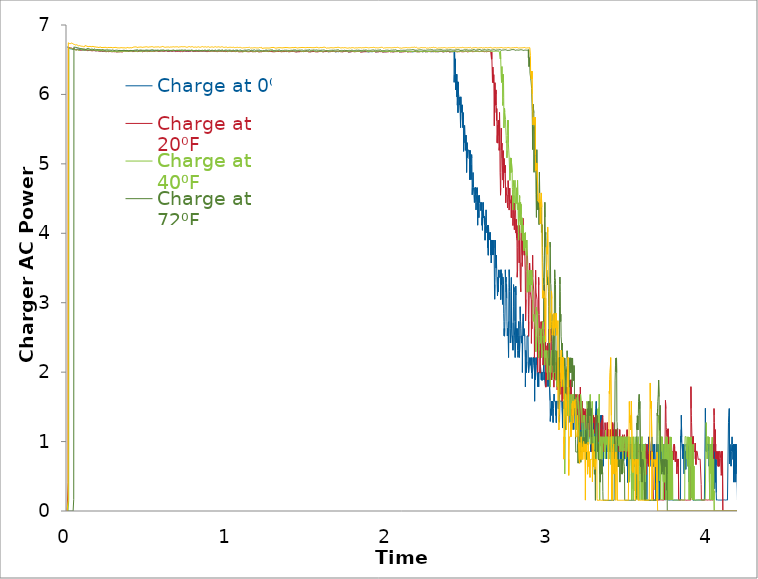
| Category | Charge at 0⁰F | Charge at 20⁰F | Charge at 40⁰F | Charge at 72⁰F | Charge at 95⁰F |
|---|---|---|---|---|---|
| 0.0138888888888889 | 6.688 | 0 | 0 | 0 | 0 |
| 0.0152777777777778 | 6.687 | 0 | 0 | 0 | 0 |
| 0.0166666666666667 | 6.683 | 0 | 0 | 0 | 0 |
| 0.0180555555555556 | 6.68 | 0 | 0 | 0 | 0 |
| 0.0194444444444444 | 6.679 | 0 | 0 | 0 | 0 |
| 0.0208333333333333 | 6.674 | 0.409 | 0 | 0 | 0.147 |
| 0.0222222222222222 | 6.677 | 6.667 | 0 | 0 | 6.744 |
| 0.0236111111111111 | 6.675 | 6.673 | 0 | 0 | 6.743 |
| 0.025 | 6.678 | 6.677 | 0.154 | 0 | 6.737 |
| 0.0263888888888889 | 6.673 | 6.669 | 6.667 | 0 | 6.741 |
| 0.0277777777777778 | 6.672 | 6.666 | 6.664 | 0 | 6.738 |
| 0.0291666666666667 | 6.673 | 6.674 | 6.671 | 0 | 6.734 |
| 0.0305555555555556 | 6.663 | 6.671 | 6.66 | 0 | 6.736 |
| 0.0319444444444444 | 6.666 | 6.673 | 6.666 | 0 | 6.742 |
| 0.0333333333333333 | 6.667 | 6.665 | 6.661 | 0 | 6.733 |
| 0.0347222222222222 | 6.656 | 6.664 | 6.658 | 0 | 6.732 |
| 0.0361111111111111 | 6.659 | 6.671 | 6.668 | 0 | 6.731 |
| 0.0375 | 6.66 | 6.67 | 6.667 | 0 | 6.731 |
| 0.0388888888888889 | 6.657 | 6.668 | 6.661 | 0 | 6.744 |
| 0.0402777777777778 | 6.661 | 6.671 | 6.663 | 0 | 6.744 |
| 0.0416666666666667 | 6.657 | 6.668 | 6.657 | 0 | 6.744 |
| 0.0430555555555556 | 6.654 | 6.669 | 6.663 | 0 | 6.739 |
| 0.0444444444444444 | 6.649 | 6.665 | 6.657 | 0 | 6.736 |
| 0.0458333333333333 | 6.65 | 6.673 | 6.655 | 0 | 6.742 |
| 0.0472222222222222 | 6.651 | 6.663 | 6.659 | 0 | 6.735 |
| 0.0486111111111111 | 6.652 | 6.665 | 6.651 | 0 | 6.736 |
| 0.05 | 6.653 | 6.658 | 6.652 | 0 | 6.735 |
| 0.0513888888888889 | 6.646 | 6.664 | 6.653 | 0 | 6.731 |
| 0.0527777777777778 | 6.648 | 6.666 | 6.656 | 0 | 6.734 |
| 0.0541666666666667 | 6.65 | 6.66 | 6.648 | 0 | 6.729 |
| 0.0555555555555556 | 6.648 | 6.658 | 6.646 | 0 | 6.73 |
| 0.0569444444444444 | 6.645 | 6.659 | 6.646 | 0 | 6.726 |
| 0.0583333333333333 | 6.645 | 6.656 | 6.65 | 0 | 6.731 |
| 0.0597222222222222 | 6.652 | 6.65 | 6.649 | 0.167 | 6.721 |
| 0.0611111111111111 | 6.65 | 6.651 | 6.652 | 6.685 | 6.724 |
| 0.0625 | 6.653 | 6.656 | 6.646 | 6.686 | 6.729 |
| 0.0638888888888889 | 6.649 | 6.657 | 6.649 | 6.68 | 6.721 |
| 0.0652777777777778 | 6.647 | 6.653 | 6.648 | 6.68 | 6.723 |
| 0.0666666666666667 | 6.645 | 6.652 | 6.647 | 6.678 | 6.721 |
| 0.0680555555555556 | 6.643 | 6.644 | 6.649 | 6.676 | 6.725 |
| 0.0694444444444445 | 6.648 | 6.648 | 6.644 | 6.685 | 6.713 |
| 0.0708333333333333 | 6.65 | 6.644 | 6.644 | 6.683 | 6.712 |
| 0.0722222222222222 | 6.645 | 6.642 | 6.647 | 6.676 | 6.714 |
| 0.0736111111111111 | 6.646 | 6.645 | 6.644 | 6.685 | 6.713 |
| 0.075 | 6.643 | 6.642 | 6.639 | 6.68 | 6.716 |
| 0.0763888888888889 | 6.649 | 6.644 | 6.641 | 6.685 | 6.716 |
| 0.0777777777777778 | 6.647 | 6.641 | 6.637 | 6.673 | 6.716 |
| 0.0791666666666667 | 6.645 | 6.642 | 6.639 | 6.678 | 6.711 |
| 0.0805555555555556 | 6.641 | 6.644 | 6.645 | 6.674 | 6.71 |
| 0.0819444444444444 | 6.644 | 6.642 | 6.639 | 6.674 | 6.713 |
| 0.0833333333333333 | 6.652 | 6.653 | 6.64 | 6.678 | 6.709 |
| 0.0847222222222222 | 6.643 | 6.648 | 6.64 | 6.676 | 6.711 |
| 0.0861111111111111 | 6.638 | 6.644 | 6.638 | 6.671 | 6.704 |
| 0.0875 | 6.647 | 6.643 | 6.643 | 6.671 | 6.705 |
| 0.0888888888888889 | 6.644 | 6.644 | 6.644 | 6.671 | 6.702 |
| 0.0902777777777778 | 6.654 | 6.64 | 6.642 | 6.675 | 6.703 |
| 0.0916666666666667 | 6.645 | 6.639 | 6.637 | 6.675 | 6.7 |
| 0.0930555555555556 | 6.654 | 6.639 | 6.636 | 6.676 | 6.696 |
| 0.0944444444444444 | 6.646 | 6.645 | 6.643 | 6.666 | 6.693 |
| 0.0958333333333333 | 6.652 | 6.641 | 6.638 | 6.666 | 6.704 |
| 0.0972222222222222 | 6.651 | 6.639 | 6.637 | 6.666 | 6.705 |
| 0.0986111111111111 | 6.649 | 6.639 | 6.631 | 6.668 | 6.703 |
| 0.1 | 6.648 | 6.638 | 6.641 | 6.657 | 6.698 |
| 0.101388888888889 | 6.649 | 6.642 | 6.64 | 6.666 | 6.696 |
| 0.102777777777778 | 6.643 | 6.641 | 6.633 | 6.662 | 6.705 |
| 0.104166666666667 | 6.648 | 6.636 | 6.638 | 6.669 | 6.703 |
| 0.105555555555556 | 6.644 | 6.635 | 6.637 | 6.662 | 6.699 |
| 0.106944444444444 | 6.642 | 6.64 | 6.636 | 6.661 | 6.699 |
| 0.108333333333333 | 6.648 | 6.638 | 6.641 | 6.659 | 6.694 |
| 0.109722222222222 | 6.641 | 6.641 | 6.65 | 6.659 | 6.701 |
| 0.111111111111111 | 6.642 | 6.641 | 6.646 | 6.662 | 6.697 |
| 0.1125 | 6.645 | 6.639 | 6.644 | 6.659 | 6.695 |
| 0.113888888888889 | 6.641 | 6.634 | 6.643 | 6.669 | 6.687 |
| 0.115277777777778 | 6.644 | 6.634 | 6.641 | 6.664 | 6.698 |
| 0.116666666666667 | 6.642 | 6.64 | 6.647 | 6.66 | 6.692 |
| 0.118055555555556 | 6.641 | 6.647 | 6.645 | 6.659 | 6.691 |
| 0.119444444444444 | 6.641 | 6.641 | 6.639 | 6.658 | 6.694 |
| 0.120833333333333 | 6.638 | 6.639 | 6.644 | 6.654 | 6.696 |
| 0.122222222222222 | 6.643 | 6.641 | 6.639 | 6.66 | 6.689 |
| 0.123611111111111 | 6.637 | 6.643 | 6.636 | 6.656 | 6.686 |
| 0.125 | 6.641 | 6.645 | 6.641 | 6.654 | 6.693 |
| 0.126388888888889 | 6.637 | 6.643 | 6.639 | 6.653 | 6.688 |
| 0.127777777777778 | 6.643 | 6.637 | 6.648 | 6.661 | 6.686 |
| 0.129166666666667 | 6.638 | 6.644 | 6.638 | 6.659 | 6.693 |
| 0.130555555555556 | 6.642 | 6.641 | 6.641 | 6.655 | 6.688 |
| 0.131944444444444 | 6.637 | 6.638 | 6.64 | 6.648 | 6.684 |
| 0.133333333333333 | 6.637 | 6.643 | 6.638 | 6.656 | 6.686 |
| 0.134722222222222 | 6.636 | 6.64 | 6.641 | 6.653 | 6.688 |
| 0.136111111111111 | 6.635 | 6.646 | 6.637 | 6.651 | 6.695 |
| 0.1375 | 6.639 | 6.637 | 6.641 | 6.653 | 6.704 |
| 0.138888888888889 | 6.637 | 6.633 | 6.634 | 6.652 | 6.695 |
| 0.140277777777778 | 6.639 | 6.64 | 6.641 | 6.649 | 6.702 |
| 0.141666666666667 | 6.627 | 6.635 | 6.639 | 6.647 | 6.697 |
| 0.143055555555556 | 6.634 | 6.642 | 6.638 | 6.656 | 6.697 |
| 0.144444444444444 | 6.635 | 6.634 | 6.637 | 6.647 | 6.699 |
| 0.145833333333333 | 6.641 | 6.638 | 6.634 | 6.645 | 6.694 |
| 0.147222222222222 | 6.628 | 6.637 | 6.644 | 6.652 | 6.7 |
| 0.148611111111111 | 6.636 | 6.635 | 6.638 | 6.65 | 6.696 |
| 0.15 | 6.638 | 6.638 | 6.64 | 6.655 | 6.689 |
| 0.151388888888889 | 6.637 | 6.632 | 6.643 | 6.659 | 6.695 |
| 0.152777777777778 | 6.641 | 6.638 | 6.647 | 6.657 | 6.693 |
| 0.154166666666667 | 6.635 | 6.631 | 6.637 | 6.662 | 6.697 |
| 0.155555555555556 | 6.639 | 6.637 | 6.638 | 6.658 | 6.694 |
| 0.156944444444444 | 6.636 | 6.632 | 6.637 | 6.656 | 6.703 |
| 0.158333333333333 | 6.636 | 6.638 | 6.642 | 6.661 | 6.689 |
| 0.159722222222222 | 6.633 | 6.634 | 6.641 | 6.653 | 6.697 |
| 0.161111111111111 | 6.636 | 6.636 | 6.647 | 6.662 | 6.694 |
| 0.1625 | 6.636 | 6.631 | 6.633 | 6.657 | 6.693 |
| 0.163888888888889 | 6.638 | 6.635 | 6.642 | 6.652 | 6.692 |
| 0.165277777777778 | 6.631 | 6.632 | 6.64 | 6.657 | 6.688 |
| 0.166666666666667 | 6.633 | 6.637 | 6.639 | 6.65 | 6.694 |
| 0.168055555555556 | 6.641 | 6.635 | 6.639 | 6.659 | 6.688 |
| 0.169444444444444 | 6.632 | 6.633 | 6.64 | 6.654 | 6.692 |
| 0.170833333333333 | 6.634 | 6.629 | 6.643 | 6.663 | 6.691 |
| 0.172222222222222 | 6.633 | 6.632 | 6.637 | 6.652 | 6.694 |
| 0.173611111111111 | 6.64 | 6.632 | 6.64 | 6.657 | 6.691 |
| 0.175 | 6.63 | 6.632 | 6.637 | 6.656 | 6.694 |
| 0.176388888888889 | 6.635 | 6.626 | 6.641 | 6.653 | 6.69 |
| 0.177777777777778 | 6.638 | 6.633 | 6.636 | 6.653 | 6.691 |
| 0.179166666666667 | 6.631 | 6.628 | 6.64 | 6.647 | 6.689 |
| 0.180555555555556 | 6.633 | 6.631 | 6.631 | 6.652 | 6.692 |
| 0.181944444444444 | 6.632 | 6.63 | 6.636 | 6.649 | 6.688 |
| 0.183333333333333 | 6.637 | 6.634 | 6.64 | 6.649 | 6.692 |
| 0.184722222222222 | 6.636 | 6.626 | 6.635 | 6.65 | 6.69 |
| 0.186111111111111 | 6.631 | 6.632 | 6.641 | 6.656 | 6.686 |
| 0.1875 | 6.635 | 6.624 | 6.634 | 6.65 | 6.687 |
| 0.188888888888889 | 6.628 | 6.628 | 6.639 | 6.653 | 6.69 |
| 0.190277777777778 | 6.633 | 6.631 | 6.636 | 6.648 | 6.694 |
| 0.191666666666667 | 6.634 | 6.629 | 6.637 | 6.654 | 6.691 |
| 0.193055555555556 | 6.632 | 6.636 | 6.638 | 6.648 | 6.695 |
| 0.194444444444444 | 6.633 | 6.626 | 6.635 | 6.65 | 6.685 |
| 0.195833333333333 | 6.627 | 6.631 | 6.64 | 6.648 | 6.687 |
| 0.197222222222222 | 6.63 | 6.621 | 6.633 | 6.653 | 6.687 |
| 0.198611111111111 | 6.633 | 6.627 | 6.634 | 6.645 | 6.689 |
| 0.2 | 6.632 | 6.626 | 6.638 | 6.648 | 6.684 |
| 0.201388888888889 | 6.634 | 6.627 | 6.634 | 6.644 | 6.686 |
| 0.202777777777778 | 6.636 | 6.631 | 6.636 | 6.652 | 6.688 |
| 0.204166666666667 | 6.628 | 6.625 | 6.637 | 6.655 | 6.684 |
| 0.205555555555556 | 6.63 | 6.63 | 6.636 | 6.652 | 6.689 |
| 0.206944444444444 | 6.624 | 6.627 | 6.64 | 6.657 | 6.687 |
| 0.208333333333333 | 6.629 | 6.625 | 6.631 | 6.643 | 6.689 |
| 0.209722222222222 | 6.634 | 6.629 | 6.634 | 6.647 | 6.685 |
| 0.211111111111111 | 6.63 | 6.625 | 6.638 | 6.647 | 6.685 |
| 0.2125 | 6.631 | 6.632 | 6.629 | 6.652 | 6.688 |
| 0.213888888888889 | 6.634 | 6.623 | 6.636 | 6.642 | 6.682 |
| 0.215277777777778 | 6.63 | 6.626 | 6.632 | 6.648 | 6.686 |
| 0.216666666666667 | 6.633 | 6.627 | 6.634 | 6.65 | 6.683 |
| 0.218055555555556 | 6.637 | 6.621 | 6.638 | 6.645 | 6.687 |
| 0.219444444444444 | 6.636 | 6.627 | 6.628 | 6.65 | 6.689 |
| 0.220833333333333 | 6.633 | 6.629 | 6.632 | 6.646 | 6.68 |
| 0.222222222222222 | 6.632 | 6.628 | 6.636 | 6.651 | 6.685 |
| 0.223611111111111 | 6.628 | 6.629 | 6.632 | 6.644 | 6.685 |
| 0.225 | 6.627 | 6.621 | 6.633 | 6.645 | 6.682 |
| 0.226388888888889 | 6.633 | 6.625 | 6.636 | 6.65 | 6.685 |
| 0.227777777777778 | 6.626 | 6.632 | 6.629 | 6.645 | 6.68 |
| 0.229166666666667 | 6.631 | 6.626 | 6.633 | 6.648 | 6.682 |
| 0.230555555555556 | 6.631 | 6.625 | 6.632 | 6.646 | 6.686 |
| 0.231944444444444 | 6.624 | 6.628 | 6.627 | 6.646 | 6.681 |
| 0.233333333333333 | 6.626 | 6.624 | 6.631 | 6.654 | 6.685 |
| 0.234722222222222 | 6.629 | 6.623 | 6.633 | 6.643 | 6.674 |
| 0.236111111111111 | 6.628 | 6.625 | 6.628 | 6.649 | 6.678 |
| 0.2375 | 6.628 | 6.623 | 6.632 | 6.639 | 6.682 |
| 0.238888888888889 | 6.633 | 6.626 | 6.632 | 6.643 | 6.679 |
| 0.240277777777778 | 6.627 | 6.618 | 6.629 | 6.648 | 6.682 |
| 0.241666666666667 | 6.624 | 6.623 | 6.633 | 6.645 | 6.685 |
| 0.243055555555556 | 6.627 | 6.628 | 6.638 | 6.648 | 6.679 |
| 0.244444444444444 | 6.629 | 6.621 | 6.628 | 6.645 | 6.681 |
| 0.245833333333333 | 6.624 | 6.626 | 6.633 | 6.644 | 6.684 |
| 0.247222222222222 | 6.628 | 6.628 | 6.636 | 6.646 | 6.675 |
| 0.248611111111111 | 6.63 | 6.629 | 6.626 | 6.64 | 6.678 |
| 0.25 | 6.628 | 6.625 | 6.628 | 6.644 | 6.677 |
| 0.251388888888889 | 6.628 | 6.626 | 6.633 | 6.648 | 6.676 |
| 0.252777777777778 | 6.631 | 6.622 | 6.627 | 6.642 | 6.679 |
| 0.254166666666667 | 6.617 | 6.621 | 6.63 | 6.642 | 6.674 |
| 0.255555555555556 | 6.622 | 6.626 | 6.634 | 6.644 | 6.674 |
| 0.256944444444444 | 6.623 | 6.621 | 6.624 | 6.64 | 6.677 |
| 0.258333333333333 | 6.624 | 6.62 | 6.627 | 6.645 | 6.675 |
| 0.259722222222222 | 6.621 | 6.624 | 6.632 | 6.641 | 6.676 |
| 0.261111111111111 | 6.623 | 6.624 | 6.631 | 6.638 | 6.679 |
| 0.2625 | 6.627 | 6.618 | 6.626 | 6.645 | 6.677 |
| 0.263888888888889 | 6.62 | 6.621 | 6.631 | 6.636 | 6.674 |
| 0.265277777777778 | 6.624 | 6.624 | 6.633 | 6.642 | 6.679 |
| 0.266666666666667 | 6.627 | 6.622 | 6.624 | 6.642 | 6.675 |
| 0.268055555555556 | 6.629 | 6.623 | 6.628 | 6.636 | 6.672 |
| 0.269444444444444 | 6.62 | 6.624 | 6.629 | 6.639 | 6.677 |
| 0.270833333333333 | 6.623 | 6.617 | 6.628 | 6.644 | 6.678 |
| 0.272222222222222 | 6.628 | 6.622 | 6.626 | 6.639 | 6.679 |
| 0.273611111111111 | 6.623 | 6.622 | 6.629 | 6.641 | 6.678 |
| 0.275 | 6.625 | 6.619 | 6.628 | 6.646 | 6.681 |
| 0.276388888888889 | 6.626 | 6.62 | 6.626 | 6.639 | 6.678 |
| 0.277777777777778 | 6.628 | 6.624 | 6.628 | 6.639 | 6.681 |
| 0.279166666666667 | 6.621 | 6.617 | 6.631 | 6.642 | 6.681 |
| 0.280555555555556 | 6.619 | 6.622 | 6.618 | 6.635 | 6.683 |
| 0.281944444444444 | 6.622 | 6.625 | 6.618 | 6.638 | 6.675 |
| 0.283333333333333 | 6.622 | 6.628 | 6.625 | 6.641 | 6.678 |
| 0.284722222222222 | 6.62 | 6.614 | 6.626 | 6.64 | 6.68 |
| 0.286111111111111 | 6.622 | 6.616 | 6.622 | 6.638 | 6.673 |
| 0.2875 | 6.62 | 6.619 | 6.623 | 6.644 | 6.676 |
| 0.288888888888889 | 6.62 | 6.613 | 6.625 | 6.64 | 6.677 |
| 0.290277777777778 | 6.622 | 6.616 | 6.621 | 6.641 | 6.668 |
| 0.291666666666667 | 6.623 | 6.618 | 6.625 | 6.645 | 6.674 |
| 0.293055555555556 | 6.626 | 6.619 | 6.626 | 6.647 | 6.678 |
| 0.294444444444444 | 6.621 | 6.618 | 6.629 | 6.636 | 6.673 |
| 0.295833333333333 | 6.618 | 6.621 | 6.616 | 6.64 | 6.675 |
| 0.297222222222222 | 6.622 | 6.624 | 6.626 | 6.642 | 6.677 |
| 0.298611111111111 | 6.623 | 6.614 | 6.625 | 6.636 | 6.677 |
| 0.3 | 6.619 | 6.616 | 6.626 | 6.635 | 6.671 |
| 0.301388888888889 | 6.62 | 6.618 | 6.622 | 6.64 | 6.676 |
| 0.302777777777778 | 6.621 | 6.621 | 6.624 | 6.641 | 6.679 |
| 0.304166666666667 | 6.623 | 6.616 | 6.625 | 6.637 | 6.676 |
| 0.305555555555556 | 6.619 | 6.616 | 6.624 | 6.643 | 6.67 |
| 0.306944444444444 | 6.615 | 6.618 | 6.618 | 6.642 | 6.674 |
| 0.308333333333333 | 6.62 | 6.617 | 6.621 | 6.636 | 6.677 |
| 0.309722222222222 | 6.622 | 6.612 | 6.623 | 6.637 | 6.672 |
| 0.311111111111111 | 6.618 | 6.614 | 6.625 | 6.642 | 6.674 |
| 0.3125 | 6.617 | 6.618 | 6.621 | 6.639 | 6.677 |
| 0.313888888888889 | 6.62 | 6.62 | 6.624 | 6.64 | 6.679 |
| 0.315277777777778 | 6.623 | 6.615 | 6.625 | 6.642 | 6.674 |
| 0.316666666666667 | 6.62 | 6.616 | 6.622 | 6.64 | 6.677 |
| 0.318055555555556 | 6.621 | 6.621 | 6.62 | 6.634 | 6.68 |
| 0.319444444444444 | 6.624 | 6.615 | 6.624 | 6.635 | 6.68 |
| 0.320833333333333 | 6.623 | 6.615 | 6.626 | 6.64 | 6.668 |
| 0.322222222222222 | 6.619 | 6.618 | 6.624 | 6.638 | 6.67 |
| 0.323611111111111 | 6.617 | 6.619 | 6.617 | 6.637 | 6.673 |
| 0.325 | 6.618 | 6.619 | 6.618 | 6.64 | 6.671 |
| 0.326388888888889 | 6.62 | 6.612 | 6.623 | 6.642 | 6.67 |
| 0.327777777777778 | 6.623 | 6.615 | 6.624 | 6.638 | 6.675 |
| 0.329166666666667 | 6.617 | 6.619 | 6.617 | 6.64 | 6.675 |
| 0.330555555555556 | 6.617 | 6.613 | 6.624 | 6.642 | 6.672 |
| 0.331944444444444 | 6.621 | 6.614 | 6.622 | 6.64 | 6.673 |
| 0.333333333333333 | 6.62 | 6.619 | 6.626 | 6.631 | 6.676 |
| 0.334722222222222 | 6.617 | 6.616 | 6.616 | 6.633 | 6.68 |
| 0.336111111111111 | 6.616 | 6.615 | 6.619 | 6.635 | 6.669 |
| 0.3375 | 6.615 | 6.612 | 6.619 | 6.635 | 6.674 |
| 0.338888888888889 | 6.617 | 6.615 | 6.621 | 6.632 | 6.675 |
| 0.340277777777778 | 6.623 | 6.618 | 6.616 | 6.633 | 6.675 |
| 0.341666666666667 | 6.613 | 6.615 | 6.614 | 6.637 | 6.675 |
| 0.343055555555556 | 6.616 | 6.613 | 6.62 | 6.643 | 6.673 |
| 0.344444444444444 | 6.62 | 6.616 | 6.619 | 6.634 | 6.674 |
| 0.345833333333333 | 6.617 | 6.618 | 6.622 | 6.635 | 6.677 |
| 0.347222222222222 | 6.62 | 6.62 | 6.618 | 6.64 | 6.678 |
| 0.348611111111111 | 6.615 | 6.615 | 6.619 | 6.633 | 6.67 |
| 0.35 | 6.617 | 6.612 | 6.624 | 6.634 | 6.673 |
| 0.351388888888889 | 6.62 | 6.618 | 6.624 | 6.634 | 6.675 |
| 0.352777777777778 | 6.621 | 6.621 | 6.616 | 6.637 | 6.677 |
| 0.354166666666667 | 6.62 | 6.61 | 6.613 | 6.638 | 6.67 |
| 0.355555555555556 | 6.615 | 6.611 | 6.617 | 6.632 | 6.671 |
| 0.356944444444444 | 6.614 | 6.613 | 6.622 | 6.635 | 6.676 |
| 0.358333333333333 | 6.618 | 6.616 | 6.624 | 6.638 | 6.676 |
| 0.359722222222222 | 6.62 | 6.618 | 6.616 | 6.638 | 6.671 |
| 0.361111111111111 | 6.614 | 6.613 | 6.617 | 6.631 | 6.673 |
| 0.3625 | 6.615 | 6.613 | 6.621 | 6.632 | 6.677 |
| 0.363888888888889 | 6.618 | 6.616 | 6.621 | 6.635 | 6.678 |
| 0.365277777777778 | 6.62 | 6.62 | 6.623 | 6.638 | 6.679 |
| 0.366666666666667 | 6.622 | 6.61 | 6.616 | 6.633 | 6.671 |
| 0.368055555555556 | 6.624 | 6.609 | 6.617 | 6.633 | 6.672 |
| 0.369444444444444 | 6.623 | 6.613 | 6.616 | 6.634 | 6.673 |
| 0.370833333333333 | 6.628 | 6.613 | 6.617 | 6.64 | 6.676 |
| 0.372222222222222 | 6.629 | 6.618 | 6.621 | 6.633 | 6.67 |
| 0.373611111111111 | 6.628 | 6.612 | 6.612 | 6.634 | 6.67 |
| 0.375 | 6.632 | 6.613 | 6.616 | 6.636 | 6.675 |
| 0.376388888888889 | 6.632 | 6.615 | 6.619 | 6.638 | 6.674 |
| 0.377777777777778 | 6.621 | 6.615 | 6.619 | 6.639 | 6.679 |
| 0.379166666666667 | 6.625 | 6.618 | 6.62 | 6.632 | 6.668 |
| 0.380555555555556 | 6.624 | 6.611 | 6.614 | 6.634 | 6.671 |
| 0.381944444444444 | 6.628 | 6.613 | 6.614 | 6.637 | 6.671 |
| 0.383333333333333 | 6.625 | 6.615 | 6.619 | 6.636 | 6.675 |
| 0.384722222222222 | 6.63 | 6.617 | 6.618 | 6.633 | 6.674 |
| 0.386111111111111 | 6.628 | 6.617 | 6.623 | 6.634 | 6.671 |
| 0.3875 | 6.622 | 6.608 | 6.616 | 6.633 | 6.673 |
| 0.388888888888889 | 6.626 | 6.611 | 6.614 | 6.638 | 6.674 |
| 0.390277777777778 | 6.624 | 6.612 | 6.615 | 6.639 | 6.678 |
| 0.391666666666667 | 6.629 | 6.614 | 6.618 | 6.628 | 6.676 |
| 0.393055555555556 | 6.627 | 6.613 | 6.617 | 6.631 | 6.669 |
| 0.394444444444444 | 6.631 | 6.611 | 6.619 | 6.633 | 6.672 |
| 0.395833333333333 | 6.63 | 6.611 | 6.613 | 6.637 | 6.677 |
| 0.397222222222222 | 6.627 | 6.612 | 6.612 | 6.633 | 6.677 |
| 0.398611111111111 | 6.626 | 6.613 | 6.617 | 6.632 | 6.672 |
| 0.4 | 6.627 | 6.616 | 6.618 | 6.633 | 6.668 |
| 0.401388888888889 | 6.63 | 6.614 | 6.619 | 6.634 | 6.67 |
| 0.402777777777778 | 6.629 | 6.619 | 6.619 | 6.637 | 6.675 |
| 0.404166666666667 | 6.632 | 6.621 | 6.622 | 6.634 | 6.676 |
| 0.405555555555556 | 6.63 | 6.621 | 6.624 | 6.63 | 6.677 |
| 0.406944444444444 | 6.629 | 6.622 | 6.626 | 6.633 | 6.669 |
| 0.408333333333333 | 6.631 | 6.624 | 6.626 | 6.637 | 6.672 |
| 0.409722222222222 | 6.631 | 6.627 | 6.628 | 6.636 | 6.674 |
| 0.411111111111111 | 6.633 | 6.623 | 6.628 | 6.627 | 6.675 |
| 0.4125 | 6.634 | 6.617 | 6.629 | 6.631 | 6.677 |
| 0.413888888888889 | 6.634 | 6.615 | 6.626 | 6.631 | 6.666 |
| 0.415277777777778 | 6.625 | 6.618 | 6.618 | 6.631 | 6.67 |
| 0.416666666666667 | 6.627 | 6.62 | 6.62 | 6.636 | 6.67 |
| 0.418055555555556 | 6.623 | 6.623 | 6.622 | 6.635 | 6.674 |
| 0.419444444444444 | 6.626 | 6.623 | 6.621 | 6.632 | 6.673 |
| 0.420833333333333 | 6.627 | 6.622 | 6.624 | 6.632 | 6.672 |
| 0.422222222222222 | 6.628 | 6.626 | 6.624 | 6.635 | 6.668 |
| 0.423611111111111 | 6.627 | 6.62 | 6.625 | 6.636 | 6.669 |
| 0.425 | 6.624 | 6.619 | 6.624 | 6.633 | 6.67 |
| 0.426388888888889 | 6.627 | 6.62 | 6.626 | 6.628 | 6.672 |
| 0.427777777777778 | 6.629 | 6.621 | 6.624 | 6.631 | 6.675 |
| 0.429166666666667 | 6.628 | 6.619 | 6.619 | 6.633 | 6.675 |
| 0.430555555555556 | 6.629 | 6.624 | 6.62 | 6.632 | 6.672 |
| 0.431944444444444 | 6.63 | 6.62 | 6.622 | 6.634 | 6.67 |
| 0.433333333333333 | 6.632 | 6.62 | 6.623 | 6.633 | 6.673 |
| 0.434722222222222 | 6.628 | 6.627 | 6.623 | 6.628 | 6.674 |
| 0.436111111111111 | 6.626 | 6.624 | 6.624 | 6.63 | 6.674 |
| 0.4375 | 6.623 | 6.624 | 6.628 | 6.632 | 6.675 |
| 0.438888888888889 | 6.625 | 6.62 | 6.625 | 6.635 | 6.676 |
| 0.440277777777778 | 6.627 | 6.619 | 6.625 | 6.633 | 6.679 |
| 0.441666666666667 | 6.625 | 6.619 | 6.625 | 6.629 | 6.67 |
| 0.443055555555556 | 6.627 | 6.621 | 6.625 | 6.629 | 6.669 |
| 0.444444444444444 | 6.626 | 6.62 | 6.626 | 6.631 | 6.667 |
| 0.445833333333333 | 6.626 | 6.622 | 6.628 | 6.632 | 6.669 |
| 0.447222222222222 | 6.626 | 6.623 | 6.626 | 6.633 | 6.671 |
| 0.448611111111111 | 6.627 | 6.622 | 6.625 | 6.636 | 6.677 |
| 0.45 | 6.627 | 6.627 | 6.624 | 6.634 | 6.674 |
| 0.451388888888889 | 6.629 | 6.624 | 6.624 | 6.633 | 6.673 |
| 0.452777777777778 | 6.627 | 6.624 | 6.623 | 6.627 | 6.673 |
| 0.454166666666667 | 6.629 | 6.625 | 6.62 | 6.63 | 6.668 |
| 0.455555555555556 | 6.63 | 6.623 | 6.622 | 6.63 | 6.67 |
| 0.456944444444444 | 6.629 | 6.625 | 6.623 | 6.633 | 6.67 |
| 0.458333333333333 | 6.631 | 6.628 | 6.625 | 6.634 | 6.672 |
| 0.459722222222222 | 6.632 | 6.625 | 6.622 | 6.632 | 6.669 |
| 0.461111111111111 | 6.632 | 6.624 | 6.625 | 6.633 | 6.672 |
| 0.4625 | 6.633 | 6.629 | 6.626 | 6.63 | 6.676 |
| 0.463888888888889 | 6.631 | 6.62 | 6.623 | 6.628 | 6.673 |
| 0.465277777777778 | 6.63 | 6.617 | 6.624 | 6.629 | 6.676 |
| 0.466666666666667 | 6.633 | 6.617 | 6.626 | 6.628 | 6.677 |
| 0.468055555555556 | 6.626 | 6.615 | 6.626 | 6.628 | 6.682 |
| 0.469444444444444 | 6.629 | 6.616 | 6.626 | 6.63 | 6.678 |
| 0.470833333333333 | 6.626 | 6.618 | 6.628 | 6.632 | 6.68 |
| 0.472222222222222 | 6.621 | 6.616 | 6.628 | 6.631 | 6.681 |
| 0.473611111111111 | 6.624 | 6.618 | 6.627 | 6.634 | 6.68 |
| 0.475 | 6.622 | 6.618 | 6.628 | 6.634 | 6.681 |
| 0.476388888888889 | 6.623 | 6.622 | 6.624 | 6.636 | 6.682 |
| 0.477777777777778 | 6.626 | 6.62 | 6.626 | 6.636 | 6.683 |
| 0.479166666666667 | 6.624 | 6.62 | 6.627 | 6.635 | 6.681 |
| 0.480555555555556 | 6.625 | 6.618 | 6.626 | 6.635 | 6.684 |
| 0.481944444444444 | 6.623 | 6.621 | 6.619 | 6.638 | 6.684 |
| 0.483333333333333 | 6.625 | 6.622 | 6.618 | 6.636 | 6.684 |
| 0.484722222222222 | 6.627 | 6.619 | 6.62 | 6.638 | 6.684 |
| 0.486111111111111 | 6.623 | 6.622 | 6.619 | 6.64 | 6.684 |
| 0.4875 | 6.625 | 6.622 | 6.62 | 6.641 | 6.686 |
| 0.488888888888889 | 6.628 | 6.624 | 6.619 | 6.641 | 6.686 |
| 0.490277777777778 | 6.625 | 6.625 | 6.621 | 6.64 | 6.686 |
| 0.491666666666667 | 6.628 | 6.623 | 6.619 | 6.639 | 6.686 |
| 0.493055555555556 | 6.625 | 6.623 | 6.621 | 6.641 | 6.684 |
| 0.494444444444444 | 6.627 | 6.624 | 6.62 | 6.644 | 6.681 |
| 0.495833333333333 | 6.626 | 6.62 | 6.621 | 6.643 | 6.681 |
| 0.497222222222222 | 6.627 | 6.618 | 6.622 | 6.644 | 6.679 |
| 0.498611111111111 | 6.627 | 6.623 | 6.62 | 6.645 | 6.676 |
| 0.5 | 6.626 | 6.619 | 6.625 | 6.641 | 6.679 |
| 0.501388888888889 | 6.626 | 6.617 | 6.623 | 6.636 | 6.676 |
| 0.502777777777778 | 6.627 | 6.621 | 6.626 | 6.634 | 6.678 |
| 0.504166666666667 | 6.628 | 6.617 | 6.624 | 6.634 | 6.678 |
| 0.505555555555556 | 6.623 | 6.621 | 6.626 | 6.634 | 6.68 |
| 0.506944444444444 | 6.622 | 6.62 | 6.626 | 6.632 | 6.679 |
| 0.508333333333333 | 6.624 | 6.619 | 6.623 | 6.634 | 6.68 |
| 0.509722222222222 | 6.625 | 6.62 | 6.624 | 6.633 | 6.68 |
| 0.511111111111111 | 6.627 | 6.621 | 6.627 | 6.637 | 6.68 |
| 0.5125 | 6.623 | 6.621 | 6.628 | 6.636 | 6.68 |
| 0.513888888888889 | 6.623 | 6.622 | 6.626 | 6.636 | 6.68 |
| 0.515277777777778 | 6.624 | 6.625 | 6.625 | 6.637 | 6.681 |
| 0.516666666666667 | 6.627 | 6.62 | 6.626 | 6.636 | 6.682 |
| 0.518055555555556 | 6.625 | 6.622 | 6.621 | 6.641 | 6.684 |
| 0.519444444444445 | 6.626 | 6.623 | 6.62 | 6.639 | 6.683 |
| 0.520833333333333 | 6.626 | 6.626 | 6.62 | 6.641 | 6.684 |
| 0.522222222222222 | 6.629 | 6.625 | 6.622 | 6.639 | 6.683 |
| 0.523611111111111 | 6.626 | 6.623 | 6.62 | 6.64 | 6.685 |
| 0.525 | 6.63 | 6.626 | 6.622 | 6.642 | 6.684 |
| 0.526388888888889 | 6.627 | 6.624 | 6.62 | 6.639 | 6.683 |
| 0.527777777777778 | 6.626 | 6.626 | 6.622 | 6.638 | 6.684 |
| 0.529166666666667 | 6.626 | 6.627 | 6.622 | 6.64 | 6.684 |
| 0.530555555555556 | 6.627 | 6.628 | 6.621 | 6.641 | 6.681 |
| 0.531944444444444 | 6.631 | 6.626 | 6.62 | 6.638 | 6.679 |
| 0.533333333333333 | 6.63 | 6.624 | 6.623 | 6.636 | 6.678 |
| 0.534722222222222 | 6.625 | 6.618 | 6.624 | 6.634 | 6.678 |
| 0.536111111111111 | 6.628 | 6.614 | 6.625 | 6.638 | 6.68 |
| 0.5375 | 6.631 | 6.615 | 6.624 | 6.636 | 6.681 |
| 0.538888888888889 | 6.629 | 6.616 | 6.623 | 6.636 | 6.681 |
| 0.540277777777778 | 6.629 | 6.619 | 6.624 | 6.637 | 6.68 |
| 0.541666666666667 | 6.624 | 6.62 | 6.624 | 6.633 | 6.681 |
| 0.543055555555556 | 6.626 | 6.619 | 6.623 | 6.634 | 6.682 |
| 0.544444444444444 | 6.625 | 6.619 | 6.628 | 6.636 | 6.682 |
| 0.545833333333333 | 6.624 | 6.619 | 6.628 | 6.637 | 6.681 |
| 0.547222222222222 | 6.623 | 6.618 | 6.626 | 6.634 | 6.682 |
| 0.548611111111111 | 6.623 | 6.621 | 6.627 | 6.637 | 6.683 |
| 0.55 | 6.625 | 6.619 | 6.627 | 6.639 | 6.68 |
| 0.551388888888889 | 6.624 | 6.619 | 6.63 | 6.64 | 6.681 |
| 0.552777777777778 | 6.624 | 6.618 | 6.627 | 6.638 | 6.682 |
| 0.554166666666667 | 6.625 | 6.622 | 6.625 | 6.637 | 6.684 |
| 0.555555555555556 | 6.626 | 6.62 | 6.624 | 6.639 | 6.684 |
| 0.556944444444445 | 6.627 | 6.623 | 6.621 | 6.639 | 6.684 |
| 0.558333333333333 | 6.624 | 6.622 | 6.616 | 6.641 | 6.685 |
| 0.559722222222222 | 6.625 | 6.622 | 6.62 | 6.64 | 6.686 |
| 0.561111111111111 | 6.627 | 6.623 | 6.618 | 6.64 | 6.687 |
| 0.5625 | 6.627 | 6.623 | 6.619 | 6.639 | 6.684 |
| 0.563888888888889 | 6.626 | 6.623 | 6.62 | 6.641 | 6.688 |
| 0.565277777777778 | 6.626 | 6.624 | 6.621 | 6.64 | 6.687 |
| 0.566666666666667 | 6.628 | 6.621 | 6.617 | 6.64 | 6.683 |
| 0.568055555555556 | 6.623 | 6.623 | 6.625 | 6.639 | 6.684 |
| 0.569444444444444 | 6.63 | 6.621 | 6.62 | 6.64 | 6.682 |
| 0.570833333333333 | 6.628 | 6.617 | 6.622 | 6.637 | 6.682 |
| 0.572222222222222 | 6.631 | 6.614 | 6.621 | 6.639 | 6.683 |
| 0.573611111111111 | 6.63 | 6.618 | 6.624 | 6.638 | 6.682 |
| 0.575 | 6.624 | 6.619 | 6.624 | 6.637 | 6.68 |
| 0.576388888888889 | 6.622 | 6.619 | 6.625 | 6.636 | 6.681 |
| 0.577777777777778 | 6.623 | 6.622 | 6.623 | 6.638 | 6.68 |
| 0.579166666666667 | 6.622 | 6.62 | 6.625 | 6.639 | 6.683 |
| 0.580555555555556 | 6.624 | 6.62 | 6.625 | 6.636 | 6.685 |
| 0.581944444444445 | 6.625 | 6.618 | 6.626 | 6.636 | 6.683 |
| 0.583333333333333 | 6.622 | 6.62 | 6.622 | 6.638 | 6.684 |
| 0.584722222222222 | 6.624 | 6.618 | 6.623 | 6.639 | 6.681 |
| 0.586111111111111 | 6.622 | 6.62 | 6.622 | 6.636 | 6.685 |
| 0.5875 | 6.624 | 6.622 | 6.625 | 6.635 | 6.685 |
| 0.588888888888889 | 6.624 | 6.621 | 6.628 | 6.637 | 6.684 |
| 0.590277777777778 | 6.63 | 6.622 | 6.625 | 6.641 | 6.687 |
| 0.591666666666667 | 6.63 | 6.619 | 6.618 | 6.64 | 6.684 |
| 0.593055555555556 | 6.627 | 6.621 | 6.623 | 6.642 | 6.686 |
| 0.594444444444444 | 6.629 | 6.624 | 6.623 | 6.642 | 6.686 |
| 0.595833333333333 | 6.629 | 6.623 | 6.618 | 6.641 | 6.686 |
| 0.597222222222222 | 6.627 | 6.622 | 6.621 | 6.642 | 6.688 |
| 0.598611111111111 | 6.631 | 6.62 | 6.622 | 6.643 | 6.683 |
| 0.6 | 6.629 | 6.623 | 6.623 | 6.645 | 6.689 |
| 0.601388888888889 | 6.631 | 6.622 | 6.622 | 6.643 | 6.69 |
| 0.602777777777778 | 6.629 | 6.622 | 6.623 | 6.644 | 6.689 |
| 0.604166666666667 | 6.627 | 6.622 | 6.624 | 6.641 | 6.69 |
| 0.605555555555556 | 6.628 | 6.619 | 6.624 | 6.644 | 6.691 |
| 0.606944444444444 | 6.629 | 6.622 | 6.623 | 6.647 | 6.688 |
| 0.608333333333333 | 6.628 | 6.62 | 6.622 | 6.642 | 6.686 |
| 0.609722222222222 | 6.629 | 6.617 | 6.624 | 6.64 | 6.682 |
| 0.611111111111111 | 6.633 | 6.619 | 6.624 | 6.636 | 6.679 |
| 0.6125 | 6.625 | 6.618 | 6.623 | 6.634 | 6.68 |
| 0.613888888888889 | 6.622 | 6.62 | 6.625 | 6.633 | 6.679 |
| 0.615277777777778 | 6.624 | 6.62 | 6.626 | 6.632 | 6.679 |
| 0.616666666666667 | 6.627 | 6.621 | 6.627 | 6.635 | 6.68 |
| 0.618055555555556 | 6.626 | 6.62 | 6.626 | 6.636 | 6.68 |
| 0.619444444444445 | 6.628 | 6.62 | 6.627 | 6.634 | 6.68 |
| 0.620833333333333 | 6.63 | 6.622 | 6.628 | 6.637 | 6.683 |
| 0.622222222222222 | 6.627 | 6.62 | 6.624 | 6.636 | 6.681 |
| 0.623611111111111 | 6.628 | 6.618 | 6.627 | 6.638 | 6.684 |
| 0.625 | 6.628 | 6.624 | 6.627 | 6.634 | 6.682 |
| 0.626388888888889 | 6.629 | 6.626 | 6.63 | 6.635 | 6.684 |
| 0.627777777777778 | 6.63 | 6.625 | 6.631 | 6.635 | 6.683 |
| 0.629166666666667 | 6.63 | 6.623 | 6.629 | 6.635 | 6.683 |
| 0.630555555555556 | 6.629 | 6.624 | 6.627 | 6.635 | 6.684 |
| 0.631944444444444 | 6.633 | 6.626 | 6.626 | 6.636 | 6.684 |
| 0.633333333333333 | 6.632 | 6.626 | 6.624 | 6.636 | 6.689 |
| 0.634722222222222 | 6.632 | 6.626 | 6.626 | 6.638 | 6.683 |
| 0.636111111111111 | 6.632 | 6.626 | 6.623 | 6.642 | 6.685 |
| 0.6375 | 6.631 | 6.622 | 6.623 | 6.638 | 6.683 |
| 0.638888888888889 | 6.633 | 6.62 | 6.627 | 6.64 | 6.685 |
| 0.640277777777778 | 6.631 | 6.621 | 6.626 | 6.639 | 6.688 |
| 0.641666666666667 | 6.625 | 6.62 | 6.629 | 6.638 | 6.686 |
| 0.643055555555556 | 6.625 | 6.621 | 6.627 | 6.639 | 6.687 |
| 0.644444444444445 | 6.627 | 6.617 | 6.629 | 6.639 | 6.687 |
| 0.645833333333333 | 6.624 | 6.62 | 6.631 | 6.635 | 6.684 |
| 0.647222222222222 | 6.623 | 6.62 | 6.631 | 6.638 | 6.68 |
| 0.648611111111111 | 6.623 | 6.621 | 6.631 | 6.635 | 6.678 |
| 0.65 | 6.622 | 6.62 | 6.629 | 6.633 | 6.677 |
| 0.651388888888889 | 6.624 | 6.621 | 6.631 | 6.633 | 6.68 |
| 0.652777777777778 | 6.624 | 6.62 | 6.632 | 6.632 | 6.681 |
| 0.654166666666667 | 6.628 | 6.621 | 6.629 | 6.636 | 6.678 |
| 0.655555555555556 | 6.627 | 6.624 | 6.629 | 6.635 | 6.682 |
| 0.656944444444444 | 6.628 | 6.622 | 6.63 | 6.636 | 6.682 |
| 0.658333333333333 | 6.624 | 6.623 | 6.628 | 6.638 | 6.682 |
| 0.659722222222222 | 6.628 | 6.621 | 6.632 | 6.637 | 6.684 |
| 0.661111111111111 | 6.628 | 6.623 | 6.632 | 6.635 | 6.683 |
| 0.6625 | 6.627 | 6.624 | 6.633 | 6.639 | 6.685 |
| 0.663888888888889 | 6.627 | 6.623 | 6.624 | 6.637 | 6.685 |
| 0.665277777777778 | 6.628 | 6.625 | 6.629 | 6.639 | 6.683 |
| 0.666666666666667 | 6.628 | 6.627 | 6.63 | 6.638 | 6.685 |
| 0.668055555555556 | 6.631 | 6.626 | 6.627 | 6.639 | 6.685 |
| 0.669444444444444 | 6.632 | 6.627 | 6.63 | 6.64 | 6.686 |
| 0.670833333333333 | 6.631 | 6.625 | 6.631 | 6.638 | 6.683 |
| 0.672222222222222 | 6.633 | 6.624 | 6.629 | 6.639 | 6.691 |
| 0.673611111111111 | 6.63 | 6.623 | 6.628 | 6.641 | 6.687 |
| 0.675 | 6.629 | 6.621 | 6.632 | 6.64 | 6.685 |
| 0.676388888888889 | 6.627 | 6.622 | 6.63 | 6.642 | 6.686 |
| 0.677777777777778 | 6.622 | 6.623 | 6.63 | 6.644 | 6.686 |
| 0.679166666666667 | 6.623 | 6.619 | 6.627 | 6.642 | 6.689 |
| 0.680555555555556 | 6.625 | 6.62 | 6.63 | 6.639 | 6.689 |
| 0.681944444444445 | 6.626 | 6.622 | 6.629 | 6.64 | 6.689 |
| 0.683333333333333 | 6.625 | 6.624 | 6.632 | 6.637 | 6.685 |
| 0.684722222222222 | 6.623 | 6.621 | 6.629 | 6.632 | 6.681 |
| 0.686111111111111 | 6.625 | 6.623 | 6.633 | 6.636 | 6.682 |
| 0.6875 | 6.628 | 6.625 | 6.632 | 6.629 | 6.678 |
| 0.688888888888889 | 6.625 | 6.621 | 6.633 | 6.633 | 6.68 |
| 0.690277777777778 | 6.626 | 6.625 | 6.634 | 6.633 | 6.68 |
| 0.691666666666667 | 6.627 | 6.622 | 6.634 | 6.631 | 6.681 |
| 0.693055555555556 | 6.628 | 6.623 | 6.636 | 6.631 | 6.679 |
| 0.694444444444444 | 6.631 | 6.625 | 6.633 | 6.635 | 6.681 |
| 0.695833333333333 | 6.629 | 6.626 | 6.633 | 6.637 | 6.681 |
| 0.697222222222222 | 6.63 | 6.628 | 6.633 | 6.635 | 6.681 |
| 0.698611111111111 | 6.63 | 6.625 | 6.63 | 6.632 | 6.681 |
| 0.7 | 6.632 | 6.624 | 6.628 | 6.636 | 6.682 |
| 0.701388888888889 | 6.631 | 6.625 | 6.626 | 6.635 | 6.684 |
| 0.702777777777778 | 6.63 | 6.627 | 6.629 | 6.634 | 6.681 |
| 0.704166666666667 | 6.623 | 6.623 | 6.635 | 6.637 | 6.682 |
| 0.705555555555556 | 6.623 | 6.617 | 6.633 | 6.634 | 6.68 |
| 0.706944444444445 | 6.621 | 6.618 | 6.628 | 6.637 | 6.682 |
| 0.708333333333333 | 6.623 | 6.617 | 6.63 | 6.638 | 6.684 |
| 0.709722222222222 | 6.622 | 6.619 | 6.634 | 6.635 | 6.685 |
| 0.711111111111111 | 6.623 | 6.619 | 6.632 | 6.637 | 6.684 |
| 0.7125 | 6.623 | 6.619 | 6.632 | 6.638 | 6.687 |
| 0.713888888888889 | 6.623 | 6.619 | 6.634 | 6.639 | 6.685 |
| 0.715277777777778 | 6.623 | 6.62 | 6.635 | 6.639 | 6.684 |
| 0.716666666666667 | 6.626 | 6.621 | 6.634 | 6.638 | 6.684 |
| 0.718055555555556 | 6.622 | 6.62 | 6.636 | 6.634 | 6.684 |
| 0.719444444444444 | 6.627 | 6.621 | 6.637 | 6.631 | 6.679 |
| 0.720833333333333 | 6.626 | 6.625 | 6.635 | 6.631 | 6.679 |
| 0.722222222222222 | 6.624 | 6.624 | 6.638 | 6.633 | 6.677 |
| 0.723611111111111 | 6.627 | 6.623 | 6.64 | 6.632 | 6.681 |
| 0.725 | 6.625 | 6.623 | 6.639 | 6.632 | 6.679 |
| 0.726388888888889 | 6.622 | 6.625 | 6.637 | 6.632 | 6.681 |
| 0.727777777777778 | 6.624 | 6.625 | 6.635 | 6.63 | 6.683 |
| 0.729166666666667 | 6.628 | 6.628 | 6.629 | 6.633 | 6.681 |
| 0.730555555555556 | 6.628 | 6.626 | 6.629 | 6.633 | 6.684 |
| 0.731944444444444 | 6.627 | 6.622 | 6.628 | 6.631 | 6.683 |
| 0.733333333333333 | 6.625 | 6.626 | 6.628 | 6.634 | 6.684 |
| 0.734722222222222 | 6.621 | 6.623 | 6.63 | 6.634 | 6.682 |
| 0.736111111111111 | 6.624 | 6.624 | 6.63 | 6.636 | 6.682 |
| 0.7375 | 6.622 | 6.621 | 6.629 | 6.635 | 6.683 |
| 0.738888888888889 | 6.624 | 6.618 | 6.631 | 6.635 | 6.682 |
| 0.740277777777778 | 6.623 | 6.619 | 6.631 | 6.636 | 6.685 |
| 0.741666666666667 | 6.623 | 6.622 | 6.631 | 6.636 | 6.683 |
| 0.743055555555556 | 6.624 | 6.618 | 6.633 | 6.639 | 6.684 |
| 0.744444444444445 | 6.627 | 6.62 | 6.633 | 6.638 | 6.686 |
| 0.745833333333333 | 6.625 | 6.623 | 6.63 | 6.638 | 6.686 |
| 0.747222222222222 | 6.63 | 6.623 | 6.636 | 6.639 | 6.686 |
| 0.748611111111111 | 6.629 | 6.622 | 6.633 | 6.64 | 6.687 |
| 0.75 | 6.629 | 6.623 | 6.633 | 6.639 | 6.686 |
| 0.751388888888889 | 6.63 | 6.625 | 6.632 | 6.639 | 6.686 |
| 0.752777777777778 | 6.629 | 6.621 | 6.635 | 6.634 | 6.688 |
| 0.754166666666667 | 6.629 | 6.623 | 6.634 | 6.633 | 6.685 |
| 0.755555555555556 | 6.63 | 6.625 | 6.636 | 6.633 | 6.683 |
| 0.756944444444444 | 6.627 | 6.628 | 6.637 | 6.634 | 6.681 |
| 0.758333333333333 | 6.621 | 6.626 | 6.628 | 6.633 | 6.683 |
| 0.759722222222222 | 6.625 | 6.626 | 6.63 | 6.633 | 6.682 |
| 0.761111111111111 | 6.622 | 6.626 | 6.63 | 6.636 | 6.681 |
| 0.7625 | 6.624 | 6.624 | 6.63 | 6.632 | 6.685 |
| 0.763888888888889 | 6.625 | 6.624 | 6.632 | 6.636 | 6.682 |
| 0.765277777777778 | 6.625 | 6.616 | 6.633 | 6.635 | 6.683 |
| 0.766666666666667 | 6.628 | 6.622 | 6.632 | 6.636 | 6.685 |
| 0.768055555555556 | 6.624 | 6.615 | 6.632 | 6.635 | 6.687 |
| 0.769444444444445 | 6.626 | 6.616 | 6.632 | 6.636 | 6.685 |
| 0.770833333333333 | 6.629 | 6.619 | 6.632 | 6.638 | 6.687 |
| 0.772222222222222 | 6.629 | 6.62 | 6.634 | 6.638 | 6.688 |
| 0.773611111111111 | 6.628 | 6.621 | 6.634 | 6.638 | 6.686 |
| 0.775 | 6.63 | 6.619 | 6.635 | 6.636 | 6.688 |
| 0.776388888888889 | 6.629 | 6.62 | 6.635 | 6.635 | 6.687 |
| 0.777777777777778 | 6.628 | 6.62 | 6.638 | 6.635 | 6.686 |
| 0.779166666666667 | 6.63 | 6.619 | 6.638 | 6.64 | 6.689 |
| 0.780555555555556 | 6.628 | 6.621 | 6.636 | 6.639 | 6.687 |
| 0.781944444444444 | 6.629 | 6.62 | 6.633 | 6.637 | 6.682 |
| 0.783333333333333 | 6.626 | 6.623 | 6.633 | 6.635 | 6.68 |
| 0.784722222222222 | 6.625 | 6.624 | 6.628 | 6.633 | 6.681 |
| 0.786111111111111 | 6.623 | 6.623 | 6.626 | 6.631 | 6.678 |
| 0.7875 | 6.623 | 6.621 | 6.63 | 6.635 | 6.684 |
| 0.788888888888889 | 6.625 | 6.623 | 6.629 | 6.634 | 6.681 |
| 0.790277777777778 | 6.623 | 6.615 | 6.63 | 6.638 | 6.684 |
| 0.791666666666667 | 6.628 | 6.617 | 6.629 | 6.635 | 6.686 |
| 0.793055555555556 | 6.629 | 6.617 | 6.627 | 6.634 | 6.684 |
| 0.794444444444444 | 6.625 | 6.618 | 6.631 | 6.635 | 6.685 |
| 0.795833333333333 | 6.628 | 6.617 | 6.628 | 6.637 | 6.685 |
| 0.797222222222222 | 6.626 | 6.619 | 6.632 | 6.636 | 6.685 |
| 0.798611111111111 | 6.631 | 6.62 | 6.632 | 6.637 | 6.686 |
| 0.8 | 6.627 | 6.617 | 6.63 | 6.635 | 6.684 |
| 0.801388888888889 | 6.628 | 6.623 | 6.63 | 6.639 | 6.686 |
| 0.802777777777778 | 6.631 | 6.621 | 6.631 | 6.637 | 6.69 |
| 0.804166666666667 | 6.63 | 6.618 | 6.635 | 6.639 | 6.688 |
| 0.805555555555556 | 6.628 | 6.624 | 6.632 | 6.639 | 6.688 |
| 0.806944444444445 | 6.625 | 6.623 | 6.634 | 6.642 | 6.689 |
| 0.808333333333333 | 6.627 | 6.626 | 6.634 | 6.64 | 6.688 |
| 0.809722222222222 | 6.623 | 6.623 | 6.627 | 6.641 | 6.689 |
| 0.811111111111111 | 6.627 | 6.627 | 6.627 | 6.64 | 6.687 |
| 0.8125 | 6.625 | 6.621 | 6.628 | 6.633 | 6.683 |
| 0.813888888888889 | 6.628 | 6.616 | 6.626 | 6.635 | 6.684 |
| 0.815277777777778 | 6.627 | 6.62 | 6.629 | 6.636 | 6.683 |
| 0.816666666666667 | 6.629 | 6.618 | 6.629 | 6.634 | 6.683 |
| 0.818055555555556 | 6.627 | 6.62 | 6.629 | 6.636 | 6.686 |
| 0.819444444444444 | 6.628 | 6.622 | 6.632 | 6.635 | 6.686 |
| 0.820833333333333 | 6.629 | 6.62 | 6.63 | 6.636 | 6.684 |
| 0.822222222222222 | 6.63 | 6.62 | 6.63 | 6.637 | 6.685 |
| 0.823611111111111 | 6.633 | 6.618 | 6.632 | 6.637 | 6.688 |
| 0.825 | 6.63 | 6.62 | 6.632 | 6.638 | 6.688 |
| 0.826388888888889 | 6.631 | 6.619 | 6.633 | 6.639 | 6.685 |
| 0.827777777777778 | 6.633 | 6.623 | 6.633 | 6.638 | 6.688 |
| 0.829166666666667 | 6.631 | 6.622 | 6.638 | 6.639 | 6.69 |
| 0.830555555555556 | 6.621 | 6.624 | 6.636 | 6.637 | 6.691 |
| 0.831944444444445 | 6.622 | 6.624 | 6.635 | 6.639 | 6.687 |
| 0.833333333333333 | 6.623 | 6.626 | 6.629 | 6.641 | 6.69 |
| 0.834722222222222 | 6.624 | 6.626 | 6.63 | 6.642 | 6.682 |
| 0.836111111111111 | 6.623 | 6.624 | 6.627 | 6.64 | 6.681 |
| 0.8375 | 6.624 | 6.623 | 6.629 | 6.635 | 6.678 |
| 0.838888888888889 | 6.622 | 6.619 | 6.629 | 6.634 | 6.68 |
| 0.840277777777778 | 6.623 | 6.62 | 6.63 | 6.632 | 6.681 |
| 0.841666666666667 | 6.624 | 6.619 | 6.632 | 6.631 | 6.684 |
| 0.843055555555556 | 6.624 | 6.622 | 6.633 | 6.634 | 6.683 |
| 0.844444444444444 | 6.624 | 6.619 | 6.632 | 6.632 | 6.681 |
| 0.845833333333333 | 6.624 | 6.623 | 6.633 | 6.635 | 6.68 |
| 0.847222222222222 | 6.626 | 6.62 | 6.632 | 6.636 | 6.685 |
| 0.848611111111111 | 6.629 | 6.623 | 6.635 | 6.637 | 6.682 |
| 0.85 | 6.625 | 6.623 | 6.631 | 6.634 | 6.684 |
| 0.851388888888889 | 6.627 | 6.624 | 6.633 | 6.635 | 6.685 |
| 0.852777777777778 | 6.625 | 6.624 | 6.635 | 6.635 | 6.686 |
| 0.854166666666667 | 6.62 | 6.628 | 6.634 | 6.637 | 6.685 |
| 0.855555555555556 | 6.62 | 6.623 | 6.635 | 6.639 | 6.684 |
| 0.856944444444444 | 6.622 | 6.628 | 6.628 | 6.638 | 6.688 |
| 0.858333333333333 | 6.621 | 6.628 | 6.63 | 6.638 | 6.686 |
| 0.859722222222222 | 6.623 | 6.629 | 6.63 | 6.636 | 6.689 |
| 0.861111111111111 | 6.624 | 6.625 | 6.63 | 6.638 | 6.68 |
| 0.8625 | 6.623 | 6.622 | 6.633 | 6.637 | 6.68 |
| 0.863888888888889 | 6.623 | 6.621 | 6.632 | 6.635 | 6.68 |
| 0.865277777777778 | 6.625 | 6.62 | 6.631 | 6.629 | 6.681 |
| 0.866666666666667 | 6.623 | 6.621 | 6.634 | 6.633 | 6.682 |
| 0.868055555555556 | 6.626 | 6.623 | 6.632 | 6.632 | 6.684 |
| 0.869444444444445 | 6.627 | 6.624 | 6.632 | 6.634 | 6.683 |
| 0.870833333333333 | 6.626 | 6.623 | 6.632 | 6.634 | 6.684 |
| 0.872222222222222 | 6.627 | 6.625 | 6.634 | 6.634 | 6.685 |
| 0.873611111111111 | 6.628 | 6.626 | 6.632 | 6.64 | 6.686 |
| 0.875 | 6.632 | 6.625 | 6.633 | 6.64 | 6.685 |
| 0.876388888888889 | 6.628 | 6.627 | 6.631 | 6.637 | 6.684 |
| 0.877777777777778 | 6.62 | 6.627 | 6.634 | 6.635 | 6.687 |
| 0.879166666666667 | 6.625 | 6.628 | 6.627 | 6.637 | 6.686 |
| 0.880555555555556 | 6.622 | 6.627 | 6.629 | 6.638 | 6.689 |
| 0.881944444444444 | 6.624 | 6.627 | 6.627 | 6.641 | 6.686 |
| 0.883333333333333 | 6.623 | 6.623 | 6.631 | 6.638 | 6.678 |
| 0.884722222222222 | 6.621 | 6.621 | 6.629 | 6.635 | 6.677 |
| 0.886111111111111 | 6.623 | 6.622 | 6.629 | 6.628 | 6.679 |
| 0.8875 | 6.622 | 6.614 | 6.63 | 6.628 | 6.68 |
| 0.888888888888889 | 6.627 | 6.616 | 6.631 | 6.63 | 6.678 |
| 0.890277777777778 | 6.63 | 6.618 | 6.63 | 6.632 | 6.679 |
| 0.891666666666667 | 6.629 | 6.619 | 6.631 | 6.631 | 6.682 |
| 0.893055555555556 | 6.63 | 6.617 | 6.631 | 6.631 | 6.681 |
| 0.894444444444445 | 6.631 | 6.62 | 6.631 | 6.63 | 6.68 |
| 0.895833333333333 | 6.629 | 6.623 | 6.634 | 6.632 | 6.682 |
| 0.897222222222222 | 6.63 | 6.62 | 6.632 | 6.636 | 6.683 |
| 0.898611111111111 | 6.622 | 6.62 | 6.633 | 6.634 | 6.683 |
| 0.9 | 6.624 | 6.623 | 6.635 | 6.633 | 6.684 |
| 0.901388888888889 | 6.62 | 6.625 | 6.633 | 6.634 | 6.684 |
| 0.902777777777778 | 6.623 | 6.621 | 6.63 | 6.635 | 6.685 |
| 0.904166666666667 | 6.625 | 6.623 | 6.629 | 6.636 | 6.685 |
| 0.905555555555556 | 6.623 | 6.623 | 6.625 | 6.636 | 6.685 |
| 0.906944444444444 | 6.625 | 6.617 | 6.627 | 6.636 | 6.679 |
| 0.908333333333333 | 6.625 | 6.62 | 6.626 | 6.637 | 6.679 |
| 0.909722222222222 | 6.628 | 6.618 | 6.628 | 6.636 | 6.68 |
| 0.911111111111111 | 6.628 | 6.62 | 6.625 | 6.63 | 6.68 |
| 0.9125 | 6.628 | 6.622 | 6.627 | 6.632 | 6.682 |
| 0.913888888888889 | 6.628 | 6.622 | 6.629 | 6.63 | 6.682 |
| 0.915277777777778 | 6.629 | 6.62 | 6.629 | 6.63 | 6.682 |
| 0.916666666666667 | 6.63 | 6.618 | 6.629 | 6.633 | 6.681 |
| 0.918055555555556 | 6.629 | 6.62 | 6.628 | 6.631 | 6.681 |
| 0.919444444444444 | 6.632 | 6.626 | 6.63 | 6.631 | 6.682 |
| 0.920833333333333 | 6.635 | 6.621 | 6.631 | 6.634 | 6.683 |
| 0.922222222222222 | 6.629 | 6.623 | 6.631 | 6.636 | 6.686 |
| 0.923611111111111 | 6.621 | 6.624 | 6.632 | 6.635 | 6.685 |
| 0.925 | 6.621 | 6.624 | 6.628 | 6.635 | 6.685 |
| 0.926388888888889 | 6.622 | 6.626 | 6.63 | 6.638 | 6.687 |
| 0.927777777777778 | 6.618 | 6.624 | 6.627 | 6.637 | 6.682 |
| 0.929166666666667 | 6.621 | 6.624 | 6.627 | 6.636 | 6.681 |
| 0.930555555555556 | 6.622 | 6.621 | 6.627 | 6.633 | 6.679 |
| 0.931944444444445 | 6.622 | 6.621 | 6.627 | 6.631 | 6.679 |
| 0.933333333333333 | 6.624 | 6.619 | 6.628 | 6.63 | 6.681 |
| 0.934722222222222 | 6.624 | 6.619 | 6.631 | 6.63 | 6.684 |
| 0.936111111111111 | 6.624 | 6.619 | 6.628 | 6.632 | 6.679 |
| 0.9375 | 6.627 | 6.621 | 6.628 | 6.632 | 6.684 |
| 0.938888888888889 | 6.626 | 6.624 | 6.632 | 6.63 | 6.682 |
| 0.940277777777778 | 6.628 | 6.619 | 6.631 | 6.634 | 6.684 |
| 0.941666666666667 | 6.627 | 6.623 | 6.631 | 6.633 | 6.683 |
| 0.943055555555556 | 6.629 | 6.623 | 6.629 | 6.633 | 6.685 |
| 0.944444444444444 | 6.624 | 6.624 | 6.631 | 6.635 | 6.685 |
| 0.945833333333333 | 6.621 | 6.624 | 6.634 | 6.636 | 6.686 |
| 0.947222222222222 | 6.622 | 6.624 | 6.633 | 6.636 | 6.686 |
| 0.948611111111111 | 6.62 | 6.626 | 6.633 | 6.639 | 6.687 |
| 0.95 | 6.621 | 6.628 | 6.627 | 6.637 | 6.69 |
| 0.951388888888889 | 6.623 | 6.623 | 6.626 | 6.641 | 6.685 |
| 0.952777777777778 | 6.625 | 6.62 | 6.628 | 6.639 | 6.683 |
| 0.954166666666667 | 6.624 | 6.617 | 6.627 | 6.635 | 6.684 |
| 0.955555555555556 | 6.622 | 6.621 | 6.627 | 6.632 | 6.68 |
| 0.956944444444445 | 6.625 | 6.622 | 6.629 | 6.631 | 6.683 |
| 0.958333333333333 | 6.626 | 6.621 | 6.629 | 6.631 | 6.682 |
| 0.959722222222222 | 6.628 | 6.624 | 6.629 | 6.635 | 6.683 |
| 0.961111111111111 | 6.624 | 6.62 | 6.629 | 6.631 | 6.68 |
| 0.9625 | 6.628 | 6.622 | 6.629 | 6.635 | 6.684 |
| 0.963888888888889 | 6.63 | 6.621 | 6.63 | 6.637 | 6.684 |
| 0.965277777777778 | 6.626 | 6.623 | 6.629 | 6.636 | 6.687 |
| 0.966666666666667 | 6.63 | 6.623 | 6.631 | 6.634 | 6.69 |
| 0.968055555555556 | 6.627 | 6.623 | 6.632 | 6.638 | 6.688 |
| 0.969444444444444 | 6.621 | 6.626 | 6.632 | 6.637 | 6.687 |
| 0.970833333333333 | 6.623 | 6.623 | 6.631 | 6.638 | 6.687 |
| 0.972222222222222 | 6.621 | 6.625 | 6.625 | 6.639 | 6.686 |
| 0.973611111111111 | 6.622 | 6.624 | 6.626 | 6.639 | 6.683 |
| 0.975 | 6.622 | 6.623 | 6.626 | 6.637 | 6.678 |
| 0.976388888888889 | 6.624 | 6.624 | 6.628 | 6.637 | 6.681 |
| 0.977777777777778 | 6.625 | 6.613 | 6.626 | 6.629 | 6.681 |
| 0.979166666666667 | 6.626 | 6.616 | 6.628 | 6.632 | 6.679 |
| 0.980555555555556 | 6.626 | 6.616 | 6.63 | 6.632 | 6.682 |
| 0.981944444444444 | 6.627 | 6.616 | 6.629 | 6.631 | 6.682 |
| 0.983333333333333 | 6.627 | 6.616 | 6.626 | 6.635 | 6.685 |
| 0.984722222222222 | 6.626 | 6.619 | 6.629 | 6.636 | 6.684 |
| 0.986111111111111 | 6.626 | 6.616 | 6.63 | 6.636 | 6.685 |
| 0.9875 | 6.625 | 6.618 | 6.632 | 6.636 | 6.686 |
| 0.988888888888889 | 6.631 | 6.618 | 6.631 | 6.637 | 6.684 |
| 0.990277777777778 | 6.629 | 6.619 | 6.63 | 6.637 | 6.689 |
| 0.991666666666667 | 6.623 | 6.62 | 6.632 | 6.637 | 6.687 |
| 0.993055555555556 | 6.626 | 6.622 | 6.632 | 6.641 | 6.69 |
| 0.994444444444445 | 6.623 | 6.622 | 6.631 | 6.638 | 6.689 |
| 0.995833333333333 | 6.622 | 6.623 | 6.628 | 6.642 | 6.689 |
| 0.997222222222222 | 6.622 | 6.625 | 6.623 | 6.641 | 6.689 |
| 0.998611111111111 | 6.625 | 6.624 | 6.623 | 6.641 | 6.68 |
| 1.0 | 6.623 | 6.616 | 6.622 | 6.639 | 6.678 |
| 1.00138888888889 | 6.622 | 6.618 | 6.624 | 6.627 | 6.679 |
| 1.00277777777778 | 6.623 | 6.616 | 6.623 | 6.627 | 6.682 |
| 1.00416666666667 | 6.625 | 6.62 | 6.625 | 6.629 | 6.681 |
| 1.00555555555556 | 6.623 | 6.62 | 6.624 | 6.632 | 6.68 |
| 1.00694444444444 | 6.626 | 6.618 | 6.625 | 6.63 | 6.681 |
| 1.00833333333333 | 6.628 | 6.621 | 6.626 | 6.632 | 6.682 |
| 1.00972222222222 | 6.628 | 6.622 | 6.629 | 6.632 | 6.681 |
| 1.01111111111111 | 6.628 | 6.621 | 6.628 | 6.636 | 6.683 |
| 1.0125 | 6.628 | 6.62 | 6.626 | 6.635 | 6.684 |
| 1.01388888888889 | 6.631 | 6.623 | 6.626 | 6.638 | 6.683 |
| 1.01527777777778 | 6.63 | 6.622 | 6.627 | 6.638 | 6.683 |
| 1.01666666666667 | 6.626 | 6.621 | 6.627 | 6.637 | 6.689 |
| 1.01805555555556 | 6.62 | 6.621 | 6.625 | 6.637 | 6.683 |
| 1.01944444444444 | 6.623 | 6.625 | 6.625 | 6.638 | 6.684 |
| 1.02083333333333 | 6.624 | 6.625 | 6.619 | 6.64 | 6.68 |
| 1.02222222222222 | 6.628 | 6.625 | 6.624 | 6.632 | 6.681 |
| 1.02361111111111 | 6.624 | 6.62 | 6.624 | 6.633 | 6.676 |
| 1.025 | 6.625 | 6.616 | 6.623 | 6.632 | 6.68 |
| 1.02638888888889 | 6.627 | 6.618 | 6.624 | 6.632 | 6.678 |
| 1.02777777777778 | 6.626 | 6.618 | 6.625 | 6.632 | 6.677 |
| 1.02916666666667 | 6.627 | 6.62 | 6.627 | 6.634 | 6.68 |
| 1.03055555555556 | 6.626 | 6.618 | 6.626 | 6.633 | 6.679 |
| 1.03194444444444 | 6.627 | 6.62 | 6.623 | 6.634 | 6.682 |
| 1.03333333333333 | 6.628 | 6.621 | 6.628 | 6.634 | 6.683 |
| 1.03472222222222 | 6.629 | 6.62 | 6.628 | 6.636 | 6.684 |
| 1.03611111111111 | 6.628 | 6.619 | 6.626 | 6.637 | 6.684 |
| 1.0375 | 6.625 | 6.622 | 6.628 | 6.636 | 6.684 |
| 1.03888888888889 | 6.631 | 6.625 | 6.628 | 6.636 | 6.684 |
| 1.04027777777778 | 6.629 | 6.622 | 6.626 | 6.639 | 6.688 |
| 1.04166666666667 | 6.621 | 6.62 | 6.624 | 6.64 | 6.688 |
| 1.04305555555556 | 6.62 | 6.624 | 6.627 | 6.64 | 6.684 |
| 1.04444444444444 | 6.622 | 6.622 | 6.625 | 6.64 | 6.68 |
| 1.04583333333333 | 6.621 | 6.622 | 6.622 | 6.639 | 6.68 |
| 1.04722222222222 | 6.621 | 6.619 | 6.622 | 6.632 | 6.681 |
| 1.04861111111111 | 6.618 | 6.616 | 6.623 | 6.631 | 6.683 |
| 1.05 | 6.619 | 6.618 | 6.622 | 6.635 | 6.682 |
| 1.05138888888889 | 6.621 | 6.62 | 6.621 | 6.637 | 6.683 |
| 1.05277777777778 | 6.623 | 6.617 | 6.625 | 6.633 | 6.684 |
| 1.05416666666667 | 6.624 | 6.617 | 6.622 | 6.635 | 6.683 |
| 1.05555555555556 | 6.625 | 6.617 | 6.626 | 6.637 | 6.685 |
| 1.05694444444444 | 6.626 | 6.617 | 6.625 | 6.639 | 6.683 |
| 1.05833333333333 | 6.626 | 6.62 | 6.626 | 6.636 | 6.683 |
| 1.05972222222222 | 6.624 | 6.62 | 6.627 | 6.637 | 6.685 |
| 1.06111111111111 | 6.623 | 6.621 | 6.627 | 6.639 | 6.686 |
| 1.0625 | 6.627 | 6.62 | 6.626 | 6.638 | 6.685 |
| 1.06388888888889 | 6.626 | 6.623 | 6.628 | 6.641 | 6.686 |
| 1.06527777777778 | 6.628 | 6.622 | 6.627 | 6.64 | 6.685 |
| 1.06666666666667 | 6.627 | 6.623 | 6.627 | 6.643 | 6.682 |
| 1.06805555555556 | 6.624 | 6.623 | 6.624 | 6.64 | 6.683 |
| 1.06944444444444 | 6.623 | 6.626 | 6.623 | 6.637 | 6.68 |
| 1.07083333333333 | 6.622 | 6.623 | 6.624 | 6.634 | 6.68 |
| 1.07222222222222 | 6.621 | 6.62 | 6.624 | 6.634 | 6.68 |
| 1.07361111111111 | 6.627 | 6.618 | 6.622 | 6.633 | 6.681 |
| 1.075 | 6.624 | 6.618 | 6.622 | 6.634 | 6.68 |
| 1.07638888888889 | 6.627 | 6.62 | 6.622 | 6.636 | 6.681 |
| 1.07777777777778 | 6.628 | 6.619 | 6.62 | 6.635 | 6.683 |
| 1.07916666666667 | 6.628 | 6.619 | 6.623 | 6.636 | 6.685 |
| 1.08055555555556 | 6.627 | 6.62 | 6.624 | 6.635 | 6.683 |
| 1.08194444444444 | 6.628 | 6.623 | 6.626 | 6.637 | 6.686 |
| 1.08333333333333 | 6.625 | 6.62 | 6.626 | 6.638 | 6.683 |
| 1.08472222222222 | 6.628 | 6.622 | 6.625 | 6.636 | 6.683 |
| 1.08611111111111 | 6.628 | 6.622 | 6.627 | 6.639 | 6.685 |
| 1.0875 | 6.632 | 6.624 | 6.629 | 6.64 | 6.684 |
| 1.08888888888889 | 6.628 | 6.624 | 6.628 | 6.642 | 6.686 |
| 1.09027777777778 | 6.627 | 6.625 | 6.629 | 6.642 | 6.688 |
| 1.09166666666667 | 6.619 | 6.623 | 6.631 | 6.643 | 6.675 |
| 1.09305555555556 | 6.62 | 6.625 | 6.626 | 6.635 | 6.679 |
| 1.09444444444444 | 6.617 | 6.623 | 6.628 | 6.63 | 6.675 |
| 1.09583333333333 | 6.62 | 6.625 | 6.624 | 6.63 | 6.678 |
| 1.09722222222222 | 6.62 | 6.62 | 6.623 | 6.631 | 6.676 |
| 1.09861111111111 | 6.624 | 6.618 | 6.623 | 6.633 | 6.676 |
| 1.1 | 6.619 | 6.616 | 6.623 | 6.634 | 6.676 |
| 1.10138888888889 | 6.624 | 6.614 | 6.628 | 6.633 | 6.676 |
| 1.10277777777778 | 6.623 | 6.615 | 6.625 | 6.634 | 6.678 |
| 1.10416666666667 | 6.626 | 6.616 | 6.625 | 6.636 | 6.677 |
| 1.10555555555556 | 6.622 | 6.619 | 6.62 | 6.636 | 6.681 |
| 1.10694444444444 | 6.624 | 6.618 | 6.622 | 6.636 | 6.678 |
| 1.10833333333333 | 6.624 | 6.617 | 6.622 | 6.635 | 6.681 |
| 1.10972222222222 | 6.626 | 6.614 | 6.627 | 6.639 | 6.681 |
| 1.11111111111111 | 6.627 | 6.616 | 6.627 | 6.639 | 6.679 |
| 1.1125 | 6.627 | 6.616 | 6.628 | 6.636 | 6.682 |
| 1.11388888888889 | 6.624 | 6.621 | 6.628 | 6.636 | 6.68 |
| 1.11527777777778 | 6.627 | 6.62 | 6.627 | 6.637 | 6.681 |
| 1.11666666666667 | 6.629 | 6.619 | 6.627 | 6.639 | 6.682 |
| 1.11805555555556 | 6.621 | 6.619 | 6.626 | 6.636 | 6.676 |
| 1.11944444444444 | 6.622 | 6.62 | 6.624 | 6.634 | 6.676 |
| 1.12083333333333 | 6.622 | 6.624 | 6.619 | 6.632 | 6.675 |
| 1.12222222222222 | 6.62 | 6.622 | 6.617 | 6.632 | 6.675 |
| 1.12361111111111 | 6.621 | 6.623 | 6.616 | 6.635 | 6.675 |
| 1.125 | 6.625 | 6.62 | 6.62 | 6.634 | 6.674 |
| 1.12638888888889 | 6.622 | 6.618 | 6.615 | 6.632 | 6.674 |
| 1.12777777777778 | 6.624 | 6.621 | 6.616 | 6.637 | 6.675 |
| 1.12916666666667 | 6.623 | 6.619 | 6.619 | 6.636 | 6.676 |
| 1.13055555555556 | 6.622 | 6.62 | 6.618 | 6.637 | 6.677 |
| 1.13194444444444 | 6.623 | 6.622 | 6.621 | 6.636 | 6.677 |
| 1.13333333333333 | 6.621 | 6.621 | 6.62 | 6.635 | 6.676 |
| 1.13472222222222 | 6.623 | 6.622 | 6.621 | 6.635 | 6.678 |
| 1.13611111111111 | 6.626 | 6.621 | 6.622 | 6.636 | 6.679 |
| 1.1375 | 6.627 | 6.623 | 6.626 | 6.639 | 6.679 |
| 1.13888888888889 | 6.626 | 6.624 | 6.624 | 6.639 | 6.679 |
| 1.14027777777778 | 6.624 | 6.625 | 6.625 | 6.636 | 6.678 |
| 1.14166666666667 | 6.626 | 6.625 | 6.625 | 6.642 | 6.681 |
| 1.14305555555556 | 6.626 | 6.625 | 6.626 | 6.64 | 6.678 |
| 1.14444444444444 | 6.616 | 6.626 | 6.621 | 6.637 | 6.679 |
| 1.14583333333333 | 6.619 | 6.626 | 6.623 | 6.637 | 6.673 |
| 1.14722222222222 | 6.617 | 6.624 | 6.622 | 6.637 | 6.679 |
| 1.14861111111111 | 6.62 | 6.627 | 6.623 | 6.635 | 6.677 |
| 1.15 | 6.621 | 6.618 | 6.621 | 6.634 | 6.676 |
| 1.15138888888889 | 6.619 | 6.618 | 6.623 | 6.633 | 6.678 |
| 1.15277777777778 | 6.618 | 6.617 | 6.624 | 6.637 | 6.675 |
| 1.15416666666667 | 6.619 | 6.617 | 6.621 | 6.635 | 6.677 |
| 1.15555555555556 | 6.622 | 6.619 | 6.624 | 6.636 | 6.676 |
| 1.15694444444444 | 6.62 | 6.614 | 6.626 | 6.636 | 6.678 |
| 1.15833333333333 | 6.621 | 6.618 | 6.624 | 6.635 | 6.677 |
| 1.15972222222222 | 6.624 | 6.618 | 6.625 | 6.638 | 6.679 |
| 1.16111111111111 | 6.623 | 6.62 | 6.624 | 6.638 | 6.679 |
| 1.1625 | 6.625 | 6.621 | 6.627 | 6.638 | 6.681 |
| 1.16388888888889 | 6.621 | 6.62 | 6.625 | 6.639 | 6.678 |
| 1.16527777777778 | 6.621 | 6.621 | 6.627 | 6.638 | 6.68 |
| 1.16666666666667 | 6.626 | 6.618 | 6.63 | 6.638 | 6.681 |
| 1.16805555555556 | 6.626 | 6.623 | 6.627 | 6.64 | 6.677 |
| 1.16944444444444 | 6.623 | 6.62 | 6.628 | 6.638 | 6.675 |
| 1.17083333333333 | 6.624 | 6.622 | 6.622 | 6.637 | 6.672 |
| 1.17222222222222 | 6.62 | 6.621 | 6.621 | 6.632 | 6.674 |
| 1.17361111111111 | 6.623 | 6.623 | 6.62 | 6.633 | 6.672 |
| 1.175 | 6.624 | 6.617 | 6.616 | 6.631 | 6.676 |
| 1.17638888888889 | 6.623 | 6.619 | 6.62 | 6.634 | 6.676 |
| 1.17777777777778 | 6.62 | 6.616 | 6.619 | 6.637 | 6.672 |
| 1.17916666666667 | 6.625 | 6.617 | 6.619 | 6.637 | 6.675 |
| 1.18055555555556 | 6.625 | 6.62 | 6.62 | 6.636 | 6.679 |
| 1.18194444444444 | 6.623 | 6.617 | 6.621 | 6.637 | 6.678 |
| 1.18333333333333 | 6.624 | 6.615 | 6.621 | 6.636 | 6.678 |
| 1.18472222222222 | 6.626 | 6.621 | 6.621 | 6.638 | 6.677 |
| 1.18611111111111 | 6.624 | 6.618 | 6.623 | 6.639 | 6.677 |
| 1.1875 | 6.627 | 6.619 | 6.621 | 6.639 | 6.678 |
| 1.18888888888889 | 6.628 | 6.621 | 6.626 | 6.641 | 6.679 |
| 1.19027777777778 | 6.626 | 6.621 | 6.62 | 6.639 | 6.678 |
| 1.19166666666667 | 6.629 | 6.624 | 6.627 | 6.64 | 6.68 |
| 1.19305555555556 | 6.63 | 6.625 | 6.624 | 6.638 | 6.679 |
| 1.19444444444444 | 6.634 | 6.622 | 6.625 | 6.639 | 6.678 |
| 1.19583333333333 | 6.627 | 6.624 | 6.624 | 6.639 | 6.675 |
| 1.19722222222222 | 6.621 | 6.623 | 6.625 | 6.635 | 6.674 |
| 1.19861111111111 | 6.618 | 6.621 | 6.623 | 6.635 | 6.676 |
| 1.2 | 6.618 | 6.62 | 6.62 | 6.633 | 6.675 |
| 1.20138888888889 | 6.619 | 6.615 | 6.616 | 6.634 | 6.675 |
| 1.20277777777778 | 6.62 | 6.611 | 6.619 | 6.637 | 6.673 |
| 1.20416666666667 | 6.62 | 6.614 | 6.619 | 6.635 | 6.675 |
| 1.20555555555556 | 6.619 | 6.614 | 6.615 | 6.637 | 6.678 |
| 1.20694444444444 | 6.62 | 6.617 | 6.618 | 6.636 | 6.677 |
| 1.20833333333333 | 6.622 | 6.614 | 6.619 | 6.638 | 6.677 |
| 1.20972222222222 | 6.62 | 6.614 | 6.619 | 6.639 | 6.676 |
| 1.21111111111111 | 6.62 | 6.614 | 6.625 | 6.638 | 6.678 |
| 1.2125 | 6.624 | 6.616 | 6.622 | 6.64 | 6.678 |
| 1.21388888888889 | 6.622 | 6.613 | 6.623 | 6.639 | 6.678 |
| 1.21527777777778 | 6.625 | 6.617 | 6.621 | 6.64 | 6.679 |
| 1.21666666666667 | 6.622 | 6.615 | 6.623 | 6.639 | 6.681 |
| 1.21805555555556 | 6.623 | 6.617 | 6.624 | 6.639 | 6.677 |
| 1.21944444444444 | 6.621 | 6.618 | 6.626 | 6.639 | 6.674 |
| 1.22083333333333 | 6.622 | 6.618 | 6.624 | 6.633 | 6.671 |
| 1.22222222222222 | 6.622 | 6.618 | 6.625 | 6.633 | 6.668 |
| 1.22361111111111 | 6.626 | 6.615 | 6.623 | 6.632 | 6.668 |
| 1.225 | 6.624 | 6.619 | 6.623 | 6.632 | 6.669 |
| 1.22638888888889 | 6.623 | 6.617 | 6.614 | 6.632 | 6.668 |
| 1.22777777777778 | 6.621 | 6.616 | 6.614 | 6.63 | 6.669 |
| 1.22916666666667 | 6.618 | 6.614 | 6.613 | 6.634 | 6.671 |
| 1.23055555555556 | 6.619 | 6.616 | 6.614 | 6.634 | 6.668 |
| 1.23194444444444 | 6.621 | 6.619 | 6.615 | 6.634 | 6.671 |
| 1.23333333333333 | 6.62 | 6.616 | 6.617 | 6.636 | 6.67 |
| 1.23472222222222 | 6.618 | 6.618 | 6.615 | 6.634 | 6.672 |
| 1.23611111111111 | 6.618 | 6.618 | 6.615 | 6.635 | 6.67 |
| 1.2375 | 6.619 | 6.619 | 6.615 | 6.634 | 6.674 |
| 1.23888888888889 | 6.62 | 6.62 | 6.617 | 6.635 | 6.672 |
| 1.24027777777778 | 6.62 | 6.619 | 6.614 | 6.636 | 6.675 |
| 1.24166666666667 | 6.618 | 6.621 | 6.618 | 6.638 | 6.673 |
| 1.24305555555556 | 6.62 | 6.62 | 6.617 | 6.64 | 6.675 |
| 1.24444444444444 | 6.622 | 6.622 | 6.619 | 6.639 | 6.675 |
| 1.24583333333333 | 6.622 | 6.62 | 6.618 | 6.638 | 6.676 |
| 1.24722222222222 | 6.624 | 6.62 | 6.621 | 6.638 | 6.678 |
| 1.24861111111111 | 6.623 | 6.623 | 6.618 | 6.638 | 6.673 |
| 1.25 | 6.621 | 6.622 | 6.618 | 6.636 | 6.674 |
| 1.25138888888889 | 6.621 | 6.624 | 6.621 | 6.638 | 6.672 |
| 1.25277777777778 | 6.623 | 6.624 | 6.622 | 6.64 | 6.673 |
| 1.25416666666667 | 6.623 | 6.625 | 6.623 | 6.637 | 6.673 |
| 1.25555555555556 | 6.625 | 6.624 | 6.623 | 6.637 | 6.676 |
| 1.25694444444444 | 6.623 | 6.625 | 6.618 | 6.642 | 6.672 |
| 1.25833333333333 | 6.624 | 6.615 | 6.619 | 6.639 | 6.673 |
| 1.25972222222222 | 6.624 | 6.618 | 6.617 | 6.64 | 6.674 |
| 1.26111111111111 | 6.623 | 6.614 | 6.621 | 6.639 | 6.675 |
| 1.2625 | 6.62 | 6.614 | 6.619 | 6.64 | 6.676 |
| 1.26388888888889 | 6.621 | 6.613 | 6.621 | 6.638 | 6.674 |
| 1.26527777777778 | 6.619 | 6.616 | 6.619 | 6.641 | 6.675 |
| 1.26666666666667 | 6.618 | 6.617 | 6.617 | 6.64 | 6.677 |
| 1.26805555555556 | 6.621 | 6.618 | 6.621 | 6.641 | 6.678 |
| 1.26944444444444 | 6.618 | 6.618 | 6.62 | 6.643 | 6.677 |
| 1.27083333333333 | 6.62 | 6.617 | 6.623 | 6.642 | 6.676 |
| 1.27222222222222 | 6.617 | 6.614 | 6.621 | 6.642 | 6.679 |
| 1.27361111111111 | 6.62 | 6.617 | 6.619 | 6.642 | 6.675 |
| 1.275 | 6.62 | 6.615 | 6.623 | 6.643 | 6.676 |
| 1.27638888888889 | 6.618 | 6.616 | 6.622 | 6.641 | 6.678 |
| 1.27777777777778 | 6.619 | 6.617 | 6.624 | 6.637 | 6.68 |
| 1.27916666666667 | 6.619 | 6.617 | 6.626 | 6.635 | 6.667 |
| 1.28055555555556 | 6.617 | 6.62 | 6.625 | 6.633 | 6.674 |
| 1.28194444444444 | 6.621 | 6.621 | 6.623 | 6.633 | 6.667 |
| 1.28333333333333 | 6.621 | 6.619 | 6.627 | 6.633 | 6.669 |
| 1.28472222222222 | 6.621 | 6.618 | 6.624 | 6.634 | 6.669 |
| 1.28611111111111 | 6.622 | 6.622 | 6.625 | 6.635 | 6.667 |
| 1.2875 | 6.622 | 6.617 | 6.623 | 6.636 | 6.669 |
| 1.28888888888889 | 6.623 | 6.617 | 6.627 | 6.638 | 6.668 |
| 1.29027777777778 | 6.624 | 6.62 | 6.624 | 6.638 | 6.671 |
| 1.29166666666667 | 6.622 | 6.619 | 6.619 | 6.634 | 6.668 |
| 1.29305555555556 | 6.625 | 6.62 | 6.618 | 6.636 | 6.669 |
| 1.29444444444444 | 6.624 | 6.617 | 6.615 | 6.638 | 6.67 |
| 1.29583333333333 | 6.625 | 6.616 | 6.614 | 6.638 | 6.667 |
| 1.29722222222222 | 6.626 | 6.614 | 6.615 | 6.635 | 6.67 |
| 1.29861111111111 | 6.626 | 6.614 | 6.615 | 6.638 | 6.67 |
| 1.3 | 6.622 | 6.614 | 6.619 | 6.638 | 6.671 |
| 1.30138888888889 | 6.626 | 6.611 | 6.619 | 6.638 | 6.672 |
| 1.30277777777778 | 6.624 | 6.613 | 6.618 | 6.639 | 6.672 |
| 1.30416666666667 | 6.627 | 6.611 | 6.619 | 6.639 | 6.672 |
| 1.30555555555556 | 6.626 | 6.611 | 6.62 | 6.636 | 6.672 |
| 1.30694444444444 | 6.625 | 6.615 | 6.618 | 6.641 | 6.675 |
| 1.30833333333333 | 6.625 | 6.616 | 6.619 | 6.64 | 6.673 |
| 1.30972222222222 | 6.621 | 6.613 | 6.619 | 6.641 | 6.674 |
| 1.31111111111111 | 6.619 | 6.614 | 6.618 | 6.641 | 6.673 |
| 1.3125 | 6.617 | 6.614 | 6.62 | 6.639 | 6.674 |
| 1.31388888888889 | 6.618 | 6.616 | 6.619 | 6.631 | 6.676 |
| 1.31527777777778 | 6.617 | 6.616 | 6.618 | 6.631 | 6.676 |
| 1.31666666666667 | 6.616 | 6.619 | 6.619 | 6.636 | 6.676 |
| 1.31805555555556 | 6.617 | 6.618 | 6.619 | 6.634 | 6.673 |
| 1.31944444444444 | 6.617 | 6.614 | 6.621 | 6.635 | 6.67 |
| 1.32083333333333 | 6.618 | 6.617 | 6.621 | 6.637 | 6.668 |
| 1.32222222222222 | 6.621 | 6.616 | 6.621 | 6.635 | 6.668 |
| 1.32361111111111 | 6.621 | 6.618 | 6.622 | 6.638 | 6.668 |
| 1.325 | 6.62 | 6.617 | 6.62 | 6.637 | 6.67 |
| 1.32638888888889 | 6.622 | 6.619 | 6.621 | 6.636 | 6.671 |
| 1.32777777777778 | 6.621 | 6.621 | 6.62 | 6.635 | 6.67 |
| 1.32916666666667 | 6.619 | 6.623 | 6.621 | 6.635 | 6.67 |
| 1.33055555555556 | 6.62 | 6.619 | 6.622 | 6.639 | 6.669 |
| 1.33194444444444 | 6.621 | 6.62 | 6.624 | 6.637 | 6.67 |
| 1.33333333333333 | 6.625 | 6.622 | 6.623 | 6.638 | 6.668 |
| 1.33472222222222 | 6.625 | 6.621 | 6.623 | 6.638 | 6.668 |
| 1.33611111111111 | 6.622 | 6.618 | 6.619 | 6.639 | 6.67 |
| 1.3375 | 6.623 | 6.616 | 6.617 | 6.64 | 6.671 |
| 1.33888888888889 | 6.625 | 6.615 | 6.615 | 6.638 | 6.669 |
| 1.34027777777778 | 6.624 | 6.614 | 6.62 | 6.638 | 6.672 |
| 1.34166666666667 | 6.625 | 6.61 | 6.618 | 6.64 | 6.668 |
| 1.34305555555556 | 6.626 | 6.615 | 6.617 | 6.638 | 6.672 |
| 1.34444444444444 | 6.624 | 6.614 | 6.617 | 6.642 | 6.673 |
| 1.34583333333333 | 6.624 | 6.617 | 6.617 | 6.64 | 6.676 |
| 1.34722222222222 | 6.624 | 6.616 | 6.617 | 6.641 | 6.674 |
| 1.34861111111111 | 6.624 | 6.614 | 6.616 | 6.641 | 6.672 |
| 1.35 | 6.622 | 6.614 | 6.619 | 6.637 | 6.672 |
| 1.35138888888889 | 6.625 | 6.616 | 6.621 | 6.639 | 6.672 |
| 1.35277777777778 | 6.621 | 6.615 | 6.62 | 6.632 | 6.675 |
| 1.35416666666667 | 6.616 | 6.616 | 6.62 | 6.63 | 6.674 |
| 1.35555555555556 | 6.617 | 6.615 | 6.62 | 6.631 | 6.674 |
| 1.35694444444444 | 6.617 | 6.617 | 6.621 | 6.631 | 6.675 |
| 1.35833333333333 | 6.618 | 6.617 | 6.619 | 6.633 | 6.672 |
| 1.35972222222222 | 6.619 | 6.617 | 6.622 | 6.632 | 6.678 |
| 1.36111111111111 | 6.617 | 6.617 | 6.621 | 6.631 | 6.669 |
| 1.3625 | 6.619 | 6.615 | 6.621 | 6.632 | 6.663 |
| 1.36388888888889 | 6.62 | 6.615 | 6.621 | 6.631 | 6.668 |
| 1.36527777777778 | 6.619 | 6.619 | 6.621 | 6.631 | 6.661 |
| 1.36666666666667 | 6.622 | 6.619 | 6.62 | 6.629 | 6.663 |
| 1.36805555555556 | 6.621 | 6.617 | 6.621 | 6.632 | 6.661 |
| 1.36944444444444 | 6.62 | 6.621 | 6.619 | 6.634 | 6.665 |
| 1.37083333333333 | 6.62 | 6.618 | 6.624 | 6.633 | 6.663 |
| 1.37222222222222 | 6.621 | 6.621 | 6.625 | 6.631 | 6.666 |
| 1.37361111111111 | 6.621 | 6.62 | 6.624 | 6.633 | 6.667 |
| 1.375 | 6.621 | 6.621 | 6.621 | 6.633 | 6.667 |
| 1.37638888888889 | 6.62 | 6.619 | 6.623 | 6.634 | 6.667 |
| 1.37777777777778 | 6.622 | 6.617 | 6.625 | 6.635 | 6.665 |
| 1.37916666666667 | 6.621 | 6.62 | 6.624 | 6.638 | 6.665 |
| 1.38055555555556 | 6.622 | 6.616 | 6.62 | 6.631 | 6.665 |
| 1.38194444444444 | 6.622 | 6.62 | 6.623 | 6.636 | 6.668 |
| 1.38333333333333 | 6.624 | 6.623 | 6.62 | 6.635 | 6.669 |
| 1.38472222222222 | 6.625 | 6.62 | 6.618 | 6.635 | 6.668 |
| 1.38611111111111 | 6.623 | 6.623 | 6.62 | 6.635 | 6.668 |
| 1.3875 | 6.625 | 6.622 | 6.619 | 6.637 | 6.67 |
| 1.38888888888889 | 6.623 | 6.622 | 6.618 | 6.638 | 6.669 |
| 1.39027777777778 | 6.625 | 6.622 | 6.62 | 6.638 | 6.669 |
| 1.39166666666667 | 6.625 | 6.619 | 6.618 | 6.639 | 6.67 |
| 1.39305555555556 | 6.624 | 6.616 | 6.622 | 6.638 | 6.67 |
| 1.39444444444444 | 6.625 | 6.618 | 6.619 | 6.639 | 6.669 |
| 1.39583333333333 | 6.626 | 6.618 | 6.62 | 6.636 | 6.671 |
| 1.39722222222222 | 6.625 | 6.623 | 6.62 | 6.635 | 6.669 |
| 1.39861111111111 | 6.625 | 6.618 | 6.618 | 6.635 | 6.67 |
| 1.4 | 6.624 | 6.618 | 6.619 | 6.636 | 6.671 |
| 1.40138888888889 | 6.626 | 6.616 | 6.621 | 6.635 | 6.671 |
| 1.40277777777778 | 6.623 | 6.616 | 6.622 | 6.634 | 6.67 |
| 1.40416666666667 | 6.624 | 6.615 | 6.623 | 6.634 | 6.668 |
| 1.40555555555556 | 6.618 | 6.615 | 6.624 | 6.636 | 6.673 |
| 1.40694444444444 | 6.617 | 6.617 | 6.622 | 6.636 | 6.67 |
| 1.40833333333333 | 6.619 | 6.616 | 6.621 | 6.636 | 6.672 |
| 1.40972222222222 | 6.621 | 6.617 | 6.622 | 6.634 | 6.67 |
| 1.41111111111111 | 6.621 | 6.62 | 6.623 | 6.638 | 6.668 |
| 1.4125 | 6.619 | 6.618 | 6.625 | 6.636 | 6.667 |
| 1.41388888888889 | 6.62 | 6.618 | 6.626 | 6.638 | 6.671 |
| 1.41527777777778 | 6.621 | 6.621 | 6.624 | 6.637 | 6.67 |
| 1.41666666666667 | 6.622 | 6.618 | 6.624 | 6.639 | 6.668 |
| 1.41805555555556 | 6.624 | 6.62 | 6.624 | 6.636 | 6.669 |
| 1.41944444444444 | 6.622 | 6.621 | 6.624 | 6.639 | 6.67 |
| 1.42083333333333 | 6.619 | 6.62 | 6.624 | 6.639 | 6.672 |
| 1.42222222222222 | 6.622 | 6.618 | 6.625 | 6.641 | 6.672 |
| 1.42361111111111 | 6.623 | 6.618 | 6.627 | 6.639 | 6.669 |
| 1.425 | 6.621 | 6.619 | 6.626 | 6.64 | 6.672 |
| 1.42638888888889 | 6.621 | 6.618 | 6.626 | 6.642 | 6.67 |
| 1.42777777777778 | 6.623 | 6.618 | 6.628 | 6.639 | 6.674 |
| 1.42916666666667 | 6.623 | 6.619 | 6.629 | 6.641 | 6.673 |
| 1.43055555555556 | 6.622 | 6.619 | 6.63 | 6.64 | 6.672 |
| 1.43194444444444 | 6.623 | 6.616 | 6.63 | 6.645 | 6.677 |
| 1.43333333333333 | 6.623 | 6.62 | 6.627 | 6.64 | 6.672 |
| 1.43472222222222 | 6.622 | 6.62 | 6.628 | 6.644 | 6.676 |
| 1.43611111111111 | 6.623 | 6.616 | 6.629 | 6.643 | 6.674 |
| 1.4375 | 6.625 | 6.614 | 6.628 | 6.64 | 6.675 |
| 1.43888888888889 | 6.623 | 6.615 | 6.629 | 6.638 | 6.675 |
| 1.44027777777778 | 6.625 | 6.616 | 6.625 | 6.635 | 6.675 |
| 1.44166666666667 | 6.623 | 6.614 | 6.626 | 6.628 | 6.678 |
| 1.44305555555556 | 6.623 | 6.612 | 6.619 | 6.632 | 6.678 |
| 1.44444444444444 | 6.627 | 6.612 | 6.625 | 6.63 | 6.678 |
| 1.44583333333333 | 6.625 | 6.614 | 6.621 | 6.632 | 6.677 |
| 1.44722222222222 | 6.623 | 6.613 | 6.62 | 6.632 | 6.672 |
| 1.44861111111111 | 6.623 | 6.614 | 6.62 | 6.631 | 6.673 |
| 1.45 | 6.623 | 6.613 | 6.62 | 6.633 | 6.67 |
| 1.45138888888889 | 6.622 | 6.614 | 6.621 | 6.634 | 6.667 |
| 1.45277777777778 | 6.618 | 6.615 | 6.621 | 6.632 | 6.667 |
| 1.45416666666667 | 6.619 | 6.614 | 6.619 | 6.636 | 6.667 |
| 1.45555555555556 | 6.62 | 6.618 | 6.62 | 6.634 | 6.665 |
| 1.45694444444444 | 6.619 | 6.619 | 6.624 | 6.635 | 6.67 |
| 1.45833333333333 | 6.615 | 6.617 | 6.624 | 6.635 | 6.667 |
| 1.45972222222222 | 6.62 | 6.619 | 6.621 | 6.633 | 6.668 |
| 1.46111111111111 | 6.62 | 6.618 | 6.621 | 6.636 | 6.667 |
| 1.4625 | 6.622 | 6.615 | 6.626 | 6.637 | 6.669 |
| 1.46388888888889 | 6.619 | 6.617 | 6.621 | 6.636 | 6.668 |
| 1.46527777777778 | 6.62 | 6.617 | 6.623 | 6.635 | 6.67 |
| 1.46666666666667 | 6.62 | 6.618 | 6.623 | 6.635 | 6.67 |
| 1.46805555555556 | 6.62 | 6.618 | 6.625 | 6.637 | 6.67 |
| 1.46944444444444 | 6.62 | 6.621 | 6.625 | 6.635 | 6.672 |
| 1.47083333333333 | 6.621 | 6.619 | 6.623 | 6.635 | 6.67 |
| 1.47222222222222 | 6.622 | 6.621 | 6.626 | 6.637 | 6.669 |
| 1.47361111111111 | 6.618 | 6.619 | 6.624 | 6.635 | 6.672 |
| 1.475 | 6.62 | 6.618 | 6.627 | 6.637 | 6.672 |
| 1.47638888888889 | 6.621 | 6.62 | 6.627 | 6.638 | 6.671 |
| 1.47777777777778 | 6.622 | 6.619 | 6.628 | 6.636 | 6.672 |
| 1.47916666666667 | 6.623 | 6.619 | 6.627 | 6.638 | 6.671 |
| 1.48055555555556 | 6.623 | 6.62 | 6.626 | 6.636 | 6.673 |
| 1.48194444444444 | 6.625 | 6.619 | 6.626 | 6.639 | 6.676 |
| 1.48333333333333 | 6.622 | 6.622 | 6.621 | 6.642 | 6.673 |
| 1.48472222222222 | 6.623 | 6.623 | 6.622 | 6.64 | 6.673 |
| 1.48611111111111 | 6.622 | 6.618 | 6.622 | 6.639 | 6.673 |
| 1.4875 | 6.623 | 6.62 | 6.621 | 6.634 | 6.673 |
| 1.48888888888889 | 6.625 | 6.617 | 6.619 | 6.631 | 6.673 |
| 1.49027777777778 | 6.625 | 6.619 | 6.618 | 6.63 | 6.674 |
| 1.49166666666667 | 6.626 | 6.617 | 6.622 | 6.638 | 6.674 |
| 1.49305555555556 | 6.625 | 6.615 | 6.62 | 6.634 | 6.673 |
| 1.49444444444444 | 6.625 | 6.615 | 6.621 | 6.632 | 6.672 |
| 1.49583333333333 | 6.622 | 6.616 | 6.622 | 6.633 | 6.676 |
| 1.49722222222222 | 6.625 | 6.614 | 6.622 | 6.632 | 6.673 |
| 1.49861111111111 | 6.626 | 6.618 | 6.622 | 6.634 | 6.667 |
| 1.5 | 6.624 | 6.616 | 6.622 | 6.633 | 6.667 |
| 1.50138888888889 | 6.625 | 6.614 | 6.622 | 6.635 | 6.67 |
| 1.50277777777778 | 6.622 | 6.614 | 6.623 | 6.635 | 6.667 |
| 1.50416666666667 | 6.619 | 6.617 | 6.625 | 6.634 | 6.666 |
| 1.50555555555556 | 6.617 | 6.617 | 6.622 | 6.634 | 6.671 |
| 1.50694444444444 | 6.617 | 6.617 | 6.623 | 6.634 | 6.669 |
| 1.50833333333333 | 6.615 | 6.619 | 6.622 | 6.635 | 6.672 |
| 1.50972222222222 | 6.616 | 6.617 | 6.625 | 6.636 | 6.672 |
| 1.51111111111111 | 6.617 | 6.615 | 6.622 | 6.634 | 6.673 |
| 1.5125 | 6.616 | 6.617 | 6.625 | 6.636 | 6.674 |
| 1.51388888888889 | 6.616 | 6.615 | 6.625 | 6.638 | 6.674 |
| 1.51527777777778 | 6.617 | 6.619 | 6.622 | 6.635 | 6.673 |
| 1.51666666666667 | 6.615 | 6.62 | 6.629 | 6.635 | 6.673 |
| 1.51805555555556 | 6.617 | 6.62 | 6.627 | 6.637 | 6.672 |
| 1.51944444444444 | 6.616 | 6.617 | 6.626 | 6.636 | 6.672 |
| 1.52083333333333 | 6.618 | 6.619 | 6.628 | 6.636 | 6.673 |
| 1.52222222222222 | 6.619 | 6.619 | 6.626 | 6.639 | 6.675 |
| 1.52361111111111 | 6.62 | 6.62 | 6.622 | 6.638 | 6.674 |
| 1.525 | 6.619 | 6.619 | 6.626 | 6.637 | 6.675 |
| 1.52638888888889 | 6.616 | 6.621 | 6.624 | 6.637 | 6.677 |
| 1.52777777777778 | 6.618 | 6.62 | 6.627 | 6.638 | 6.673 |
| 1.52916666666667 | 6.617 | 6.621 | 6.625 | 6.64 | 6.676 |
| 1.53055555555556 | 6.619 | 6.62 | 6.628 | 6.64 | 6.675 |
| 1.53194444444444 | 6.617 | 6.62 | 6.624 | 6.637 | 6.676 |
| 1.53333333333333 | 6.621 | 6.621 | 6.625 | 6.639 | 6.675 |
| 1.53472222222222 | 6.623 | 6.622 | 6.622 | 6.64 | 6.675 |
| 1.53611111111111 | 6.622 | 6.62 | 6.623 | 6.638 | 6.674 |
| 1.5375 | 6.619 | 6.614 | 6.623 | 6.638 | 6.676 |
| 1.53888888888889 | 6.619 | 6.619 | 6.619 | 6.635 | 6.675 |
| 1.54027777777778 | 6.621 | 6.618 | 6.619 | 6.633 | 6.671 |
| 1.54166666666667 | 6.621 | 6.616 | 6.622 | 6.634 | 6.674 |
| 1.54305555555556 | 6.622 | 6.616 | 6.623 | 6.635 | 6.674 |
| 1.54444444444444 | 6.622 | 6.615 | 6.623 | 6.634 | 6.673 |
| 1.54583333333333 | 6.623 | 6.617 | 6.622 | 6.634 | 6.668 |
| 1.54722222222222 | 6.62 | 6.614 | 6.622 | 6.634 | 6.667 |
| 1.54861111111111 | 6.622 | 6.613 | 6.623 | 6.634 | 6.668 |
| 1.55 | 6.621 | 6.614 | 6.622 | 6.634 | 6.67 |
| 1.55138888888889 | 6.62 | 6.618 | 6.625 | 6.638 | 6.668 |
| 1.55277777777778 | 6.619 | 6.618 | 6.622 | 6.633 | 6.67 |
| 1.55416666666667 | 6.618 | 6.615 | 6.623 | 6.635 | 6.67 |
| 1.55555555555556 | 6.618 | 6.616 | 6.621 | 6.635 | 6.673 |
| 1.55694444444444 | 6.621 | 6.615 | 6.626 | 6.637 | 6.672 |
| 1.55833333333333 | 6.621 | 6.617 | 6.623 | 6.636 | 6.673 |
| 1.55972222222222 | 6.62 | 6.618 | 6.625 | 6.635 | 6.673 |
| 1.56111111111111 | 6.621 | 6.617 | 6.623 | 6.636 | 6.671 |
| 1.5625 | 6.619 | 6.619 | 6.624 | 6.638 | 6.673 |
| 1.56388888888889 | 6.621 | 6.619 | 6.624 | 6.639 | 6.671 |
| 1.56527777777778 | 6.622 | 6.62 | 6.629 | 6.635 | 6.672 |
| 1.56666666666667 | 6.621 | 6.618 | 6.626 | 6.636 | 6.673 |
| 1.56805555555556 | 6.621 | 6.62 | 6.624 | 6.638 | 6.671 |
| 1.56944444444444 | 6.621 | 6.622 | 6.628 | 6.637 | 6.671 |
| 1.57083333333333 | 6.624 | 6.62 | 6.627 | 6.638 | 6.676 |
| 1.57222222222222 | 6.623 | 6.62 | 6.628 | 6.637 | 6.672 |
| 1.57361111111111 | 6.622 | 6.62 | 6.63 | 6.636 | 6.675 |
| 1.575 | 6.624 | 6.62 | 6.628 | 6.635 | 6.675 |
| 1.57638888888889 | 6.622 | 6.623 | 6.627 | 6.639 | 6.674 |
| 1.57777777777778 | 6.625 | 6.622 | 6.629 | 6.639 | 6.673 |
| 1.57916666666667 | 6.623 | 6.625 | 6.629 | 6.64 | 6.672 |
| 1.58055555555556 | 6.624 | 6.622 | 6.625 | 6.64 | 6.676 |
| 1.58194444444444 | 6.623 | 6.623 | 6.623 | 6.638 | 6.673 |
| 1.58333333333333 | 6.623 | 6.62 | 6.623 | 6.639 | 6.675 |
| 1.58472222222222 | 6.626 | 6.619 | 6.624 | 6.641 | 6.673 |
| 1.58611111111111 | 6.626 | 6.623 | 6.621 | 6.641 | 6.674 |
| 1.5875 | 6.625 | 6.614 | 6.621 | 6.641 | 6.676 |
| 1.58888888888889 | 6.624 | 6.61 | 6.624 | 6.64 | 6.674 |
| 1.59027777777778 | 6.626 | 6.612 | 6.623 | 6.642 | 6.679 |
| 1.59166666666667 | 6.626 | 6.612 | 6.62 | 6.64 | 6.677 |
| 1.59305555555556 | 6.626 | 6.612 | 6.623 | 6.636 | 6.675 |
| 1.59444444444444 | 6.625 | 6.612 | 6.624 | 6.641 | 6.678 |
| 1.59583333333333 | 6.626 | 6.61 | 6.623 | 6.64 | 6.678 |
| 1.59722222222222 | 6.622 | 6.611 | 6.627 | 6.638 | 6.678 |
| 1.59861111111111 | 6.619 | 6.612 | 6.626 | 6.635 | 6.676 |
| 1.6 | 6.615 | 6.613 | 6.625 | 6.636 | 6.677 |
| 1.60138888888889 | 6.615 | 6.615 | 6.625 | 6.635 | 6.673 |
| 1.60277777777778 | 6.615 | 6.612 | 6.625 | 6.636 | 6.675 |
| 1.60416666666667 | 6.616 | 6.614 | 6.625 | 6.636 | 6.671 |
| 1.60555555555556 | 6.615 | 6.613 | 6.626 | 6.636 | 6.668 |
| 1.60694444444444 | 6.617 | 6.613 | 6.624 | 6.635 | 6.669 |
| 1.60833333333333 | 6.617 | 6.615 | 6.626 | 6.635 | 6.671 |
| 1.60972222222222 | 6.62 | 6.613 | 6.625 | 6.637 | 6.672 |
| 1.61111111111111 | 6.618 | 6.614 | 6.624 | 6.636 | 6.672 |
| 1.6125 | 6.62 | 6.616 | 6.627 | 6.638 | 6.67 |
| 1.61388888888889 | 6.62 | 6.614 | 6.624 | 6.637 | 6.672 |
| 1.61527777777778 | 6.619 | 6.617 | 6.628 | 6.636 | 6.669 |
| 1.61666666666667 | 6.62 | 6.613 | 6.629 | 6.638 | 6.67 |
| 1.61805555555556 | 6.618 | 6.617 | 6.626 | 6.637 | 6.672 |
| 1.61944444444444 | 6.617 | 6.613 | 6.627 | 6.639 | 6.673 |
| 1.62083333333333 | 6.615 | 6.617 | 6.629 | 6.639 | 6.673 |
| 1.62222222222222 | 6.618 | 6.618 | 6.631 | 6.639 | 6.674 |
| 1.62361111111111 | 6.622 | 6.617 | 6.63 | 6.639 | 6.675 |
| 1.625 | 6.617 | 6.618 | 6.628 | 6.64 | 6.671 |
| 1.62638888888889 | 6.619 | 6.619 | 6.629 | 6.635 | 6.674 |
| 1.62777777777778 | 6.619 | 6.621 | 6.63 | 6.639 | 6.671 |
| 1.62916666666667 | 6.62 | 6.621 | 6.629 | 6.637 | 6.677 |
| 1.63055555555556 | 6.622 | 6.619 | 6.622 | 6.637 | 6.674 |
| 1.63194444444444 | 6.621 | 6.621 | 6.621 | 6.639 | 6.677 |
| 1.63333333333333 | 6.621 | 6.616 | 6.62 | 6.64 | 6.675 |
| 1.63472222222222 | 6.621 | 6.618 | 6.62 | 6.642 | 6.675 |
| 1.63611111111111 | 6.62 | 6.614 | 6.62 | 6.639 | 6.676 |
| 1.6375 | 6.622 | 6.617 | 6.619 | 6.64 | 6.676 |
| 1.63888888888889 | 6.623 | 6.618 | 6.617 | 6.641 | 6.677 |
| 1.64027777777778 | 6.621 | 6.618 | 6.619 | 6.637 | 6.677 |
| 1.64166666666667 | 6.624 | 6.619 | 6.622 | 6.64 | 6.675 |
| 1.64305555555556 | 6.62 | 6.618 | 6.621 | 6.638 | 6.675 |
| 1.64444444444444 | 6.622 | 6.62 | 6.62 | 6.638 | 6.676 |
| 1.64583333333333 | 6.614 | 6.62 | 6.62 | 6.634 | 6.675 |
| 1.64722222222222 | 6.617 | 6.619 | 6.621 | 6.634 | 6.675 |
| 1.64861111111111 | 6.616 | 6.619 | 6.62 | 6.634 | 6.673 |
| 1.65 | 6.616 | 6.62 | 6.62 | 6.633 | 6.669 |
| 1.65138888888889 | 6.616 | 6.618 | 6.618 | 6.633 | 6.672 |
| 1.65277777777778 | 6.616 | 6.618 | 6.621 | 6.635 | 6.672 |
| 1.65416666666667 | 6.619 | 6.617 | 6.622 | 6.634 | 6.675 |
| 1.65555555555556 | 6.62 | 6.619 | 6.624 | 6.634 | 6.674 |
| 1.65694444444444 | 6.619 | 6.623 | 6.622 | 6.636 | 6.672 |
| 1.65833333333333 | 6.621 | 6.618 | 6.622 | 6.635 | 6.674 |
| 1.65972222222222 | 6.621 | 6.619 | 6.623 | 6.639 | 6.674 |
| 1.66111111111111 | 6.618 | 6.619 | 6.625 | 6.636 | 6.673 |
| 1.6625 | 6.619 | 6.617 | 6.622 | 6.637 | 6.672 |
| 1.66388888888889 | 6.621 | 6.62 | 6.623 | 6.638 | 6.672 |
| 1.66527777777778 | 6.619 | 6.62 | 6.623 | 6.638 | 6.674 |
| 1.66666666666667 | 6.62 | 6.621 | 6.624 | 6.636 | 6.673 |
| 1.66805555555556 | 6.622 | 6.623 | 6.623 | 6.638 | 6.673 |
| 1.66944444444444 | 6.62 | 6.624 | 6.624 | 6.638 | 6.672 |
| 1.67083333333333 | 6.624 | 6.621 | 6.625 | 6.638 | 6.676 |
| 1.67222222222222 | 6.624 | 6.624 | 6.623 | 6.637 | 6.673 |
| 1.67361111111111 | 6.62 | 6.624 | 6.626 | 6.64 | 6.677 |
| 1.675 | 6.622 | 6.628 | 6.624 | 6.639 | 6.677 |
| 1.67638888888889 | 6.622 | 6.623 | 6.625 | 6.637 | 6.677 |
| 1.67777777777778 | 6.622 | 6.624 | 6.623 | 6.639 | 6.674 |
| 1.67916666666667 | 6.623 | 6.622 | 6.622 | 6.636 | 6.673 |
| 1.68055555555556 | 6.621 | 6.623 | 6.623 | 6.638 | 6.674 |
| 1.68194444444444 | 6.622 | 6.613 | 6.622 | 6.641 | 6.675 |
| 1.68333333333333 | 6.623 | 6.616 | 6.626 | 6.639 | 6.677 |
| 1.68472222222222 | 6.625 | 6.612 | 6.623 | 6.64 | 6.678 |
| 1.68611111111111 | 6.625 | 6.612 | 6.622 | 6.64 | 6.677 |
| 1.6875 | 6.626 | 6.616 | 6.622 | 6.643 | 6.675 |
| 1.68888888888889 | 6.623 | 6.612 | 6.626 | 6.639 | 6.675 |
| 1.69027777777778 | 6.62 | 6.612 | 6.624 | 6.642 | 6.675 |
| 1.69166666666667 | 6.622 | 6.611 | 6.623 | 6.646 | 6.678 |
| 1.69305555555556 | 6.621 | 6.614 | 6.623 | 6.637 | 6.677 |
| 1.69444444444444 | 6.616 | 6.613 | 6.626 | 6.642 | 6.676 |
| 1.69583333333333 | 6.617 | 6.612 | 6.623 | 6.634 | 6.677 |
| 1.69722222222222 | 6.615 | 6.616 | 6.625 | 6.635 | 6.677 |
| 1.69861111111111 | 6.616 | 6.616 | 6.625 | 6.636 | 6.669 |
| 1.7 | 6.618 | 6.614 | 6.625 | 6.635 | 6.674 |
| 1.70138888888889 | 6.619 | 6.617 | 6.623 | 6.636 | 6.671 |
| 1.70277777777778 | 6.619 | 6.616 | 6.625 | 6.637 | 6.674 |
| 1.70416666666667 | 6.62 | 6.614 | 6.626 | 6.635 | 6.673 |
| 1.70555555555556 | 6.62 | 6.619 | 6.626 | 6.637 | 6.672 |
| 1.70694444444444 | 6.621 | 6.618 | 6.625 | 6.637 | 6.67 |
| 1.70833333333333 | 6.621 | 6.616 | 6.627 | 6.64 | 6.674 |
| 1.70972222222222 | 6.62 | 6.615 | 6.628 | 6.636 | 6.674 |
| 1.71111111111111 | 6.621 | 6.615 | 6.626 | 6.638 | 6.676 |
| 1.7125 | 6.622 | 6.621 | 6.628 | 6.638 | 6.674 |
| 1.71388888888889 | 6.624 | 6.615 | 6.629 | 6.639 | 6.673 |
| 1.71527777777778 | 6.621 | 6.619 | 6.629 | 6.638 | 6.669 |
| 1.71666666666667 | 6.622 | 6.621 | 6.627 | 6.638 | 6.673 |
| 1.71805555555556 | 6.619 | 6.618 | 6.629 | 6.638 | 6.674 |
| 1.71944444444444 | 6.619 | 6.619 | 6.63 | 6.641 | 6.674 |
| 1.72083333333333 | 6.62 | 6.619 | 6.632 | 6.638 | 6.674 |
| 1.72222222222222 | 6.621 | 6.621 | 6.633 | 6.638 | 6.675 |
| 1.72361111111111 | 6.621 | 6.619 | 6.626 | 6.637 | 6.674 |
| 1.725 | 6.619 | 6.619 | 6.622 | 6.637 | 6.676 |
| 1.72638888888889 | 6.621 | 6.618 | 6.618 | 6.639 | 6.677 |
| 1.72777777777778 | 6.622 | 6.615 | 6.619 | 6.64 | 6.675 |
| 1.72916666666667 | 6.622 | 6.619 | 6.619 | 6.639 | 6.677 |
| 1.73055555555556 | 6.621 | 6.614 | 6.618 | 6.637 | 6.675 |
| 1.73194444444444 | 6.624 | 6.611 | 6.62 | 6.641 | 6.673 |
| 1.73333333333333 | 6.622 | 6.612 | 6.622 | 6.638 | 6.675 |
| 1.73472222222222 | 6.621 | 6.614 | 6.62 | 6.64 | 6.676 |
| 1.73611111111111 | 6.618 | 6.612 | 6.619 | 6.641 | 6.677 |
| 1.7375 | 6.618 | 6.613 | 6.621 | 6.638 | 6.678 |
| 1.73888888888889 | 6.616 | 6.615 | 6.62 | 6.64 | 6.677 |
| 1.74027777777778 | 6.62 | 6.613 | 6.62 | 6.641 | 6.68 |
| 1.74166666666667 | 6.618 | 6.613 | 6.62 | 6.64 | 6.676 |
| 1.74305555555556 | 6.617 | 6.613 | 6.621 | 6.64 | 6.678 |
| 1.74444444444444 | 6.62 | 6.613 | 6.623 | 6.637 | 6.679 |
| 1.74583333333333 | 6.617 | 6.615 | 6.621 | 6.641 | 6.679 |
| 1.74722222222222 | 6.617 | 6.617 | 6.62 | 6.637 | 6.677 |
| 1.74861111111111 | 6.618 | 6.616 | 6.624 | 6.635 | 6.676 |
| 1.75 | 6.618 | 6.615 | 6.621 | 6.634 | 6.669 |
| 1.75138888888889 | 6.62 | 6.614 | 6.621 | 6.636 | 6.672 |
| 1.75277777777778 | 6.621 | 6.617 | 6.624 | 6.635 | 6.672 |
| 1.75416666666667 | 6.619 | 6.619 | 6.62 | 6.636 | 6.671 |
| 1.75555555555556 | 6.619 | 6.616 | 6.622 | 6.634 | 6.672 |
| 1.75694444444444 | 6.62 | 6.616 | 6.622 | 6.636 | 6.672 |
| 1.75833333333333 | 6.621 | 6.617 | 6.623 | 6.635 | 6.67 |
| 1.75972222222222 | 6.62 | 6.616 | 6.625 | 6.636 | 6.672 |
| 1.76111111111111 | 6.623 | 6.617 | 6.625 | 6.636 | 6.672 |
| 1.7625 | 6.62 | 6.618 | 6.624 | 6.635 | 6.672 |
| 1.76388888888889 | 6.622 | 6.62 | 6.624 | 6.634 | 6.674 |
| 1.76527777777778 | 6.624 | 6.619 | 6.624 | 6.639 | 6.676 |
| 1.76666666666667 | 6.624 | 6.619 | 6.624 | 6.637 | 6.675 |
| 1.76805555555556 | 6.625 | 6.622 | 6.624 | 6.636 | 6.673 |
| 1.76944444444444 | 6.623 | 6.619 | 6.62 | 6.638 | 6.675 |
| 1.77083333333333 | 6.621 | 6.619 | 6.621 | 6.636 | 6.674 |
| 1.77222222222222 | 6.625 | 6.619 | 6.619 | 6.638 | 6.674 |
| 1.77361111111111 | 6.623 | 6.615 | 6.619 | 6.638 | 6.679 |
| 1.775 | 6.625 | 6.613 | 6.619 | 6.638 | 6.675 |
| 1.77638888888889 | 6.621 | 6.613 | 6.62 | 6.637 | 6.674 |
| 1.77777777777778 | 6.621 | 6.613 | 6.616 | 6.64 | 6.675 |
| 1.77916666666667 | 6.621 | 6.617 | 6.619 | 6.641 | 6.675 |
| 1.78055555555556 | 6.62 | 6.614 | 6.618 | 6.638 | 6.677 |
| 1.78194444444444 | 6.616 | 6.618 | 6.621 | 6.638 | 6.677 |
| 1.78333333333333 | 6.614 | 6.619 | 6.62 | 6.639 | 6.676 |
| 1.78472222222222 | 6.616 | 6.614 | 6.621 | 6.639 | 6.676 |
| 1.78611111111111 | 6.614 | 6.611 | 6.621 | 6.637 | 6.679 |
| 1.7875 | 6.616 | 6.616 | 6.618 | 6.64 | 6.677 |
| 1.78888888888889 | 6.617 | 6.616 | 6.621 | 6.64 | 6.679 |
| 1.79027777777778 | 6.617 | 6.618 | 6.623 | 6.642 | 6.68 |
| 1.79166666666667 | 6.616 | 6.615 | 6.622 | 6.64 | 6.679 |
| 1.79305555555556 | 6.619 | 6.618 | 6.622 | 6.64 | 6.68 |
| 1.79444444444444 | 6.617 | 6.617 | 6.624 | 6.643 | 6.679 |
| 1.79583333333333 | 6.617 | 6.615 | 6.623 | 6.638 | 6.68 |
| 1.79722222222222 | 6.618 | 6.618 | 6.625 | 6.634 | 6.68 |
| 1.79861111111111 | 6.621 | 6.617 | 6.624 | 6.634 | 6.677 |
| 1.8 | 6.619 | 6.617 | 6.624 | 6.629 | 6.679 |
| 1.80138888888889 | 6.617 | 6.62 | 6.624 | 6.63 | 6.666 |
| 1.80277777777778 | 6.62 | 6.619 | 6.626 | 6.63 | 6.675 |
| 1.80416666666667 | 6.623 | 6.616 | 6.628 | 6.633 | 6.67 |
| 1.80555555555556 | 6.62 | 6.618 | 6.627 | 6.632 | 6.667 |
| 1.80694444444444 | 6.622 | 6.618 | 6.626 | 6.633 | 6.666 |
| 1.80833333333333 | 6.62 | 6.619 | 6.628 | 6.631 | 6.667 |
| 1.80972222222222 | 6.621 | 6.621 | 6.625 | 6.632 | 6.67 |
| 1.81111111111111 | 6.622 | 6.62 | 6.627 | 6.634 | 6.668 |
| 1.8125 | 6.622 | 6.618 | 6.629 | 6.632 | 6.668 |
| 1.81388888888889 | 6.623 | 6.618 | 6.624 | 6.633 | 6.669 |
| 1.81527777777778 | 6.625 | 6.619 | 6.624 | 6.635 | 6.667 |
| 1.81666666666667 | 6.623 | 6.618 | 6.619 | 6.631 | 6.669 |
| 1.81805555555556 | 6.62 | 6.614 | 6.619 | 6.633 | 6.669 |
| 1.81944444444444 | 6.622 | 6.615 | 6.618 | 6.634 | 6.668 |
| 1.82083333333333 | 6.622 | 6.615 | 6.62 | 6.636 | 6.669 |
| 1.82222222222222 | 6.621 | 6.614 | 6.617 | 6.632 | 6.67 |
| 1.82361111111111 | 6.615 | 6.614 | 6.621 | 6.633 | 6.669 |
| 1.825 | 6.618 | 6.615 | 6.62 | 6.634 | 6.671 |
| 1.82638888888889 | 6.618 | 6.617 | 6.621 | 6.635 | 6.671 |
| 1.82777777777778 | 6.616 | 6.618 | 6.621 | 6.634 | 6.669 |
| 1.82916666666667 | 6.615 | 6.615 | 6.62 | 6.635 | 6.671 |
| 1.83055555555556 | 6.616 | 6.616 | 6.621 | 6.635 | 6.673 |
| 1.83194444444444 | 6.617 | 6.616 | 6.621 | 6.635 | 6.67 |
| 1.83333333333333 | 6.618 | 6.616 | 6.623 | 6.638 | 6.672 |
| 1.83472222222222 | 6.619 | 6.615 | 6.622 | 6.635 | 6.672 |
| 1.83611111111111 | 6.621 | 6.615 | 6.623 | 6.636 | 6.675 |
| 1.8375 | 6.619 | 6.617 | 6.621 | 6.635 | 6.671 |
| 1.83888888888889 | 6.618 | 6.62 | 6.622 | 6.638 | 6.674 |
| 1.84027777777778 | 6.62 | 6.619 | 6.625 | 6.635 | 6.675 |
| 1.84166666666667 | 6.621 | 6.618 | 6.623 | 6.636 | 6.673 |
| 1.84305555555556 | 6.622 | 6.62 | 6.622 | 6.637 | 6.674 |
| 1.84444444444444 | 6.62 | 6.62 | 6.624 | 6.636 | 6.677 |
| 1.84583333333333 | 6.619 | 6.619 | 6.623 | 6.637 | 6.674 |
| 1.84722222222222 | 6.62 | 6.618 | 6.623 | 6.634 | 6.673 |
| 1.84861111111111 | 6.618 | 6.62 | 6.624 | 6.635 | 6.672 |
| 1.85 | 6.619 | 6.623 | 6.623 | 6.635 | 6.674 |
| 1.85138888888889 | 6.622 | 6.618 | 6.626 | 6.637 | 6.671 |
| 1.85277777777778 | 6.62 | 6.619 | 6.627 | 6.634 | 6.67 |
| 1.85416666666667 | 6.623 | 6.619 | 6.625 | 6.634 | 6.672 |
| 1.85555555555556 | 6.621 | 6.622 | 6.623 | 6.637 | 6.67 |
| 1.85694444444444 | 6.621 | 6.624 | 6.625 | 6.636 | 6.67 |
| 1.85833333333333 | 6.623 | 6.621 | 6.625 | 6.636 | 6.674 |
| 1.85972222222222 | 6.622 | 6.623 | 6.621 | 6.637 | 6.673 |
| 1.86111111111111 | 6.624 | 6.62 | 6.619 | 6.636 | 6.673 |
| 1.8625 | 6.627 | 6.619 | 6.619 | 6.637 | 6.672 |
| 1.86388888888889 | 6.622 | 6.617 | 6.618 | 6.639 | 6.672 |
| 1.86527777777778 | 6.622 | 6.614 | 6.62 | 6.638 | 6.673 |
| 1.86666666666667 | 6.622 | 6.613 | 6.622 | 6.639 | 6.674 |
| 1.86805555555556 | 6.624 | 6.616 | 6.621 | 6.635 | 6.675 |
| 1.86944444444444 | 6.62 | 6.615 | 6.621 | 6.638 | 6.676 |
| 1.87083333333333 | 6.617 | 6.616 | 6.623 | 6.638 | 6.674 |
| 1.87222222222222 | 6.614 | 6.618 | 6.622 | 6.637 | 6.672 |
| 1.87361111111111 | 6.612 | 6.618 | 6.622 | 6.635 | 6.675 |
| 1.875 | 6.613 | 6.619 | 6.623 | 6.64 | 6.673 |
| 1.87638888888889 | 6.617 | 6.617 | 6.625 | 6.639 | 6.674 |
| 1.87777777777778 | 6.618 | 6.617 | 6.624 | 6.641 | 6.673 |
| 1.87916666666667 | 6.615 | 6.618 | 6.625 | 6.64 | 6.675 |
| 1.88055555555556 | 6.615 | 6.619 | 6.625 | 6.64 | 6.677 |
| 1.88194444444444 | 6.617 | 6.617 | 6.625 | 6.64 | 6.677 |
| 1.88333333333333 | 6.616 | 6.621 | 6.624 | 6.64 | 6.678 |
| 1.88472222222222 | 6.617 | 6.62 | 6.624 | 6.645 | 6.679 |
| 1.88611111111111 | 6.617 | 6.616 | 6.622 | 6.643 | 6.678 |
| 1.8875 | 6.617 | 6.619 | 6.623 | 6.641 | 6.677 |
| 1.88888888888889 | 6.615 | 6.621 | 6.624 | 6.643 | 6.678 |
| 1.89027777777778 | 6.615 | 6.621 | 6.623 | 6.642 | 6.678 |
| 1.89166666666667 | 6.617 | 6.618 | 6.626 | 6.641 | 6.679 |
| 1.89305555555556 | 6.615 | 6.62 | 6.624 | 6.642 | 6.677 |
| 1.89444444444444 | 6.62 | 6.62 | 6.622 | 6.638 | 6.675 |
| 1.89583333333333 | 6.618 | 6.62 | 6.624 | 6.63 | 6.677 |
| 1.89722222222222 | 6.619 | 6.623 | 6.627 | 6.635 | 6.676 |
| 1.89861111111111 | 6.62 | 6.621 | 6.623 | 6.635 | 6.68 |
| 1.9 | 6.619 | 6.622 | 6.624 | 6.631 | 6.666 |
| 1.90138888888889 | 6.619 | 6.621 | 6.624 | 6.632 | 6.665 |
| 1.90277777777778 | 6.622 | 6.619 | 6.622 | 6.633 | 6.665 |
| 1.90416666666667 | 6.62 | 6.616 | 6.621 | 6.632 | 6.67 |
| 1.90555555555556 | 6.618 | 6.622 | 6.623 | 6.631 | 6.667 |
| 1.90694444444444 | 6.621 | 6.616 | 6.619 | 6.633 | 6.667 |
| 1.90833333333333 | 6.621 | 6.614 | 6.62 | 6.633 | 6.668 |
| 1.90972222222222 | 6.619 | 6.614 | 6.621 | 6.632 | 6.669 |
| 1.91111111111111 | 6.62 | 6.615 | 6.62 | 6.633 | 6.67 |
| 1.9125 | 6.618 | 6.613 | 6.621 | 6.633 | 6.669 |
| 1.91388888888889 | 6.618 | 6.614 | 6.621 | 6.634 | 6.668 |
| 1.91527777777778 | 6.617 | 6.616 | 6.621 | 6.634 | 6.67 |
| 1.91666666666667 | 6.616 | 6.613 | 6.623 | 6.638 | 6.67 |
| 1.91805555555556 | 6.618 | 6.613 | 6.623 | 6.636 | 6.674 |
| 1.91944444444444 | 6.618 | 6.615 | 6.622 | 6.634 | 6.668 |
| 1.92083333333333 | 6.616 | 6.612 | 6.622 | 6.634 | 6.673 |
| 1.92222222222222 | 6.62 | 6.615 | 6.623 | 6.634 | 6.668 |
| 1.92361111111111 | 6.619 | 6.617 | 6.622 | 6.636 | 6.669 |
| 1.925 | 6.616 | 6.616 | 6.627 | 6.635 | 6.67 |
| 1.92638888888889 | 6.617 | 6.615 | 6.625 | 6.636 | 6.671 |
| 1.92777777777778 | 6.62 | 6.614 | 6.622 | 6.633 | 6.673 |
| 1.92916666666667 | 6.618 | 6.62 | 6.627 | 6.636 | 6.673 |
| 1.93055555555556 | 6.618 | 6.617 | 6.624 | 6.634 | 6.67 |
| 1.93194444444444 | 6.618 | 6.618 | 6.625 | 6.639 | 6.674 |
| 1.93333333333333 | 6.617 | 6.617 | 6.624 | 6.637 | 6.673 |
| 1.93472222222222 | 6.62 | 6.62 | 6.626 | 6.636 | 6.673 |
| 1.93611111111111 | 6.618 | 6.621 | 6.623 | 6.638 | 6.673 |
| 1.9375 | 6.622 | 6.621 | 6.628 | 6.638 | 6.673 |
| 1.93888888888889 | 6.621 | 6.621 | 6.628 | 6.64 | 6.674 |
| 1.94027777777778 | 6.62 | 6.619 | 6.624 | 6.638 | 6.672 |
| 1.94166666666667 | 6.621 | 6.619 | 6.624 | 6.633 | 6.676 |
| 1.94305555555556 | 6.622 | 6.62 | 6.627 | 6.635 | 6.675 |
| 1.94444444444444 | 6.623 | 6.621 | 6.626 | 6.634 | 6.673 |
| 1.94583333333333 | 6.623 | 6.622 | 6.625 | 6.63 | 6.67 |
| 1.94722222222222 | 6.626 | 6.62 | 6.62 | 6.631 | 6.668 |
| 1.94861111111111 | 6.624 | 6.619 | 6.623 | 6.633 | 6.665 |
| 1.95 | 6.622 | 6.623 | 6.622 | 6.632 | 6.666 |
| 1.95138888888889 | 6.623 | 6.62 | 6.622 | 6.632 | 6.668 |
| 1.95277777777778 | 6.626 | 6.619 | 6.623 | 6.631 | 6.667 |
| 1.95416666666667 | 6.625 | 6.612 | 6.62 | 6.633 | 6.668 |
| 1.95555555555556 | 6.623 | 6.614 | 6.622 | 6.631 | 6.668 |
| 1.95694444444444 | 6.617 | 6.61 | 6.62 | 6.634 | 6.668 |
| 1.95833333333333 | 6.623 | 6.611 | 6.62 | 6.634 | 6.671 |
| 1.95972222222222 | 6.613 | 6.61 | 6.621 | 6.635 | 6.667 |
| 1.96111111111111 | 6.611 | 6.609 | 6.621 | 6.633 | 6.67 |
| 1.9625 | 6.613 | 6.609 | 6.619 | 6.634 | 6.672 |
| 1.96388888888889 | 6.613 | 6.61 | 6.621 | 6.635 | 6.672 |
| 1.96527777777778 | 6.613 | 6.613 | 6.622 | 6.634 | 6.674 |
| 1.96666666666667 | 6.614 | 6.613 | 6.621 | 6.634 | 6.673 |
| 1.96805555555556 | 6.615 | 6.614 | 6.621 | 6.638 | 6.67 |
| 1.96944444444444 | 6.612 | 6.611 | 6.62 | 6.635 | 6.671 |
| 1.97083333333333 | 6.615 | 6.611 | 6.621 | 6.638 | 6.671 |
| 1.97222222222222 | 6.613 | 6.615 | 6.622 | 6.638 | 6.671 |
| 1.97361111111111 | 6.615 | 6.613 | 6.622 | 6.635 | 6.668 |
| 1.975 | 6.617 | 6.613 | 6.624 | 6.635 | 6.671 |
| 1.97638888888889 | 6.616 | 6.614 | 6.625 | 6.633 | 6.671 |
| 1.97777777777778 | 6.619 | 6.613 | 6.626 | 6.635 | 6.671 |
| 1.97916666666667 | 6.62 | 6.614 | 6.624 | 6.636 | 6.671 |
| 1.98055555555556 | 6.618 | 6.615 | 6.626 | 6.635 | 6.672 |
| 1.98194444444444 | 6.615 | 6.616 | 6.626 | 6.635 | 6.672 |
| 1.98333333333333 | 6.621 | 6.617 | 6.625 | 6.637 | 6.675 |
| 1.98472222222222 | 6.621 | 6.614 | 6.626 | 6.639 | 6.674 |
| 1.98611111111111 | 6.62 | 6.615 | 6.627 | 6.639 | 6.674 |
| 1.9875 | 6.617 | 6.618 | 6.629 | 6.636 | 6.674 |
| 1.98888888888889 | 6.618 | 6.617 | 6.629 | 6.64 | 6.673 |
| 1.99027777777778 | 6.62 | 6.617 | 6.628 | 6.636 | 6.673 |
| 1.99166666666667 | 6.62 | 6.614 | 6.623 | 6.636 | 6.677 |
| 1.99305555555556 | 6.619 | 6.618 | 6.623 | 6.634 | 6.673 |
| 1.99444444444444 | 6.619 | 6.618 | 6.618 | 6.633 | 6.673 |
| 1.99583333333333 | 6.618 | 6.617 | 6.614 | 6.631 | 6.673 |
| 1.99722222222222 | 6.619 | 6.615 | 6.613 | 6.632 | 6.671 |
| 1.99861111111111 | 6.621 | 6.613 | 6.616 | 6.633 | 6.667 |
| 2.0 | 6.622 | 6.614 | 6.617 | 6.636 | 6.668 |
| 2.00138888888889 | 6.617 | 6.614 | 6.615 | 6.633 | 6.668 |
| 2.00277777777778 | 6.618 | 6.615 | 6.616 | 6.634 | 6.669 |
| 2.00416666666667 | 6.621 | 6.616 | 6.62 | 6.634 | 6.668 |
| 2.00555555555556 | 6.619 | 6.615 | 6.619 | 6.635 | 6.669 |
| 2.00694444444444 | 6.616 | 6.617 | 6.62 | 6.635 | 6.67 |
| 2.00833333333333 | 6.62 | 6.615 | 6.619 | 6.636 | 6.67 |
| 2.00972222222222 | 6.618 | 6.615 | 6.617 | 6.635 | 6.668 |
| 2.01111111111111 | 6.622 | 6.614 | 6.62 | 6.635 | 6.671 |
| 2.0125 | 6.62 | 6.615 | 6.62 | 6.636 | 6.671 |
| 2.01388888888889 | 6.62 | 6.617 | 6.62 | 6.634 | 6.672 |
| 2.01527777777778 | 6.618 | 6.617 | 6.621 | 6.636 | 6.671 |
| 2.01666666666667 | 6.618 | 6.62 | 6.617 | 6.637 | 6.671 |
| 2.01805555555556 | 6.622 | 6.616 | 6.619 | 6.638 | 6.673 |
| 2.01944444444444 | 6.621 | 6.616 | 6.621 | 6.633 | 6.669 |
| 2.02083333333333 | 6.622 | 6.617 | 6.622 | 6.633 | 6.673 |
| 2.02222222222222 | 6.616 | 6.619 | 6.622 | 6.636 | 6.669 |
| 2.02361111111111 | 6.619 | 6.618 | 6.62 | 6.637 | 6.674 |
| 2.025 | 6.62 | 6.621 | 6.625 | 6.635 | 6.674 |
| 2.02638888888889 | 6.62 | 6.62 | 6.621 | 6.637 | 6.673 |
| 2.02777777777778 | 6.619 | 6.621 | 6.623 | 6.637 | 6.673 |
| 2.02916666666667 | 6.623 | 6.62 | 6.623 | 6.638 | 6.673 |
| 2.03055555555556 | 6.62 | 6.62 | 6.62 | 6.639 | 6.672 |
| 2.03194444444444 | 6.621 | 6.621 | 6.624 | 6.638 | 6.674 |
| 2.03333333333333 | 6.625 | 6.621 | 6.623 | 6.637 | 6.675 |
| 2.03472222222222 | 6.621 | 6.622 | 6.623 | 6.641 | 6.676 |
| 2.03611111111111 | 6.623 | 6.623 | 6.624 | 6.64 | 6.673 |
| 2.0375 | 6.623 | 6.624 | 6.625 | 6.637 | 6.676 |
| 2.03888888888889 | 6.622 | 6.623 | 6.627 | 6.635 | 6.677 |
| 2.04027777777778 | 6.625 | 6.625 | 6.62 | 6.634 | 6.676 |
| 2.04166666666667 | 6.624 | 6.623 | 6.622 | 6.634 | 6.672 |
| 2.04305555555556 | 6.626 | 6.61 | 6.622 | 6.633 | 6.675 |
| 2.04444444444444 | 6.624 | 6.612 | 6.624 | 6.633 | 6.674 |
| 2.04583333333333 | 6.625 | 6.615 | 6.622 | 6.633 | 6.667 |
| 2.04722222222222 | 6.627 | 6.613 | 6.622 | 6.635 | 6.669 |
| 2.04861111111111 | 6.626 | 6.608 | 6.621 | 6.633 | 6.675 |
| 2.05 | 6.622 | 6.609 | 6.619 | 6.634 | 6.67 |
| 2.05138888888889 | 6.614 | 6.612 | 6.622 | 6.634 | 6.67 |
| 2.05277777777778 | 6.615 | 6.608 | 6.625 | 6.634 | 6.672 |
| 2.05416666666667 | 6.614 | 6.611 | 6.624 | 6.633 | 6.671 |
| 2.05555555555556 | 6.616 | 6.613 | 6.625 | 6.636 | 6.67 |
| 2.05694444444444 | 6.614 | 6.612 | 6.624 | 6.635 | 6.673 |
| 2.05833333333333 | 6.614 | 6.611 | 6.624 | 6.632 | 6.675 |
| 2.05972222222222 | 6.616 | 6.613 | 6.626 | 6.634 | 6.672 |
| 2.06111111111111 | 6.614 | 6.612 | 6.625 | 6.634 | 6.674 |
| 2.0625 | 6.616 | 6.612 | 6.625 | 6.635 | 6.673 |
| 2.06388888888889 | 6.616 | 6.613 | 6.625 | 6.637 | 6.673 |
| 2.06527777777778 | 6.617 | 6.613 | 6.625 | 6.635 | 6.671 |
| 2.06666666666667 | 6.618 | 6.614 | 6.626 | 6.638 | 6.671 |
| 2.06805555555556 | 6.618 | 6.613 | 6.627 | 6.637 | 6.673 |
| 2.06944444444444 | 6.617 | 6.615 | 6.627 | 6.635 | 6.672 |
| 2.07083333333333 | 6.619 | 6.614 | 6.627 | 6.637 | 6.673 |
| 2.07222222222222 | 6.618 | 6.615 | 6.628 | 6.638 | 6.673 |
| 2.07361111111111 | 6.619 | 6.614 | 6.627 | 6.637 | 6.673 |
| 2.075 | 6.619 | 6.614 | 6.629 | 6.638 | 6.675 |
| 2.07638888888889 | 6.618 | 6.614 | 6.628 | 6.637 | 6.673 |
| 2.07777777777778 | 6.616 | 6.618 | 6.627 | 6.64 | 6.676 |
| 2.07916666666667 | 6.618 | 6.617 | 6.626 | 6.641 | 6.675 |
| 2.08055555555556 | 6.615 | 6.616 | 6.628 | 6.64 | 6.673 |
| 2.08194444444444 | 6.62 | 6.615 | 6.629 | 6.639 | 6.676 |
| 2.08333333333333 | 6.617 | 6.619 | 6.628 | 6.639 | 6.675 |
| 2.08472222222222 | 6.619 | 6.615 | 6.624 | 6.639 | 6.677 |
| 2.08611111111111 | 6.619 | 6.617 | 6.625 | 6.641 | 6.678 |
| 2.0875 | 6.618 | 6.618 | 6.622 | 6.638 | 6.675 |
| 2.08888888888889 | 6.618 | 6.618 | 6.62 | 6.635 | 6.677 |
| 2.09027777777778 | 6.623 | 6.62 | 6.621 | 6.636 | 6.679 |
| 2.09166666666667 | 6.618 | 6.619 | 6.618 | 6.635 | 6.674 |
| 2.09305555555556 | 6.62 | 6.615 | 6.615 | 6.634 | 6.674 |
| 2.09444444444444 | 6.613 | 6.617 | 6.618 | 6.633 | 6.674 |
| 2.09583333333333 | 6.613 | 6.613 | 6.618 | 6.631 | 6.667 |
| 2.09722222222222 | 6.618 | 6.617 | 6.617 | 6.632 | 6.671 |
| 2.09861111111111 | 6.614 | 6.615 | 6.619 | 6.633 | 6.671 |
| 2.1 | 6.616 | 6.615 | 6.616 | 6.632 | 6.671 |
| 2.10138888888889 | 6.613 | 6.615 | 6.618 | 6.636 | 6.67 |
| 2.10277777777778 | 6.613 | 6.616 | 6.619 | 6.636 | 6.669 |
| 2.10416666666667 | 6.614 | 6.616 | 6.619 | 6.636 | 6.67 |
| 2.10555555555556 | 6.616 | 6.617 | 6.617 | 6.634 | 6.672 |
| 2.10694444444444 | 6.616 | 6.618 | 6.616 | 6.639 | 6.672 |
| 2.10833333333333 | 6.615 | 6.617 | 6.618 | 6.635 | 6.672 |
| 2.10972222222222 | 6.615 | 6.62 | 6.619 | 6.636 | 6.673 |
| 2.11111111111111 | 6.617 | 6.619 | 6.62 | 6.634 | 6.676 |
| 2.1125 | 6.616 | 6.618 | 6.62 | 6.637 | 6.675 |
| 2.11388888888889 | 6.616 | 6.619 | 6.621 | 6.638 | 6.673 |
| 2.11527777777778 | 6.617 | 6.619 | 6.62 | 6.635 | 6.674 |
| 2.11666666666667 | 6.616 | 6.619 | 6.621 | 6.637 | 6.671 |
| 2.11805555555556 | 6.617 | 6.619 | 6.624 | 6.637 | 6.673 |
| 2.11944444444444 | 6.615 | 6.618 | 6.621 | 6.638 | 6.675 |
| 2.12083333333333 | 6.615 | 6.618 | 6.622 | 6.637 | 6.675 |
| 2.12222222222222 | 6.615 | 6.62 | 6.622 | 6.638 | 6.675 |
| 2.12361111111111 | 6.617 | 6.619 | 6.621 | 6.637 | 6.675 |
| 2.125 | 6.619 | 6.619 | 6.622 | 6.638 | 6.673 |
| 2.12638888888889 | 6.62 | 6.618 | 6.62 | 6.64 | 6.675 |
| 2.12777777777778 | 6.618 | 6.619 | 6.624 | 6.639 | 6.677 |
| 2.12916666666667 | 6.616 | 6.62 | 6.622 | 6.64 | 6.678 |
| 2.13055555555556 | 6.62 | 6.621 | 6.622 | 6.641 | 6.679 |
| 2.13194444444444 | 6.62 | 6.621 | 6.624 | 6.64 | 6.673 |
| 2.13333333333333 | 6.619 | 6.62 | 6.621 | 6.641 | 6.678 |
| 2.13472222222222 | 6.621 | 6.622 | 6.621 | 6.636 | 6.676 |
| 2.13611111111111 | 6.62 | 6.622 | 6.622 | 6.641 | 6.677 |
| 2.1375 | 6.621 | 6.621 | 6.619 | 6.631 | 6.675 |
| 2.13888888888889 | 6.621 | 6.623 | 6.624 | 6.633 | 6.677 |
| 2.14027777777778 | 6.625 | 6.62 | 6.619 | 6.633 | 6.677 |
| 2.14166666666667 | 6.622 | 6.621 | 6.623 | 6.633 | 6.677 |
| 2.14305555555556 | 6.621 | 6.616 | 6.622 | 6.635 | 6.678 |
| 2.14444444444444 | 6.622 | 6.611 | 6.623 | 6.634 | 6.675 |
| 2.14583333333333 | 6.621 | 6.609 | 6.621 | 6.635 | 6.675 |
| 2.14722222222222 | 6.615 | 6.611 | 6.621 | 6.635 | 6.671 |
| 2.14861111111111 | 6.619 | 6.612 | 6.621 | 6.637 | 6.67 |
| 2.15 | 6.614 | 6.613 | 6.619 | 6.638 | 6.673 |
| 2.15138888888889 | 6.614 | 6.611 | 6.622 | 6.638 | 6.671 |
| 2.15277777777778 | 6.614 | 6.61 | 6.621 | 6.634 | 6.673 |
| 2.15416666666667 | 6.611 | 6.613 | 6.626 | 6.635 | 6.673 |
| 2.15555555555556 | 6.615 | 6.612 | 6.622 | 6.638 | 6.673 |
| 2.15694444444444 | 6.613 | 6.611 | 6.623 | 6.634 | 6.675 |
| 2.15833333333333 | 6.614 | 6.613 | 6.623 | 6.637 | 6.673 |
| 2.15972222222222 | 6.614 | 6.613 | 6.624 | 6.637 | 6.671 |
| 2.16111111111111 | 6.616 | 6.613 | 6.625 | 6.636 | 6.671 |
| 2.1625 | 6.617 | 6.614 | 6.623 | 6.638 | 6.67 |
| 2.16388888888889 | 6.616 | 6.616 | 6.627 | 6.638 | 6.671 |
| 2.16527777777778 | 6.614 | 6.614 | 6.623 | 6.64 | 6.672 |
| 2.16666666666667 | 6.615 | 6.615 | 6.625 | 6.638 | 6.672 |
| 2.16805555555556 | 6.616 | 6.614 | 6.626 | 6.64 | 6.67 |
| 2.16944444444444 | 6.618 | 6.615 | 6.627 | 6.641 | 6.674 |
| 2.17083333333333 | 6.617 | 6.615 | 6.625 | 6.638 | 6.674 |
| 2.17222222222222 | 6.615 | 6.616 | 6.624 | 6.637 | 6.673 |
| 2.17361111111111 | 6.617 | 6.615 | 6.625 | 6.639 | 6.677 |
| 2.175 | 6.614 | 6.617 | 6.625 | 6.638 | 6.674 |
| 2.17638888888889 | 6.617 | 6.617 | 6.625 | 6.639 | 6.676 |
| 2.17777777777778 | 6.619 | 6.615 | 6.628 | 6.64 | 6.673 |
| 2.17916666666667 | 6.618 | 6.616 | 6.627 | 6.641 | 6.676 |
| 2.18055555555556 | 6.619 | 6.616 | 6.626 | 6.64 | 6.676 |
| 2.18194444444444 | 6.618 | 6.616 | 6.625 | 6.64 | 6.676 |
| 2.18333333333333 | 6.618 | 6.617 | 6.626 | 6.642 | 6.679 |
| 2.18472222222222 | 6.618 | 6.615 | 6.626 | 6.642 | 6.677 |
| 2.18611111111111 | 6.62 | 6.616 | 6.623 | 6.641 | 6.678 |
| 2.1875 | 6.618 | 6.617 | 6.625 | 6.643 | 6.678 |
| 2.18888888888889 | 6.62 | 6.618 | 6.624 | 6.638 | 6.678 |
| 2.19027777777778 | 6.62 | 6.615 | 6.628 | 6.636 | 6.68 |
| 2.19166666666667 | 6.617 | 6.617 | 6.624 | 6.629 | 6.678 |
| 2.19305555555556 | 6.619 | 6.614 | 6.619 | 6.631 | 6.678 |
| 2.19444444444444 | 6.62 | 6.613 | 6.618 | 6.633 | 6.678 |
| 2.19583333333333 | 6.618 | 6.61 | 6.613 | 6.63 | 6.678 |
| 2.19722222222222 | 6.622 | 6.608 | 6.619 | 6.63 | 6.677 |
| 2.19861111111111 | 6.616 | 6.616 | 6.62 | 6.631 | 6.677 |
| 2.2 | 6.619 | 6.61 | 6.616 | 6.632 | 6.674 |
| 2.20138888888889 | 6.611 | 6.61 | 6.614 | 6.632 | 6.667 |
| 2.20277777777778 | 6.614 | 6.611 | 6.618 | 6.633 | 6.667 |
| 2.20416666666667 | 6.612 | 6.612 | 6.619 | 6.634 | 6.668 |
| 2.20555555555556 | 6.613 | 6.61 | 6.618 | 6.632 | 6.669 |
| 2.20694444444444 | 6.615 | 6.607 | 6.62 | 6.631 | 6.669 |
| 2.20833333333333 | 6.616 | 6.608 | 6.618 | 6.632 | 6.668 |
| 2.20972222222222 | 6.613 | 6.613 | 6.619 | 6.634 | 6.67 |
| 2.21111111111111 | 6.615 | 6.611 | 6.622 | 6.635 | 6.669 |
| 2.2125 | 6.615 | 6.609 | 6.618 | 6.631 | 6.667 |
| 2.21388888888889 | 6.616 | 6.613 | 6.621 | 6.634 | 6.671 |
| 2.21527777777778 | 6.616 | 6.614 | 6.619 | 6.63 | 6.669 |
| 2.21666666666667 | 6.616 | 6.612 | 6.618 | 6.635 | 6.671 |
| 2.21805555555556 | 6.617 | 6.61 | 6.622 | 6.634 | 6.67 |
| 2.21944444444444 | 6.615 | 6.614 | 6.62 | 6.637 | 6.67 |
| 2.22083333333333 | 6.616 | 6.613 | 6.618 | 6.634 | 6.668 |
| 2.22222222222222 | 6.616 | 6.616 | 6.621 | 6.637 | 6.669 |
| 2.22361111111111 | 6.62 | 6.612 | 6.621 | 6.638 | 6.673 |
| 2.225 | 6.616 | 6.615 | 6.621 | 6.634 | 6.672 |
| 2.22638888888889 | 6.617 | 6.615 | 6.619 | 6.637 | 6.671 |
| 2.22777777777778 | 6.616 | 6.616 | 6.619 | 6.636 | 6.672 |
| 2.22916666666667 | 6.617 | 6.613 | 6.622 | 6.639 | 6.671 |
| 2.23055555555556 | 6.616 | 6.613 | 6.622 | 6.637 | 6.673 |
| 2.23194444444444 | 6.615 | 6.613 | 6.623 | 6.637 | 6.673 |
| 2.23333333333333 | 6.618 | 6.614 | 6.624 | 6.638 | 6.673 |
| 2.23472222222222 | 6.617 | 6.614 | 6.621 | 6.637 | 6.671 |
| 2.23611111111111 | 6.616 | 6.618 | 6.621 | 6.637 | 6.67 |
| 2.2375 | 6.617 | 6.614 | 6.622 | 6.639 | 6.672 |
| 2.23888888888889 | 6.62 | 6.617 | 6.621 | 6.639 | 6.673 |
| 2.24027777777778 | 6.62 | 6.615 | 6.625 | 6.635 | 6.671 |
| 2.24166666666667 | 6.618 | 6.617 | 6.622 | 6.633 | 6.672 |
| 2.24305555555556 | 6.622 | 6.618 | 6.62 | 6.636 | 6.675 |
| 2.24444444444444 | 6.621 | 6.62 | 6.618 | 6.634 | 6.674 |
| 2.24583333333333 | 6.618 | 6.616 | 6.615 | 6.632 | 6.675 |
| 2.24722222222222 | 6.619 | 6.618 | 6.623 | 6.633 | 6.67 |
| 2.24861111111111 | 6.62 | 6.616 | 6.619 | 6.637 | 6.674 |
| 2.25 | 6.62 | 6.617 | 6.618 | 6.633 | 6.672 |
| 2.25138888888889 | 6.623 | 6.613 | 6.618 | 6.635 | 6.673 |
| 2.25277777777778 | 6.621 | 6.611 | 6.62 | 6.636 | 6.672 |
| 2.25416666666667 | 6.62 | 6.611 | 6.617 | 6.636 | 6.674 |
| 2.25555555555556 | 6.618 | 6.611 | 6.617 | 6.638 | 6.671 |
| 2.25694444444444 | 6.623 | 6.615 | 6.618 | 6.639 | 6.676 |
| 2.25833333333333 | 6.616 | 6.615 | 6.617 | 6.639 | 6.671 |
| 2.25972222222222 | 6.616 | 6.611 | 6.618 | 6.634 | 6.673 |
| 2.26111111111111 | 6.618 | 6.607 | 6.619 | 6.638 | 6.671 |
| 2.2625 | 6.615 | 6.611 | 6.617 | 6.637 | 6.673 |
| 2.26388888888889 | 6.615 | 6.613 | 6.62 | 6.637 | 6.672 |
| 2.26527777777778 | 6.615 | 6.613 | 6.621 | 6.639 | 6.673 |
| 2.26666666666667 | 6.616 | 6.613 | 6.62 | 6.64 | 6.676 |
| 2.26805555555556 | 6.615 | 6.611 | 6.621 | 6.638 | 6.676 |
| 2.26944444444444 | 6.616 | 6.615 | 6.622 | 6.638 | 6.675 |
| 2.27083333333333 | 6.62 | 6.613 | 6.621 | 6.639 | 6.675 |
| 2.27222222222222 | 6.613 | 6.613 | 6.622 | 6.639 | 6.673 |
| 2.27361111111111 | 6.615 | 6.613 | 6.62 | 6.638 | 6.674 |
| 2.275 | 6.614 | 6.615 | 6.621 | 6.641 | 6.674 |
| 2.27638888888889 | 6.614 | 6.616 | 6.621 | 6.64 | 6.674 |
| 2.27777777777778 | 6.617 | 6.616 | 6.621 | 6.642 | 6.676 |
| 2.27916666666667 | 6.618 | 6.614 | 6.622 | 6.639 | 6.677 |
| 2.28055555555556 | 6.617 | 6.615 | 6.622 | 6.641 | 6.676 |
| 2.28194444444444 | 6.62 | 6.614 | 6.622 | 6.64 | 6.679 |
| 2.28333333333333 | 6.616 | 6.616 | 6.62 | 6.639 | 6.676 |
| 2.28472222222222 | 6.617 | 6.613 | 6.62 | 6.644 | 6.677 |
| 2.28611111111111 | 6.618 | 6.616 | 6.62 | 6.644 | 6.675 |
| 2.2875 | 6.62 | 6.616 | 6.624 | 6.641 | 6.674 |
| 2.28888888888889 | 6.618 | 6.617 | 6.622 | 6.642 | 6.675 |
| 2.29027777777778 | 6.619 | 6.618 | 6.619 | 6.641 | 6.676 |
| 2.29166666666667 | 6.62 | 6.617 | 6.62 | 6.643 | 6.675 |
| 2.29305555555556 | 6.616 | 6.617 | 6.623 | 6.642 | 6.676 |
| 2.29444444444444 | 6.619 | 6.617 | 6.622 | 6.641 | 6.675 |
| 2.29583333333333 | 6.62 | 6.619 | 6.624 | 6.634 | 6.678 |
| 2.29722222222222 | 6.619 | 6.619 | 6.625 | 6.635 | 6.674 |
| 2.29861111111111 | 6.62 | 6.619 | 6.622 | 6.638 | 6.677 |
| 2.3 | 6.62 | 6.617 | 6.621 | 6.632 | 6.679 |
| 2.30138888888889 | 6.619 | 6.62 | 6.622 | 6.632 | 6.677 |
| 2.30277777777778 | 6.622 | 6.619 | 6.618 | 6.632 | 6.679 |
| 2.30416666666667 | 6.619 | 6.618 | 6.62 | 6.634 | 6.679 |
| 2.30555555555556 | 6.618 | 6.615 | 6.619 | 6.631 | 6.679 |
| 2.30694444444444 | 6.62 | 6.621 | 6.618 | 6.635 | 6.676 |
| 2.30833333333333 | 6.622 | 6.613 | 6.618 | 6.634 | 6.681 |
| 2.30972222222222 | 6.617 | 6.611 | 6.617 | 6.633 | 6.668 |
| 2.31111111111111 | 6.619 | 6.611 | 6.618 | 6.635 | 6.671 |
| 2.3125 | 6.621 | 6.609 | 6.617 | 6.634 | 6.668 |
| 2.31388888888889 | 6.614 | 6.613 | 6.619 | 6.634 | 6.669 |
| 2.31527777777778 | 6.611 | 6.609 | 6.618 | 6.634 | 6.667 |
| 2.31666666666667 | 6.613 | 6.61 | 6.619 | 6.633 | 6.669 |
| 2.31805555555556 | 6.614 | 6.611 | 6.618 | 6.635 | 6.669 |
| 2.31944444444444 | 6.618 | 6.612 | 6.614 | 6.636 | 6.669 |
| 2.32083333333333 | 6.616 | 6.612 | 6.618 | 6.635 | 6.669 |
| 2.32222222222222 | 6.615 | 6.612 | 6.617 | 6.633 | 6.667 |
| 2.32361111111111 | 6.615 | 6.613 | 6.616 | 6.637 | 6.669 |
| 2.325 | 6.616 | 6.611 | 6.618 | 6.635 | 6.668 |
| 2.32638888888889 | 6.615 | 6.612 | 6.615 | 6.633 | 6.668 |
| 2.32777777777778 | 6.617 | 6.612 | 6.616 | 6.638 | 6.666 |
| 2.32916666666667 | 6.615 | 6.612 | 6.619 | 6.635 | 6.669 |
| 2.33055555555556 | 6.615 | 6.612 | 6.619 | 6.635 | 6.666 |
| 2.33194444444444 | 6.618 | 6.611 | 6.618 | 6.635 | 6.67 |
| 2.33333333333333 | 6.617 | 6.611 | 6.62 | 6.638 | 6.668 |
| 2.33472222222222 | 6.618 | 6.612 | 6.62 | 6.639 | 6.669 |
| 2.33611111111111 | 6.619 | 6.612 | 6.619 | 6.636 | 6.669 |
| 2.3375 | 6.619 | 6.612 | 6.619 | 6.636 | 6.672 |
| 2.33888888888889 | 6.62 | 6.613 | 6.621 | 6.637 | 6.67 |
| 2.34027777777778 | 6.62 | 6.615 | 6.621 | 6.638 | 6.671 |
| 2.34166666666667 | 6.618 | 6.613 | 6.618 | 6.638 | 6.672 |
| 2.34305555555556 | 6.618 | 6.615 | 6.622 | 6.64 | 6.672 |
| 2.34444444444444 | 6.619 | 6.613 | 6.623 | 6.637 | 6.673 |
| 2.34583333333333 | 6.62 | 6.617 | 6.623 | 6.639 | 6.672 |
| 2.34722222222222 | 6.618 | 6.615 | 6.621 | 6.638 | 6.671 |
| 2.34861111111111 | 6.619 | 6.616 | 6.621 | 6.638 | 6.673 |
| 2.35 | 6.618 | 6.615 | 6.621 | 6.634 | 6.672 |
| 2.35138888888889 | 6.618 | 6.613 | 6.622 | 6.636 | 6.673 |
| 2.35277777777778 | 6.62 | 6.612 | 6.623 | 6.637 | 6.674 |
| 2.35416666666667 | 6.618 | 6.616 | 6.625 | 6.634 | 6.672 |
| 2.35555555555556 | 6.621 | 6.616 | 6.624 | 6.635 | 6.674 |
| 2.35694444444444 | 6.617 | 6.618 | 6.625 | 6.633 | 6.673 |
| 2.35833333333333 | 6.619 | 6.619 | 6.623 | 6.637 | 6.672 |
| 2.35972222222222 | 6.621 | 6.617 | 6.622 | 6.635 | 6.675 |
| 2.36111111111111 | 6.621 | 6.618 | 6.621 | 6.637 | 6.675 |
| 2.3625 | 6.622 | 6.619 | 6.619 | 6.637 | 6.675 |
| 2.36388888888889 | 6.623 | 6.62 | 6.624 | 6.637 | 6.675 |
| 2.36527777777778 | 6.621 | 6.62 | 6.619 | 6.64 | 6.672 |
| 2.36666666666667 | 6.621 | 6.615 | 6.615 | 6.638 | 6.674 |
| 2.36805555555556 | 6.62 | 6.617 | 6.617 | 6.637 | 6.67 |
| 2.36944444444444 | 6.613 | 6.612 | 6.617 | 6.638 | 6.672 |
| 2.37083333333333 | 6.617 | 6.611 | 6.617 | 6.64 | 6.676 |
| 2.37222222222222 | 6.615 | 6.613 | 6.616 | 6.64 | 6.668 |
| 2.37361111111111 | 6.616 | 6.606 | 6.617 | 6.641 | 6.671 |
| 2.375 | 6.615 | 6.609 | 6.617 | 6.638 | 6.674 |
| 2.37638888888889 | 6.615 | 6.614 | 6.615 | 6.638 | 6.673 |
| 2.37777777777778 | 6.614 | 6.612 | 6.615 | 6.64 | 6.674 |
| 2.37916666666667 | 6.616 | 6.613 | 6.616 | 6.64 | 6.67 |
| 2.38055555555556 | 6.617 | 6.615 | 6.616 | 6.639 | 6.672 |
| 2.38194444444444 | 6.617 | 6.612 | 6.619 | 6.639 | 6.673 |
| 2.38333333333333 | 6.617 | 6.614 | 6.617 | 6.641 | 6.672 |
| 2.38472222222222 | 6.62 | 6.613 | 6.618 | 6.641 | 6.674 |
| 2.38611111111111 | 6.619 | 6.611 | 6.617 | 6.64 | 6.673 |
| 2.3875 | 6.619 | 6.613 | 6.619 | 6.641 | 6.674 |
| 2.38888888888889 | 6.619 | 6.617 | 6.618 | 6.64 | 6.675 |
| 2.39027777777778 | 6.62 | 6.612 | 6.619 | 6.643 | 6.673 |
| 2.39166666666667 | 6.621 | 6.614 | 6.62 | 6.641 | 6.674 |
| 2.39305555555556 | 6.618 | 6.615 | 6.62 | 6.642 | 6.675 |
| 2.39444444444444 | 6.622 | 6.616 | 6.618 | 6.642 | 6.678 |
| 2.39583333333333 | 6.614 | 6.616 | 6.618 | 6.642 | 6.674 |
| 2.39722222222222 | 6.617 | 6.615 | 6.619 | 6.643 | 6.677 |
| 2.39861111111111 | 6.615 | 6.619 | 6.62 | 6.642 | 6.675 |
| 2.4 | 6.615 | 6.616 | 6.62 | 6.642 | 6.677 |
| 2.40138888888889 | 6.614 | 6.618 | 6.62 | 6.644 | 6.676 |
| 2.40277777777778 | 6.615 | 6.616 | 6.619 | 6.642 | 6.679 |
| 2.40416666666667 | 6.617 | 6.619 | 6.621 | 6.641 | 6.678 |
| 2.40555555555556 | 6.617 | 6.617 | 6.621 | 6.644 | 6.675 |
| 2.40694444444444 | 6.612 | 6.616 | 6.618 | 6.646 | 6.676 |
| 2.40833333333333 | 6.615 | 6.62 | 6.618 | 6.644 | 6.675 |
| 2.40972222222222 | 6.615 | 6.62 | 6.623 | 6.645 | 6.679 |
| 2.41111111111111 | 6.617 | 6.619 | 6.621 | 6.639 | 6.678 |
| 2.4125 | 6.616 | 6.619 | 6.624 | 6.642 | 6.677 |
| 2.41388888888889 | 6.616 | 6.616 | 6.62 | 6.643 | 6.676 |
| 2.41527777777778 | 6.614 | 6.616 | 6.622 | 6.641 | 6.679 |
| 2.41666666666667 | 6.615 | 6.619 | 6.621 | 6.638 | 6.679 |
| 2.41805555555556 | 6.616 | 6.622 | 6.62 | 6.635 | 6.681 |
| 2.41944444444444 | 6.615 | 6.622 | 6.62 | 6.631 | 6.676 |
| 2.42083333333333 | 6.617 | 6.622 | 6.624 | 6.638 | 6.679 |
| 2.42222222222222 | 6.615 | 6.621 | 6.622 | 6.633 | 6.677 |
| 2.42361111111111 | 6.617 | 6.617 | 6.622 | 6.635 | 6.678 |
| 2.425 | 6.616 | 6.622 | 6.623 | 6.634 | 6.677 |
| 2.42638888888889 | 6.615 | 6.621 | 6.619 | 6.634 | 6.68 |
| 2.42777777777778 | 6.618 | 6.621 | 6.621 | 6.636 | 6.681 |
| 2.42916666666667 | 6.616 | 6.616 | 6.622 | 6.635 | 6.679 |
| 2.43055555555556 | 6.617 | 6.62 | 6.618 | 6.638 | 6.679 |
| 2.43194444444444 | 6.618 | 6.615 | 6.619 | 6.64 | 6.679 |
| 2.43333333333333 | 6.618 | 6.617 | 6.615 | 6.638 | 6.674 |
| 2.43472222222222 | 6.621 | 6.614 | 6.617 | 6.638 | 6.671 |
| 2.43611111111111 | 6.62 | 6.613 | 6.614 | 6.64 | 6.668 |
| 2.4375 | 6.618 | 6.612 | 6.614 | 6.639 | 6.677 |
| 2.43888888888889 | 6.613 | 6.615 | 6.614 | 6.639 | 6.667 |
| 2.44027777777778 | 6.615 | 6.614 | 6.617 | 6.638 | 6.667 |
| 2.44166666666667 | 6.615 | 6.616 | 6.617 | 6.636 | 6.668 |
| 2.44305555555556 | 6.617 | 6.615 | 6.615 | 6.639 | 6.669 |
| 2.44444444444444 | 6.616 | 6.615 | 6.617 | 6.638 | 6.668 |
| 2.44583333333333 | 6.617 | 6.616 | 6.618 | 6.638 | 6.667 |
| 2.44722222222222 | 6.619 | 6.614 | 6.618 | 6.639 | 6.669 |
| 2.44861111111111 | 6.616 | 6.618 | 6.618 | 6.641 | 6.669 |
| 2.45 | 6.614 | 6.615 | 6.617 | 6.641 | 6.671 |
| 2.45138888888889 | 6.616 | 6.614 | 6.614 | 6.639 | 6.67 |
| 2.45277777777778 | 6.616 | 6.613 | 6.616 | 6.642 | 6.668 |
| 2.45416666666667 | 6.616 | 6.616 | 6.618 | 6.642 | 6.669 |
| 2.45555555555556 | 6.619 | 6.617 | 6.617 | 6.641 | 6.67 |
| 2.45694444444444 | 6.618 | 6.616 | 6.618 | 6.64 | 6.671 |
| 2.45833333333333 | 6.62 | 6.62 | 6.616 | 6.64 | 6.67 |
| 2.45972222222222 | 6.618 | 6.617 | 6.617 | 6.642 | 6.673 |
| 2.46111111111111 | 6.616 | 6.617 | 6.619 | 6.642 | 6.671 |
| 2.4625 | 6.62 | 6.616 | 6.619 | 6.643 | 6.673 |
| 2.46388888888889 | 6.618 | 6.619 | 6.619 | 6.642 | 6.67 |
| 2.46527777777778 | 6.62 | 6.619 | 6.62 | 6.64 | 6.673 |
| 2.46666666666667 | 6.621 | 6.62 | 6.62 | 6.641 | 6.675 |
| 2.46805555555556 | 6.621 | 6.616 | 6.619 | 6.644 | 6.675 |
| 2.46944444444444 | 6.617 | 6.617 | 6.616 | 6.641 | 6.67 |
| 2.47083333333333 | 6.619 | 6.615 | 6.619 | 6.642 | 6.673 |
| 2.47222222222222 | 6.615 | 6.619 | 6.621 | 6.641 | 6.674 |
| 2.47361111111111 | 6.615 | 6.615 | 6.621 | 6.641 | 6.674 |
| 2.475 | 6.613 | 6.618 | 6.617 | 6.639 | 6.674 |
| 2.47638888888889 | 6.614 | 6.619 | 6.62 | 6.637 | 6.671 |
| 2.47777777777778 | 6.613 | 6.619 | 6.619 | 6.64 | 6.675 |
| 2.47916666666667 | 6.615 | 6.619 | 6.621 | 6.635 | 6.675 |
| 2.48055555555556 | 6.614 | 6.618 | 6.621 | 6.636 | 6.674 |
| 2.48194444444444 | 6.619 | 6.619 | 6.621 | 6.636 | 6.674 |
| 2.48333333333333 | 6.617 | 6.619 | 6.621 | 6.635 | 6.673 |
| 2.48472222222222 | 6.618 | 6.62 | 6.621 | 6.636 | 6.676 |
| 2.48611111111111 | 6.619 | 6.62 | 6.625 | 6.635 | 6.674 |
| 2.4875 | 6.618 | 6.619 | 6.622 | 6.637 | 6.674 |
| 2.48888888888889 | 6.619 | 6.62 | 6.622 | 6.636 | 6.673 |
| 2.49027777777778 | 6.62 | 6.621 | 6.623 | 6.637 | 6.675 |
| 2.49166666666667 | 6.616 | 6.619 | 6.618 | 6.638 | 6.672 |
| 2.49305555555556 | 6.614 | 6.617 | 6.62 | 6.64 | 6.673 |
| 2.49444444444444 | 6.613 | 6.614 | 6.617 | 6.636 | 6.675 |
| 2.49583333333333 | 6.613 | 6.614 | 6.614 | 6.639 | 6.671 |
| 2.49722222222222 | 6.615 | 6.611 | 6.616 | 6.634 | 6.672 |
| 2.49861111111111 | 6.614 | 6.609 | 6.617 | 6.637 | 6.674 |
| 2.5 | 6.614 | 6.613 | 6.613 | 6.639 | 6.667 |
| 2.50138888888889 | 6.615 | 6.616 | 6.617 | 6.638 | 6.666 |
| 2.50277777777778 | 6.618 | 6.615 | 6.617 | 6.638 | 6.669 |
| 2.50416666666667 | 6.617 | 6.614 | 6.614 | 6.639 | 6.667 |
| 2.50555555555556 | 6.618 | 6.612 | 6.619 | 6.638 | 6.665 |
| 2.50694444444444 | 6.618 | 6.615 | 6.614 | 6.639 | 6.668 |
| 2.50833333333333 | 6.62 | 6.616 | 6.615 | 6.64 | 6.669 |
| 2.50972222222222 | 6.619 | 6.614 | 6.616 | 6.638 | 6.667 |
| 2.51111111111111 | 6.615 | 6.616 | 6.617 | 6.64 | 6.667 |
| 2.5125 | 6.617 | 6.616 | 6.619 | 6.641 | 6.669 |
| 2.51388888888889 | 6.618 | 6.614 | 6.616 | 6.64 | 6.672 |
| 2.51527777777778 | 6.619 | 6.617 | 6.618 | 6.642 | 6.667 |
| 2.51666666666667 | 6.618 | 6.616 | 6.616 | 6.642 | 6.671 |
| 2.51805555555556 | 6.62 | 6.616 | 6.617 | 6.64 | 6.672 |
| 2.51944444444444 | 6.62 | 6.617 | 6.618 | 6.641 | 6.67 |
| 2.52083333333333 | 6.62 | 6.616 | 6.617 | 6.641 | 6.671 |
| 2.52222222222222 | 6.619 | 6.618 | 6.618 | 6.643 | 6.672 |
| 2.52361111111111 | 6.621 | 6.618 | 6.619 | 6.64 | 6.672 |
| 2.525 | 6.619 | 6.617 | 6.619 | 6.642 | 6.672 |
| 2.52638888888889 | 6.619 | 6.616 | 6.619 | 6.641 | 6.671 |
| 2.52777777777778 | 6.621 | 6.616 | 6.618 | 6.642 | 6.67 |
| 2.52916666666667 | 6.619 | 6.615 | 6.621 | 6.642 | 6.67 |
| 2.53055555555556 | 6.621 | 6.619 | 6.619 | 6.641 | 6.671 |
| 2.53194444444444 | 6.618 | 6.618 | 6.62 | 6.641 | 6.671 |
| 2.53333333333333 | 6.618 | 6.621 | 6.62 | 6.643 | 6.671 |
| 2.53472222222222 | 6.62 | 6.618 | 6.621 | 6.642 | 6.673 |
| 2.53611111111111 | 6.617 | 6.62 | 6.621 | 6.645 | 6.676 |
| 2.5375 | 6.613 | 6.617 | 6.621 | 6.644 | 6.673 |
| 2.53888888888889 | 6.614 | 6.62 | 6.621 | 6.645 | 6.674 |
| 2.54027777777778 | 6.616 | 6.618 | 6.624 | 6.643 | 6.672 |
| 2.54166666666667 | 6.615 | 6.618 | 6.621 | 6.64 | 6.673 |
| 2.54305555555556 | 6.616 | 6.62 | 6.623 | 6.636 | 6.675 |
| 2.54444444444444 | 6.615 | 6.619 | 6.623 | 6.638 | 6.675 |
| 2.54583333333333 | 6.617 | 6.619 | 6.621 | 6.64 | 6.673 |
| 2.54722222222222 | 6.618 | 6.619 | 6.621 | 6.638 | 6.672 |
| 2.54861111111111 | 6.618 | 6.619 | 6.623 | 6.635 | 6.673 |
| 2.55 | 6.618 | 6.616 | 6.623 | 6.636 | 6.679 |
| 2.55138888888889 | 6.618 | 6.611 | 6.623 | 6.638 | 6.677 |
| 2.55277777777778 | 6.617 | 6.615 | 6.623 | 6.636 | 6.676 |
| 2.55416666666667 | 6.621 | 6.612 | 6.619 | 6.638 | 6.678 |
| 2.55555555555556 | 6.622 | 6.615 | 6.622 | 6.637 | 6.672 |
| 2.55694444444444 | 6.62 | 6.617 | 6.619 | 6.637 | 6.675 |
| 2.55833333333333 | 6.619 | 6.615 | 6.617 | 6.64 | 6.676 |
| 2.55972222222222 | 6.619 | 6.614 | 6.621 | 6.639 | 6.674 |
| 2.56111111111111 | 6.621 | 6.616 | 6.616 | 6.638 | 6.675 |
| 2.5625 | 6.617 | 6.611 | 6.617 | 6.638 | 6.677 |
| 2.56388888888889 | 6.621 | 6.615 | 6.617 | 6.637 | 6.676 |
| 2.56527777777778 | 6.618 | 6.615 | 6.614 | 6.639 | 6.673 |
| 2.56666666666667 | 6.622 | 6.616 | 6.616 | 6.639 | 6.674 |
| 2.56805555555556 | 6.622 | 6.616 | 6.617 | 6.638 | 6.669 |
| 2.56944444444444 | 6.619 | 6.614 | 6.614 | 6.639 | 6.667 |
| 2.57083333333333 | 6.619 | 6.615 | 6.618 | 6.64 | 6.669 |
| 2.57222222222222 | 6.619 | 6.613 | 6.619 | 6.639 | 6.674 |
| 2.57361111111111 | 6.617 | 6.613 | 6.619 | 6.64 | 6.667 |
| 2.575 | 6.615 | 6.617 | 6.618 | 6.64 | 6.668 |
| 2.57638888888889 | 6.613 | 6.617 | 6.62 | 6.64 | 6.668 |
| 2.57777777777778 | 6.614 | 6.616 | 6.616 | 6.641 | 6.665 |
| 2.57916666666667 | 6.615 | 6.615 | 6.619 | 6.641 | 6.667 |
| 2.58055555555556 | 6.615 | 6.618 | 6.615 | 6.64 | 6.669 |
| 2.58194444444444 | 6.617 | 6.619 | 6.62 | 6.643 | 6.668 |
| 2.58333333333333 | 6.617 | 6.62 | 6.619 | 6.639 | 6.669 |
| 2.58472222222222 | 6.616 | 6.617 | 6.621 | 6.641 | 6.67 |
| 2.58611111111111 | 6.616 | 6.619 | 6.623 | 6.64 | 6.671 |
| 2.5875 | 6.616 | 6.618 | 6.62 | 6.642 | 6.67 |
| 2.58888888888889 | 6.618 | 6.619 | 6.622 | 6.643 | 6.669 |
| 2.59027777777778 | 6.616 | 6.619 | 6.621 | 6.643 | 6.672 |
| 2.59166666666667 | 6.614 | 6.619 | 6.619 | 6.642 | 6.67 |
| 2.59305555555556 | 6.616 | 6.621 | 6.621 | 6.642 | 6.669 |
| 2.59444444444444 | 6.618 | 6.619 | 6.622 | 6.643 | 6.668 |
| 2.59583333333333 | 6.617 | 6.622 | 6.622 | 6.642 | 6.671 |
| 2.59722222222222 | 6.621 | 6.62 | 6.622 | 6.642 | 6.671 |
| 2.59861111111111 | 6.615 | 6.622 | 6.621 | 6.643 | 6.67 |
| 2.6 | 6.618 | 6.621 | 6.622 | 6.643 | 6.672 |
| 2.60138888888889 | 6.618 | 6.619 | 6.62 | 6.644 | 6.67 |
| 2.60277777777778 | 6.618 | 6.618 | 6.622 | 6.642 | 6.674 |
| 2.60416666666667 | 6.618 | 6.62 | 6.623 | 6.644 | 6.674 |
| 2.60555555555556 | 6.619 | 6.619 | 6.622 | 6.643 | 6.673 |
| 2.60694444444444 | 6.621 | 6.621 | 6.624 | 6.638 | 6.674 |
| 2.60833333333333 | 6.62 | 6.618 | 6.625 | 6.643 | 6.673 |
| 2.60972222222222 | 6.621 | 6.616 | 6.623 | 6.638 | 6.674 |
| 2.61111111111111 | 6.622 | 6.617 | 6.617 | 6.635 | 6.672 |
| 2.6125 | 6.617 | 6.614 | 6.623 | 6.637 | 6.672 |
| 2.61388888888889 | 6.621 | 6.612 | 6.618 | 6.636 | 6.675 |
| 2.61527777777778 | 6.616 | 6.611 | 6.614 | 6.636 | 6.672 |
| 2.61666666666667 | 6.614 | 6.612 | 6.618 | 6.636 | 6.675 |
| 2.61805555555556 | 6.616 | 6.613 | 6.619 | 6.637 | 6.674 |
| 2.61944444444444 | 6.615 | 6.613 | 6.615 | 6.636 | 6.674 |
| 2.62083333333333 | 6.615 | 6.612 | 6.617 | 6.638 | 6.675 |
| 2.62222222222222 | 6.615 | 6.611 | 6.617 | 6.637 | 6.674 |
| 2.62361111111111 | 6.616 | 6.612 | 6.618 | 6.638 | 6.676 |
| 2.625 | 6.616 | 6.612 | 6.617 | 6.637 | 6.676 |
| 2.62638888888889 | 6.617 | 6.618 | 6.618 | 6.638 | 6.675 |
| 2.62777777777778 | 6.615 | 6.614 | 6.621 | 6.641 | 6.674 |
| 2.62916666666667 | 6.617 | 6.616 | 6.617 | 6.637 | 6.676 |
| 2.63055555555556 | 6.616 | 6.615 | 6.619 | 6.64 | 6.671 |
| 2.63194444444444 | 6.616 | 6.617 | 6.62 | 6.638 | 6.672 |
| 2.63333333333333 | 6.617 | 6.619 | 6.621 | 6.64 | 6.672 |
| 2.63472222222222 | 6.619 | 6.616 | 6.62 | 6.64 | 6.668 |
| 2.63611111111111 | 6.618 | 6.614 | 6.621 | 6.637 | 6.668 |
| 2.6375 | 6.622 | 6.614 | 6.622 | 6.639 | 6.67 |
| 2.63888888888889 | 6.617 | 6.619 | 6.622 | 6.639 | 6.668 |
| 2.64027777777778 | 6.62 | 6.615 | 6.62 | 6.639 | 6.668 |
| 2.64166666666667 | 6.62 | 6.617 | 6.619 | 6.64 | 6.67 |
| 2.64305555555556 | 6.619 | 6.615 | 6.619 | 6.642 | 6.668 |
| 2.64444444444444 | 6.619 | 6.618 | 6.624 | 6.639 | 6.67 |
| 2.64583333333333 | 6.62 | 6.614 | 6.621 | 6.641 | 6.67 |
| 2.64722222222222 | 6.622 | 6.62 | 6.622 | 6.642 | 6.668 |
| 2.64861111111111 | 6.619 | 6.618 | 6.623 | 6.64 | 6.67 |
| 2.65 | 6.621 | 6.617 | 6.619 | 6.639 | 6.671 |
| 2.65138888888889 | 6.622 | 6.62 | 6.623 | 6.641 | 6.671 |
| 2.65277777777778 | 6.619 | 6.618 | 6.622 | 6.641 | 6.67 |
| 2.65416666666667 | 6.623 | 6.618 | 6.622 | 6.642 | 6.672 |
| 2.65555555555556 | 6.62 | 6.619 | 6.623 | 6.642 | 6.671 |
| 2.65694444444444 | 6.617 | 6.613 | 6.624 | 6.64 | 6.673 |
| 2.65833333333333 | 6.614 | 6.613 | 6.623 | 6.642 | 6.67 |
| 2.65972222222222 | 6.614 | 6.612 | 6.625 | 6.64 | 6.67 |
| 2.66111111111111 | 6.615 | 6.612 | 6.627 | 6.64 | 6.671 |
| 2.6625 | 6.615 | 6.612 | 6.625 | 6.643 | 6.67 |
| 2.66388888888889 | 6.614 | 6.613 | 6.625 | 6.643 | 6.674 |
| 2.66527777777778 | 6.615 | 6.615 | 6.623 | 6.642 | 6.672 |
| 2.66666666666667 | 6.614 | 6.613 | 6.621 | 6.642 | 6.674 |
| 2.66805555555556 | 6.618 | 6.614 | 6.619 | 6.645 | 6.673 |
| 2.66944444444444 | 6.618 | 6.611 | 6.619 | 6.642 | 6.678 |
| 2.67083333333333 | 6.616 | 6.613 | 6.618 | 6.642 | 6.673 |
| 2.67222222222222 | 6.619 | 6.614 | 6.617 | 6.645 | 6.673 |
| 2.67361111111111 | 6.616 | 6.617 | 6.618 | 6.639 | 6.67 |
| 2.675 | 6.617 | 6.616 | 6.618 | 6.637 | 6.673 |
| 2.67638888888889 | 6.616 | 6.613 | 6.618 | 6.635 | 6.674 |
| 2.67777777777778 | 6.617 | 6.618 | 6.618 | 6.638 | 6.675 |
| 2.67916666666667 | 6.617 | 6.615 | 6.619 | 6.637 | 6.677 |
| 2.68055555555556 | 6.618 | 6.616 | 6.622 | 6.637 | 6.676 |
| 2.68194444444444 | 6.618 | 6.616 | 6.62 | 6.637 | 6.675 |
| 2.68333333333333 | 6.619 | 6.616 | 6.619 | 6.639 | 6.675 |
| 2.68472222222222 | 6.616 | 6.619 | 6.616 | 6.638 | 6.676 |
| 2.68611111111111 | 6.617 | 6.615 | 6.619 | 6.635 | 6.677 |
| 2.6875 | 6.621 | 6.617 | 6.619 | 6.635 | 6.679 |
| 2.68888888888889 | 6.621 | 6.619 | 6.62 | 6.638 | 6.675 |
| 2.69027777777778 | 6.619 | 6.618 | 6.619 | 6.642 | 6.679 |
| 2.69166666666667 | 6.62 | 6.622 | 6.621 | 6.638 | 6.678 |
| 2.69305555555556 | 6.174 | 6.62 | 6.619 | 6.638 | 6.679 |
| 2.69444444444444 | 6.285 | 6.62 | 6.619 | 6.637 | 6.677 |
| 2.69583333333333 | 6.62 | 6.622 | 6.621 | 6.639 | 6.678 |
| 2.69722222222222 | 6.434 | 6.621 | 6.621 | 6.64 | 6.672 |
| 2.69861111111111 | 6.401 | 6.621 | 6.622 | 6.639 | 6.677 |
| 2.7 | 6.399 | 6.62 | 6.622 | 6.639 | 6.672 |
| 2.70138888888889 | 6.512 | 6.621 | 6.621 | 6.64 | 6.67 |
| 2.70277777777778 | 6.067 | 6.621 | 6.623 | 6.641 | 6.669 |
| 2.70416666666667 | 6.289 | 6.614 | 6.621 | 6.642 | 6.67 |
| 2.70555555555556 | 6.264 | 6.613 | 6.622 | 6.641 | 6.666 |
| 2.70694444444444 | 6.286 | 6.613 | 6.622 | 6.641 | 6.667 |
| 2.70833333333333 | 6.176 | 6.613 | 6.622 | 6.64 | 6.669 |
| 2.70972222222222 | 6.076 | 6.615 | 6.624 | 6.641 | 6.669 |
| 2.71111111111111 | 6.29 | 6.615 | 6.622 | 6.642 | 6.67 |
| 2.7125 | 5.963 | 6.616 | 6.622 | 6.643 | 6.67 |
| 2.71388888888889 | 6.177 | 6.614 | 6.615 | 6.642 | 6.668 |
| 2.71527777777778 | 5.844 | 6.616 | 6.616 | 6.64 | 6.673 |
| 2.71666666666667 | 5.961 | 6.615 | 6.617 | 6.644 | 6.672 |
| 2.71805555555556 | 6.184 | 6.617 | 6.616 | 6.643 | 6.67 |
| 2.71944444444444 | 5.737 | 6.617 | 6.618 | 6.642 | 6.673 |
| 2.72083333333333 | 6.176 | 6.616 | 6.616 | 6.643 | 6.674 |
| 2.72222222222222 | 6.068 | 6.619 | 6.616 | 6.644 | 6.674 |
| 2.72361111111111 | 6.003 | 6.616 | 6.618 | 6.645 | 6.671 |
| 2.725 | 6.013 | 6.619 | 6.62 | 6.644 | 6.672 |
| 2.72638888888889 | 5.964 | 6.616 | 6.619 | 6.643 | 6.672 |
| 2.72777777777778 | 5.961 | 6.617 | 6.62 | 6.644 | 6.672 |
| 2.72916666666667 | 5.847 | 6.617 | 6.621 | 6.642 | 6.673 |
| 2.73055555555556 | 5.962 | 6.616 | 6.621 | 6.642 | 6.673 |
| 2.73194444444444 | 5.846 | 6.618 | 6.62 | 6.642 | 6.673 |
| 2.73333333333333 | 5.848 | 6.62 | 6.621 | 6.636 | 6.674 |
| 2.73472222222222 | 5.741 | 6.621 | 6.622 | 6.637 | 6.675 |
| 2.73611111111111 | 5.63 | 6.623 | 6.619 | 6.64 | 6.675 |
| 2.7375 | 5.522 | 6.622 | 6.621 | 6.634 | 6.674 |
| 2.73888888888889 | 5.965 | 6.622 | 6.619 | 6.637 | 6.675 |
| 2.74027777777778 | 5.849 | 6.62 | 6.623 | 6.634 | 6.676 |
| 2.74166666666667 | 5.743 | 6.618 | 6.62 | 6.639 | 6.673 |
| 2.74305555555556 | 5.742 | 6.612 | 6.621 | 6.637 | 6.673 |
| 2.74444444444444 | 5.848 | 6.616 | 6.62 | 6.64 | 6.674 |
| 2.74583333333333 | 5.852 | 6.614 | 6.623 | 6.637 | 6.674 |
| 2.74722222222222 | 5.744 | 6.615 | 6.622 | 6.637 | 6.677 |
| 2.74861111111111 | 5.85 | 6.613 | 6.623 | 6.64 | 6.674 |
| 2.75 | 5.632 | 6.612 | 6.623 | 6.639 | 6.675 |
| 2.75138888888889 | 5.637 | 6.614 | 6.623 | 6.639 | 6.678 |
| 2.75277777777778 | 5.521 | 6.615 | 6.621 | 6.639 | 6.675 |
| 2.75416666666667 | 5.632 | 6.614 | 6.619 | 6.635 | 6.672 |
| 2.75555555555556 | 5.739 | 6.615 | 6.621 | 6.641 | 6.676 |
| 2.75694444444444 | 5.633 | 6.614 | 6.615 | 6.642 | 6.674 |
| 2.75833333333333 | 5.18 | 6.615 | 6.618 | 6.639 | 6.674 |
| 2.75972222222222 | 5.364 | 6.616 | 6.62 | 6.639 | 6.669 |
| 2.76111111111111 | 5.415 | 6.616 | 6.615 | 6.642 | 6.669 |
| 2.7625 | 5.527 | 6.617 | 6.617 | 6.641 | 6.671 |
| 2.76388888888889 | 5.525 | 6.619 | 6.619 | 6.642 | 6.668 |
| 2.76527777777778 | 5.553 | 6.618 | 6.618 | 6.638 | 6.672 |
| 2.76666666666667 | 5.414 | 6.616 | 6.62 | 6.64 | 6.671 |
| 2.76805555555556 | 5.304 | 6.616 | 6.62 | 6.64 | 6.671 |
| 2.76944444444444 | 5.413 | 6.62 | 6.622 | 6.642 | 6.668 |
| 2.77083333333333 | 5.197 | 6.617 | 6.621 | 6.642 | 6.67 |
| 2.77222222222222 | 5.307 | 6.622 | 6.622 | 6.643 | 6.672 |
| 2.77361111111111 | 5.196 | 6.619 | 6.622 | 6.643 | 6.669 |
| 2.775 | 5.414 | 6.619 | 6.621 | 6.642 | 6.672 |
| 2.77638888888889 | 5.305 | 6.623 | 6.623 | 6.642 | 6.671 |
| 2.77777777777778 | 5.307 | 6.621 | 6.621 | 6.642 | 6.673 |
| 2.77916666666667 | 4.875 | 6.619 | 6.623 | 6.641 | 6.672 |
| 2.78055555555556 | 4.872 | 6.62 | 6.62 | 6.643 | 6.673 |
| 2.78194444444444 | 5.305 | 6.614 | 6.621 | 6.642 | 6.671 |
| 2.78333333333333 | 5.308 | 6.611 | 6.622 | 6.644 | 6.674 |
| 2.78472222222222 | 5.197 | 6.619 | 6.624 | 6.642 | 6.672 |
| 2.78611111111111 | 5.089 | 6.612 | 6.624 | 6.642 | 6.672 |
| 2.7875 | 5.09 | 6.617 | 6.624 | 6.645 | 6.671 |
| 2.78888888888889 | 5.197 | 6.614 | 6.622 | 6.637 | 6.671 |
| 2.79027777777778 | 5.198 | 6.614 | 6.621 | 6.639 | 6.673 |
| 2.79166666666667 | 5.199 | 6.614 | 6.619 | 6.636 | 6.672 |
| 2.79305555555556 | 5.197 | 6.615 | 6.618 | 6.639 | 6.675 |
| 2.79444444444444 | 5.211 | 6.617 | 6.617 | 6.639 | 6.672 |
| 2.79583333333333 | 5.198 | 6.619 | 6.617 | 6.638 | 6.676 |
| 2.79722222222222 | 5.075 | 6.617 | 6.617 | 6.638 | 6.673 |
| 2.79861111111111 | 5.091 | 6.619 | 6.62 | 6.639 | 6.675 |
| 2.8 | 5.194 | 6.619 | 6.619 | 6.637 | 6.674 |
| 2.80138888888889 | 4.772 | 6.621 | 6.62 | 6.636 | 6.675 |
| 2.80277777777778 | 4.982 | 6.624 | 6.62 | 6.638 | 6.675 |
| 2.80416666666667 | 5.09 | 6.619 | 6.619 | 6.64 | 6.676 |
| 2.80555555555556 | 5.192 | 6.622 | 6.617 | 6.637 | 6.679 |
| 2.80694444444444 | 4.876 | 6.621 | 6.621 | 6.637 | 6.678 |
| 2.80833333333333 | 4.983 | 6.621 | 6.621 | 6.639 | 6.67 |
| 2.80972222222222 | 4.773 | 6.622 | 6.62 | 6.639 | 6.675 |
| 2.81111111111111 | 4.985 | 6.621 | 6.621 | 6.638 | 6.667 |
| 2.8125 | 5.092 | 6.62 | 6.62 | 6.639 | 6.672 |
| 2.81388888888889 | 5.134 | 6.624 | 6.622 | 6.64 | 6.665 |
| 2.81527777777778 | 5.085 | 6.623 | 6.624 | 6.64 | 6.672 |
| 2.81666666666667 | 5.084 | 6.621 | 6.621 | 6.637 | 6.669 |
| 2.81805555555556 | 4.554 | 6.618 | 6.624 | 6.644 | 6.67 |
| 2.81944444444444 | 4.657 | 6.613 | 6.621 | 6.64 | 6.669 |
| 2.82083333333333 | 4.657 | 6.615 | 6.624 | 6.643 | 6.67 |
| 2.82222222222222 | 4.8 | 6.612 | 6.622 | 6.641 | 6.675 |
| 2.82361111111111 | 4.875 | 6.615 | 6.623 | 6.643 | 6.671 |
| 2.825 | 4.876 | 6.617 | 6.626 | 6.643 | 6.671 |
| 2.82638888888889 | 4.66 | 6.616 | 6.622 | 6.645 | 6.672 |
| 2.82777777777778 | 4.66 | 6.617 | 6.621 | 6.645 | 6.672 |
| 2.82916666666667 | 4.657 | 6.616 | 6.619 | 6.645 | 6.67 |
| 2.83055555555556 | 4.659 | 6.619 | 6.617 | 6.646 | 6.671 |
| 2.83194444444444 | 4.657 | 6.618 | 6.618 | 6.647 | 6.672 |
| 2.83333333333333 | 4.443 | 6.617 | 6.617 | 6.646 | 6.673 |
| 2.83472222222222 | 4.555 | 6.619 | 6.618 | 6.643 | 6.673 |
| 2.83611111111111 | 4.657 | 6.618 | 6.619 | 6.641 | 6.675 |
| 2.8375 | 4.658 | 6.618 | 6.616 | 6.638 | 6.674 |
| 2.83888888888889 | 4.66 | 6.619 | 6.619 | 6.639 | 6.673 |
| 2.84027777777778 | 4.554 | 6.619 | 6.62 | 6.638 | 6.676 |
| 2.84166666666667 | 4.66 | 6.619 | 6.62 | 6.64 | 6.676 |
| 2.84305555555556 | 4.445 | 6.618 | 6.619 | 6.637 | 6.675 |
| 2.84444444444444 | 4.337 | 6.62 | 6.62 | 6.636 | 6.675 |
| 2.84583333333333 | 4.444 | 6.621 | 6.619 | 6.64 | 6.673 |
| 2.84722222222222 | 4.444 | 6.62 | 6.619 | 6.641 | 6.675 |
| 2.84861111111111 | 4.555 | 6.621 | 6.619 | 6.639 | 6.673 |
| 2.85 | 4.653 | 6.621 | 6.622 | 6.64 | 6.676 |
| 2.85138888888889 | 4.578 | 6.621 | 6.622 | 6.642 | 6.666 |
| 2.85277777777778 | 4.656 | 6.623 | 6.622 | 6.641 | 6.667 |
| 2.85416666666667 | 4.654 | 6.619 | 6.622 | 6.641 | 6.668 |
| 2.85555555555556 | 4.117 | 6.622 | 6.623 | 6.64 | 6.668 |
| 2.85694444444444 | 4.447 | 6.621 | 6.622 | 6.643 | 6.669 |
| 2.85833333333333 | 4.444 | 6.619 | 6.622 | 6.641 | 6.67 |
| 2.85972222222222 | 4.545 | 6.617 | 6.622 | 6.641 | 6.672 |
| 2.86111111111111 | 4.552 | 6.614 | 6.622 | 6.641 | 6.671 |
| 2.8625 | 4.549 | 6.617 | 6.622 | 6.642 | 6.669 |
| 2.86388888888889 | 4.226 | 6.615 | 6.623 | 6.641 | 6.672 |
| 2.86527777777778 | 4.421 | 6.614 | 6.617 | 6.645 | 6.672 |
| 2.86666666666667 | 4.443 | 6.617 | 6.618 | 6.64 | 6.672 |
| 2.86805555555556 | 4.547 | 6.614 | 6.619 | 6.645 | 6.674 |
| 2.86944444444444 | 4.441 | 6.617 | 6.616 | 6.643 | 6.672 |
| 2.87083333333333 | 4.44 | 6.615 | 6.618 | 6.644 | 6.673 |
| 2.87222222222222 | 4.442 | 6.617 | 6.617 | 6.647 | 6.674 |
| 2.87361111111111 | 4.442 | 6.616 | 6.619 | 6.645 | 6.675 |
| 2.875 | 4.441 | 6.619 | 6.621 | 6.647 | 6.674 |
| 2.87638888888889 | 4.442 | 6.62 | 6.62 | 6.643 | 6.673 |
| 2.87777777777778 | 4.326 | 6.617 | 6.619 | 6.64 | 6.675 |
| 2.87916666666667 | 4.442 | 6.617 | 6.62 | 6.636 | 6.673 |
| 2.88055555555556 | 4.334 | 6.618 | 6.62 | 6.638 | 6.677 |
| 2.88194444444444 | 4.335 | 6.617 | 6.621 | 6.638 | 6.672 |
| 2.88333333333333 | 4.333 | 6.622 | 6.619 | 6.638 | 6.675 |
| 2.88472222222222 | 4.442 | 6.62 | 6.622 | 6.638 | 6.673 |
| 2.88611111111111 | 4.115 | 6.62 | 6.621 | 6.637 | 6.674 |
| 2.8875 | 4.226 | 6.616 | 6.62 | 6.637 | 6.677 |
| 2.88888888888889 | 4.044 | 6.619 | 6.622 | 6.637 | 6.672 |
| 2.89027777777778 | 4.327 | 6.618 | 6.624 | 6.641 | 6.669 |
| 2.89166666666667 | 4.336 | 6.618 | 6.624 | 6.641 | 6.671 |
| 2.89305555555556 | 4.225 | 6.623 | 6.625 | 6.64 | 6.668 |
| 2.89444444444444 | 4.443 | 6.622 | 6.625 | 6.638 | 6.671 |
| 2.89583333333333 | 4.444 | 6.623 | 6.624 | 6.64 | 6.669 |
| 2.89722222222222 | 4.223 | 6.618 | 6.625 | 6.639 | 6.672 |
| 2.89861111111111 | 4.226 | 6.619 | 6.624 | 6.642 | 6.671 |
| 2.9 | 4.224 | 6.616 | 6.626 | 6.643 | 6.67 |
| 2.90138888888889 | 4.244 | 6.615 | 6.623 | 6.641 | 6.672 |
| 2.90277777777778 | 4.127 | 6.613 | 6.619 | 6.643 | 6.671 |
| 2.90416666666667 | 4.176 | 6.615 | 6.616 | 6.641 | 6.669 |
| 2.90555555555556 | 4.225 | 6.616 | 6.619 | 6.642 | 6.674 |
| 2.90694444444444 | 3.901 | 6.615 | 6.618 | 6.643 | 6.672 |
| 2.90833333333333 | 4.084 | 6.614 | 6.618 | 6.643 | 6.673 |
| 2.90972222222222 | 4.113 | 6.617 | 6.619 | 6.639 | 6.673 |
| 2.91111111111111 | 4.007 | 6.618 | 6.618 | 6.635 | 6.675 |
| 2.9125 | 4.073 | 6.616 | 6.62 | 6.635 | 6.674 |
| 2.91388888888889 | 4.337 | 6.618 | 6.62 | 6.638 | 6.675 |
| 2.91527777777778 | 4.115 | 6.618 | 6.622 | 6.637 | 6.676 |
| 2.91666666666667 | 4.114 | 6.615 | 6.62 | 6.639 | 6.677 |
| 2.91805555555556 | 4.103 | 6.614 | 6.622 | 6.637 | 6.674 |
| 2.91944444444444 | 4.114 | 6.618 | 6.621 | 6.635 | 6.674 |
| 2.92083333333333 | 4.005 | 6.616 | 6.621 | 6.64 | 6.672 |
| 2.92222222222222 | 4.005 | 6.614 | 6.622 | 6.638 | 6.671 |
| 2.92361111111111 | 4.116 | 6.613 | 6.621 | 6.64 | 6.67 |
| 2.925 | 3.794 | 6.618 | 6.621 | 6.639 | 6.67 |
| 2.92638888888889 | 3.79 | 6.618 | 6.622 | 6.639 | 6.671 |
| 2.92777777777778 | 3.901 | 6.613 | 6.622 | 6.642 | 6.67 |
| 2.92916666666667 | 3.684 | 6.618 | 6.625 | 6.643 | 6.67 |
| 2.93055555555556 | 4.113 | 6.618 | 6.623 | 6.64 | 6.67 |
| 2.93194444444444 | 4.006 | 6.618 | 6.624 | 6.642 | 6.673 |
| 2.93333333333333 | 4.006 | 6.618 | 6.623 | 6.644 | 6.672 |
| 2.93472222222222 | 4.006 | 6.615 | 6.622 | 6.646 | 6.671 |
| 2.93611111111111 | 4.007 | 6.622 | 6.622 | 6.641 | 6.674 |
| 2.9375 | 3.903 | 6.618 | 6.622 | 6.645 | 6.674 |
| 2.93888888888889 | 3.905 | 6.619 | 6.62 | 6.645 | 6.675 |
| 2.94027777777778 | 4.011 | 6.619 | 6.625 | 6.641 | 6.676 |
| 2.94166666666667 | 3.904 | 6.619 | 6.621 | 6.636 | 6.674 |
| 2.94305555555556 | 4.01 | 6.618 | 6.616 | 6.636 | 6.675 |
| 2.94444444444444 | 3.893 | 6.617 | 6.618 | 6.635 | 6.676 |
| 2.94583333333333 | 3.686 | 6.617 | 6.616 | 6.639 | 6.677 |
| 2.94722222222222 | 3.789 | 6.615 | 6.619 | 6.636 | 6.676 |
| 2.94861111111111 | 3.904 | 6.611 | 6.618 | 6.639 | 6.673 |
| 2.95 | 3.573 | 6.616 | 6.621 | 6.64 | 6.675 |
| 2.95138888888889 | 3.79 | 6.508 | 6.62 | 6.64 | 6.674 |
| 2.95277777777778 | 3.688 | 6.611 | 6.62 | 6.64 | 6.671 |
| 2.95416666666667 | 3.899 | 6.506 | 6.621 | 6.64 | 6.67 |
| 2.95555555555556 | 3.9 | 6.392 | 6.62 | 6.639 | 6.669 |
| 2.95694444444444 | 3.792 | 6.284 | 6.619 | 6.64 | 6.668 |
| 2.95833333333333 | 3.902 | 6.172 | 6.623 | 6.641 | 6.672 |
| 2.95972222222222 | 3.687 | 6.36 | 6.619 | 6.639 | 6.667 |
| 2.96111111111111 | 3.685 | 6.395 | 6.621 | 6.641 | 6.671 |
| 2.9625 | 3.791 | 6.283 | 6.621 | 6.642 | 6.668 |
| 2.96388888888889 | 3.792 | 6.283 | 6.62 | 6.641 | 6.67 |
| 2.96527777777778 | 3.688 | 6.167 | 6.621 | 6.642 | 6.671 |
| 2.96666666666667 | 3.687 | 6.285 | 6.62 | 6.643 | 6.67 |
| 2.96805555555556 | 3.903 | 6.166 | 6.622 | 6.646 | 6.673 |
| 2.96944444444444 | 3.79 | 5.849 | 6.622 | 6.645 | 6.672 |
| 2.97083333333333 | 3.472 | 5.548 | 6.62 | 6.645 | 6.673 |
| 2.97222222222222 | 3.159 | 5.951 | 6.621 | 6.642 | 6.674 |
| 2.97361111111111 | 3.05 | 5.738 | 6.619 | 6.637 | 6.674 |
| 2.975 | 3.263 | 6.169 | 6.621 | 6.635 | 6.673 |
| 2.97638888888889 | 3.366 | 5.85 | 6.621 | 6.638 | 6.672 |
| 2.97777777777778 | 3.9 | 5.954 | 6.622 | 6.636 | 6.672 |
| 2.97916666666667 | 3.687 | 5.953 | 6.624 | 6.635 | 6.674 |
| 2.98055555555556 | 3.686 | 5.845 | 6.624 | 6.639 | 6.674 |
| 2.98194444444444 | 3.572 | 6.065 | 6.622 | 6.636 | 6.676 |
| 2.98333333333333 | 3.499 | 6.003 | 6.623 | 6.637 | 6.672 |
| 2.98472222222222 | 3.686 | 5.839 | 6.622 | 6.638 | 6.67 |
| 2.98611111111111 | 3.574 | 5.627 | 6.624 | 6.64 | 6.669 |
| 2.9875 | 3.471 | 5.797 | 6.622 | 6.637 | 6.669 |
| 2.98888888888889 | 3.474 | 5.624 | 6.627 | 6.638 | 6.668 |
| 2.99027777777778 | 3.471 | 5.304 | 6.623 | 6.641 | 6.671 |
| 2.99166666666667 | 3.472 | 5.412 | 6.622 | 6.64 | 6.67 |
| 2.99305555555556 | 3.098 | 5.555 | 6.619 | 6.639 | 6.67 |
| 2.99444444444444 | 3.186 | 5.299 | 6.623 | 6.641 | 6.672 |
| 2.99583333333333 | 3.369 | 5.52 | 6.616 | 6.639 | 6.669 |
| 2.99722222222222 | 3.155 | 5.626 | 6.617 | 6.639 | 6.67 |
| 2.99861111111111 | 3.259 | 5.518 | 6.621 | 6.642 | 6.671 |
| 3.0 | 3.366 | 5.515 | 6.617 | 6.646 | 6.672 |
| 3.00138888888889 | 3.473 | 5.625 | 6.616 | 6.643 | 6.671 |
| 3.00277777777778 | 3.369 | 5.404 | 6.616 | 6.645 | 6.675 |
| 3.00416666666667 | 3.368 | 5.195 | 6.617 | 6.644 | 6.67 |
| 3.00555555555556 | 3.37 | 5.239 | 6.617 | 6.645 | 6.671 |
| 3.00694444444444 | 3.37 | 5.74 | 6.621 | 6.645 | 6.673 |
| 3.00833333333333 | 3.366 | 5.743 | 6.622 | 6.643 | 6.673 |
| 3.00972222222222 | 3.368 | 5.192 | 6.622 | 6.644 | 6.674 |
| 3.01111111111111 | 3.472 | 4.871 | 6.62 | 6.646 | 6.673 |
| 3.0125 | 3.368 | 4.765 | 6.51 | 6.638 | 6.675 |
| 3.01388888888889 | 3.26 | 4.549 | 6.62 | 6.637 | 6.673 |
| 3.01527777777778 | 3.044 | 4.65 | 6.511 | 6.636 | 6.675 |
| 3.01666666666667 | 3.354 | 4.871 | 6.398 | 6.636 | 6.676 |
| 3.01805555555556 | 3.475 | 5.191 | 6.29 | 6.635 | 6.676 |
| 3.01944444444444 | 3.368 | 5.515 | 6.289 | 6.635 | 6.678 |
| 3.02083333333333 | 3.258 | 5.2 | 6.172 | 6.633 | 6.677 |
| 3.02222222222222 | 3.421 | 5.21 | 6.291 | 6.638 | 6.675 |
| 3.02361111111111 | 3.368 | 5.298 | 6.402 | 6.636 | 6.678 |
| 3.025 | 3.368 | 5.085 | 6.179 | 6.639 | 6.673 |
| 3.02638888888889 | 3.369 | 4.981 | 6.292 | 6.639 | 6.672 |
| 3.02777777777778 | 2.976 | 4.981 | 6.175 | 6.638 | 6.672 |
| 3.02916666666667 | 3.261 | 4.87 | 5.841 | 6.64 | 6.671 |
| 3.03055555555556 | 3.371 | 4.766 | 5.893 | 6.643 | 6.667 |
| 3.03194444444444 | 3.37 | 5.19 | 6.172 | 6.639 | 6.669 |
| 3.03333333333333 | 3.371 | 4.976 | 6.291 | 6.642 | 6.67 |
| 3.03472222222222 | 3.262 | 4.655 | 6.173 | 6.639 | 6.667 |
| 3.03611111111111 | 2.84 | 4.764 | 5.956 | 6.642 | 6.669 |
| 3.0375 | 2.734 | 4.87 | 5.516 | 6.641 | 6.67 |
| 3.03888888888889 | 2.522 | 5.078 | 5.519 | 6.641 | 6.67 |
| 3.04027777777778 | 2.628 | 4.975 | 5.74 | 6.64 | 6.672 |
| 3.04166666666667 | 2.518 | 4.978 | 5.799 | 6.642 | 6.671 |
| 3.04305555555556 | 2.629 | 4.975 | 5.745 | 6.641 | 6.672 |
| 3.04444444444444 | 2.734 | 4.872 | 5.742 | 6.643 | 6.673 |
| 3.04583333333333 | 2.94 | 4.98 | 5.742 | 6.644 | 6.671 |
| 3.04722222222222 | 3.474 | 4.867 | 5.742 | 6.642 | 6.674 |
| 3.04861111111111 | 3.37 | 4.87 | 5.641 | 6.643 | 6.673 |
| 3.05 | 3.3 | 4.439 | 5.52 | 6.642 | 6.672 |
| 3.05138888888889 | 3.37 | 4.659 | 5.523 | 6.643 | 6.673 |
| 3.05277777777778 | 3.369 | 4.554 | 5.409 | 6.642 | 6.671 |
| 3.05416666666667 | 3.155 | 4.553 | 5.302 | 6.641 | 6.671 |
| 3.05555555555556 | 3.261 | 4.551 | 5.332 | 6.641 | 6.671 |
| 3.05694444444444 | 3.061 | 4.552 | 5.303 | 6.639 | 6.67 |
| 3.05833333333333 | 2.732 | 4.554 | 5.086 | 6.634 | 6.673 |
| 3.05972222222222 | 2.637 | 4.551 | 5.193 | 6.634 | 6.675 |
| 3.06111111111111 | 2.521 | 4.439 | 5.409 | 6.635 | 6.675 |
| 3.0625 | 2.628 | 4.368 | 5.63 | 6.636 | 6.675 |
| 3.06388888888889 | 2.629 | 4.439 | 5.524 | 6.636 | 6.675 |
| 3.06527777777778 | 2.631 | 4.442 | 5.522 | 6.638 | 6.675 |
| 3.06666666666667 | 2.523 | 4.759 | 5.628 | 6.635 | 6.675 |
| 3.06805555555556 | 2.523 | 4.762 | 5.303 | 6.639 | 6.677 |
| 3.06944444444444 | 2.211 | 4.557 | 5.302 | 6.637 | 6.677 |
| 3.07083333333333 | 2.733 | 4.554 | 5.304 | 6.638 | 6.675 |
| 3.07222222222222 | 3.221 | 4.554 | 5.303 | 6.637 | 6.677 |
| 3.07361111111111 | 3.476 | 4.335 | 5.087 | 6.635 | 6.672 |
| 3.075 | 3.371 | 4.44 | 5.091 | 6.643 | 6.674 |
| 3.07638888888889 | 3.158 | 4.441 | 5.087 | 6.639 | 6.676 |
| 3.07777777777778 | 3.157 | 4.651 | 5.084 | 6.641 | 6.67 |
| 3.07916666666667 | 2.628 | 4.441 | 4.763 | 6.64 | 6.669 |
| 3.08055555555556 | 2.523 | 4.443 | 4.977 | 6.638 | 6.667 |
| 3.08194444444444 | 2.42 | 4.441 | 5.086 | 6.638 | 6.669 |
| 3.08333333333333 | 2.52 | 4.441 | 5.084 | 6.64 | 6.67 |
| 3.08472222222222 | 2.634 | 4.443 | 4.965 | 6.64 | 6.668 |
| 3.08611111111111 | 3.161 | 4.438 | 4.871 | 6.639 | 6.669 |
| 3.0875 | 3.261 | 4.484 | 5.084 | 6.643 | 6.669 |
| 3.08888888888889 | 3.364 | 4.224 | 5.086 | 6.64 | 6.669 |
| 3.09027777777778 | 2.624 | 4.54 | 5.087 | 6.642 | 6.67 |
| 3.09166666666667 | 2.52 | 4.44 | 5.087 | 6.643 | 6.67 |
| 3.09305555555556 | 2.521 | 4.439 | 5.086 | 6.642 | 6.67 |
| 3.09444444444444 | 2.521 | 4.437 | 4.884 | 6.646 | 6.671 |
| 3.09583333333333 | 2.421 | 4.438 | 4.655 | 6.643 | 6.674 |
| 3.09722222222222 | 2.522 | 4.44 | 4.632 | 6.646 | 6.673 |
| 3.09861111111111 | 2.523 | 4.437 | 4.336 | 6.643 | 6.673 |
| 3.1 | 2.316 | 4.112 | 4.548 | 6.643 | 6.673 |
| 3.10138888888889 | 2.714 | 4.328 | 4.654 | 6.646 | 6.673 |
| 3.10277777777778 | 2.943 | 4.331 | 4.761 | 6.644 | 6.671 |
| 3.10416666666667 | 3.261 | 4.442 | 4.762 | 6.643 | 6.672 |
| 3.10555555555556 | 3.155 | 4.442 | 4.68 | 6.644 | 6.672 |
| 3.10694444444444 | 3.219 | 4.329 | 4.441 | 6.64 | 6.673 |
| 3.10833333333333 | 2.739 | 4.328 | 4.548 | 6.645 | 6.672 |
| 3.10972222222222 | 2.734 | 4.052 | 4.652 | 6.648 | 6.672 |
| 3.11111111111111 | 2.521 | 4.222 | 4.656 | 6.644 | 6.673 |
| 3.1125 | 2.523 | 4.33 | 4.654 | 6.64 | 6.675 |
| 3.11388888888889 | 2.316 | 4.438 | 4.763 | 6.639 | 6.675 |
| 3.11527777777778 | 2.21 | 4.44 | 4.655 | 6.634 | 6.673 |
| 3.11666666666667 | 2.421 | 4.439 | 4.653 | 6.635 | 6.677 |
| 3.11805555555556 | 2.733 | 4.331 | 4.339 | 6.635 | 6.675 |
| 3.11944444444444 | 3.239 | 4.34 | 4.439 | 6.637 | 6.674 |
| 3.12083333333333 | 3.109 | 4.003 | 4.439 | 6.636 | 6.675 |
| 3.12222222222222 | 2.421 | 4.202 | 4.549 | 6.639 | 6.676 |
| 3.12361111111111 | 2.521 | 4.004 | 4.655 | 6.636 | 6.676 |
| 3.125 | 2.626 | 3.934 | 4.654 | 6.636 | 6.677 |
| 3.12638888888889 | 2.522 | 4.003 | 4.655 | 6.638 | 6.677 |
| 3.12777777777778 | 2.507 | 3.897 | 4.427 | 6.637 | 6.674 |
| 3.12916666666667 | 2.627 | 3.367 | 4.546 | 6.64 | 6.674 |
| 3.13055555555556 | 2.42 | 3.367 | 4.656 | 6.637 | 6.675 |
| 3.13194444444444 | 2.314 | 3.469 | 4.763 | 6.639 | 6.676 |
| 3.13333333333333 | 2.313 | 3.792 | 4.548 | 6.638 | 6.672 |
| 3.13472222222222 | 2.213 | 4.112 | 4.336 | 6.637 | 6.669 |
| 3.13611111111111 | 2.213 | 3.999 | 4.439 | 6.637 | 6.675 |
| 3.1375 | 2.313 | 4.003 | 4.441 | 6.64 | 6.669 |
| 3.13888888888889 | 2.522 | 4.006 | 3.902 | 6.641 | 6.666 |
| 3.14027777777778 | 2.731 | 3.898 | 4.005 | 6.64 | 6.667 |
| 3.14166666666667 | 2.628 | 3.899 | 4.113 | 6.642 | 6.669 |
| 3.14305555555556 | 2.314 | 3.574 | 4.111 | 6.639 | 6.671 |
| 3.14444444444444 | 2.211 | 3.9 | 4.222 | 6.643 | 6.669 |
| 3.14583333333333 | 2.212 | 4.112 | 4.545 | 6.641 | 6.669 |
| 3.14722222222222 | 2.211 | 3.9 | 4.515 | 6.642 | 6.67 |
| 3.14861111111111 | 2.524 | 3.57 | 4.223 | 6.644 | 6.674 |
| 3.15 | 2.942 | 3.369 | 4.441 | 6.642 | 6.673 |
| 3.15138888888889 | 2.766 | 3.258 | 4.173 | 6.642 | 6.673 |
| 3.15277777777778 | 2.731 | 3.259 | 4.442 | 6.639 | 6.67 |
| 3.15416666666667 | 2.732 | 3.156 | 4.119 | 6.643 | 6.67 |
| 3.15555555555556 | 2.627 | 3.579 | 4.418 | 6.643 | 6.667 |
| 3.15694444444444 | 2.519 | 3.897 | 4.278 | 6.643 | 6.673 |
| 3.15833333333333 | 2.525 | 4.001 | 4.007 | 6.641 | 6.671 |
| 3.15972222222222 | 2.521 | 4.002 | 4.116 | 6.643 | 6.675 |
| 3.16111111111111 | 2.418 | 4.005 | 4.007 | 6.642 | 6.671 |
| 3.1625 | 2.523 | 4.006 | 4.018 | 6.64 | 6.673 |
| 3.16388888888889 | 2.419 | 3.682 | 4.223 | 6.641 | 6.672 |
| 3.16527777777778 | 1.995 | 3.524 | 3.899 | 6.64 | 6.674 |
| 3.16666666666667 | 2.421 | 3.897 | 4.115 | 6.636 | 6.673 |
| 3.16805555555556 | 2.732 | 3.897 | 4.113 | 6.639 | 6.672 |
| 3.16944444444444 | 2.734 | 4.217 | 4.113 | 6.635 | 6.676 |
| 3.17083333333333 | 2.838 | 4.004 | 4.006 | 6.633 | 6.674 |
| 3.17222222222222 | 2.63 | 3.786 | 4.113 | 6.637 | 6.676 |
| 3.17361111111111 | 2.63 | 3.784 | 4.112 | 6.636 | 6.675 |
| 3.175 | 2.521 | 3.784 | 3.749 | 6.636 | 6.674 |
| 3.17638888888889 | 2.628 | 3.785 | 3.901 | 6.639 | 6.676 |
| 3.17777777777778 | 2.629 | 3.684 | 3.899 | 6.637 | 6.679 |
| 3.17916666666667 | 2.627 | 3.78 | 3.787 | 6.64 | 6.678 |
| 3.18055555555556 | 2.628 | 3.785 | 3.899 | 6.64 | 6.676 |
| 3.18194444444444 | 2.512 | 3.683 | 4.004 | 6.639 | 6.677 |
| 3.18333333333333 | 2.521 | 3.682 | 3.903 | 6.639 | 6.674 |
| 3.18472222222222 | 2.208 | 3.47 | 3.824 | 6.639 | 6.674 |
| 3.18611111111111 | 1.787 | 3.151 | 4.009 | 6.64 | 6.67 |
| 3.1875 | 2.102 | 2.739 | 3.79 | 6.639 | 6.674 |
| 3.18888888888889 | 2.314 | 2.728 | 3.901 | 6.64 | 6.669 |
| 3.19027777777778 | 2.315 | 3.047 | 3.791 | 6.64 | 6.668 |
| 3.19166666666667 | 2.208 | 3.453 | 3.687 | 6.637 | 6.674 |
| 3.19305555555556 | 1.993 | 3.898 | 3.813 | 6.639 | 6.67 |
| 3.19444444444444 | 1.995 | 3.787 | 3.685 | 6.637 | 6.668 |
| 3.19583333333333 | 2.15 | 3.786 | 3.903 | 6.638 | 6.669 |
| 3.19722222222222 | 2.52 | 3.787 | 3.677 | 6.639 | 6.67 |
| 3.19861111111111 | 2.52 | 3.784 | 3.15 | 6.637 | 6.67 |
| 3.2 | 2.522 | 3.687 | 3.255 | 6.64 | 6.669 |
| 3.20138888888889 | 2.521 | 3.683 | 3.364 | 6.64 | 6.67 |
| 3.20277777777778 | 2.524 | 3.54 | 3.469 | 6.642 | 6.671 |
| 3.20416666666667 | 2.522 | 3.363 | 3.364 | 6.641 | 6.673 |
| 3.20555555555556 | 2.524 | 3.283 | 3.162 | 6.64 | 6.673 |
| 3.20694444444444 | 2.102 | 2.833 | 3.256 | 6.528 | 6.672 |
| 3.20833333333333 | 1.992 | 2.516 | 3.256 | 6.644 | 6.67 |
| 3.20972222222222 | 1.992 | 2.73 | 3.366 | 6.641 | 6.67 |
| 3.21111111111111 | 1.992 | 2.939 | 3.365 | 6.402 | 6.673 |
| 3.2125 | 1.995 | 3.109 | 3.365 | 6.418 | 6.673 |
| 3.21388888888889 | 1.993 | 3.379 | 3.256 | 6.419 | 6.672 |
| 3.21527777777778 | 2.207 | 3.571 | 3.365 | 6.53 | 6.673 |
| 3.21666666666667 | 2.208 | 3.573 | 3.47 | 6.419 | 6.673 |
| 3.21805555555556 | 2.207 | 3.367 | 3.254 | 6.306 | 6.673 |
| 3.21944444444444 | 2.207 | 3.256 | 3.155 | 6.306 | 6.675 |
| 3.22083333333333 | 2.164 | 3.151 | 3.366 | 6.305 | 6.563 |
| 3.22222222222222 | 2.099 | 3.153 | 3.469 | 6.306 | 6.336 |
| 3.22361111111111 | 2.207 | 3.153 | 3.473 | 6.307 | 6.335 |
| 3.225 | 2.1 | 3.152 | 3.47 | 6.194 | 6.334 |
| 3.22638888888889 | 2.098 | 3.04 | 3.466 | 6.196 | 6.221 |
| 3.22777777777778 | 2.102 | 2.415 | 3.254 | 6.197 | 6.335 |
| 3.22916666666667 | 1.993 | 2.729 | 3.364 | 6.085 | 6.338 |
| 3.23055555555556 | 2.208 | 2.624 | 3.471 | 6.083 | 6.224 |
| 3.23194444444444 | 1.992 | 3.04 | 3.469 | 5.863 | 6.336 |
| 3.23333333333333 | 1.907 | 3.363 | 3.469 | 5.755 | 6.002 |
| 3.23472222222222 | 1.992 | 3.47 | 3.255 | 5.754 | 5.887 |
| 3.23611111111111 | 1.991 | 3.684 | 3.258 | 5.206 | 5.888 |
| 3.2375 | 1.994 | 3.363 | 3.151 | 5.754 | 5.806 |
| 3.23888888888889 | 1.992 | 3.364 | 2.832 | 5.861 | 5.559 |
| 3.24027777777778 | 2.1 | 3.368 | 2.831 | 5.862 | 5.672 |
| 3.24166666666667 | 2.208 | 3.364 | 2.732 | 5.862 | 5.67 |
| 3.24305555555556 | 2.157 | 3.364 | 2.79 | 5.862 | 5.672 |
| 3.24444444444444 | 2.209 | 3.155 | 2.832 | 5.737 | 5.671 |
| 3.24583333333333 | 2.207 | 3.153 | 2.832 | 4.879 | 5.669 |
| 3.24722222222222 | 2.21 | 2.829 | 2.829 | 5.535 | 5.669 |
| 3.24861111111111 | 2.103 | 2.204 | 2.832 | 5.535 | 5.673 |
| 3.25 | 1.581 | 2.415 | 2.727 | 5.429 | 5.669 |
| 3.25138888888889 | 2.207 | 2.627 | 2.729 | 5.493 | 5.673 |
| 3.25277777777778 | 2.209 | 2.725 | 2.727 | 5.647 | 5.558 |
| 3.25416666666667 | 1.992 | 2.939 | 2.729 | 5.646 | 5.673 |
| 3.25555555555556 | 1.889 | 3.365 | 2.627 | 5.646 | 5.121 |
| 3.25694444444444 | 1.992 | 3.468 | 2.521 | 4.991 | 4.899 |
| 3.25833333333333 | 1.994 | 3.259 | 2.294 | 4.853 | 5.013 |
| 3.25972222222222 | 1.99 | 3.153 | 2.516 | 4.561 | 5.014 |
| 3.26111111111111 | 2.211 | 3.154 | 2.936 | 4.56 | 5.011 |
| 3.2625 | 2.208 | 3.154 | 2.834 | 4.229 | 5.013 |
| 3.26388888888889 | 2.209 | 3.153 | 2.834 | 4.662 | 4.915 |
| 3.26527777777778 | 2.101 | 3.155 | 2.836 | 5.204 | 5.013 |
| 3.26666666666667 | 2.101 | 3.041 | 2.833 | 4.52 | 5.013 |
| 3.26805555555556 | 2.101 | 2.519 | 2.833 | 4.561 | 5.015 |
| 3.26944444444444 | 2.1 | 2.21 | 2.871 | 4.342 | 5.017 |
| 3.27083333333333 | 2.1 | 1.998 | 2.627 | 4.447 | 4.684 |
| 3.27222222222222 | 1.791 | 2.417 | 2.626 | 4.446 | 4.464 |
| 3.27361111111111 | 1.992 | 2.519 | 2.625 | 4.447 | 4.463 |
| 3.275 | 1.791 | 2.832 | 2.627 | 4.338 | 4.466 |
| 3.27638888888889 | 1.993 | 3.04 | 2.418 | 4.446 | 4.465 |
| 3.27777777777778 | 1.788 | 3.366 | 2.206 | 4.45 | 4.466 |
| 3.27916666666667 | 1.997 | 3.256 | 2.517 | 4.339 | 4.483 |
| 3.28055555555556 | 1.994 | 2.939 | 2.627 | 4.124 | 4.444 |
| 3.28194444444444 | 1.993 | 2.832 | 2.626 | 4.123 | 4.464 |
| 3.28333333333333 | 1.992 | 2.623 | 2.624 | 4.88 | 4.581 |
| 3.28472222222222 | 1.99 | 2.517 | 2.625 | 4.558 | 4.58 |
| 3.28611111111111 | 1.994 | 2.411 | 2.627 | 4.56 | 4.582 |
| 3.2875 | 1.992 | 1.986 | 2.624 | 4.342 | 4.367 |
| 3.28888888888889 | 1.993 | 2.308 | 2.625 | 4.447 | 4.136 |
| 3.29027777777778 | 2.101 | 2.208 | 2.626 | 4.449 | 4.358 |
| 3.29166666666667 | 2.099 | 2.417 | 2.624 | 4.449 | 4.464 |
| 3.29305555555556 | 1.992 | 2.623 | 2.416 | 4.448 | 4.466 |
| 3.29444444444444 | 1.992 | 2.727 | 2.518 | 4.446 | 4.466 |
| 3.29583333333333 | 1.889 | 2.417 | 2.623 | 4.345 | 4.582 |
| 3.29722222222222 | 1.994 | 2.621 | 2.622 | 4.012 | 4.581 |
| 3.29861111111111 | 1.992 | 2.419 | 2.211 | 4.123 | 4.58 |
| 3.3 | 1.991 | 2.622 | 2.52 | 4.121 | 4.379 |
| 3.30138888888889 | 1.881 | 2.727 | 2.622 | 4.02 | 3.699 |
| 3.30277777777778 | 1.996 | 2.519 | 2.624 | 4.122 | 3.488 |
| 3.30416666666667 | 1.991 | 2.515 | 2.624 | 3.796 | 3.068 |
| 3.30555555555556 | 1.991 | 2.518 | 2.731 | 3.685 | 3.168 |
| 3.30694444444444 | 1.996 | 2.31 | 2.624 | 3.582 | 3.065 |
| 3.30833333333333 | 1.991 | 2.101 | 2.728 | 3.473 | 3.17 |
| 3.30972222222222 | 1.991 | 2.21 | 2.622 | 3.383 | 3.167 |
| 3.31111111111111 | 1.993 | 2.459 | 2.626 | 3.366 | 3.167 |
| 3.3125 | 2.103 | 2.308 | 2.623 | 3.258 | 3.167 |
| 3.31388888888889 | 2.211 | 2.619 | 2.624 | 2.729 | 3.168 |
| 3.31527777777778 | 1.889 | 2.834 | 2.417 | 2.727 | 3.168 |
| 3.31666666666667 | 1.886 | 3.152 | 2.519 | 3.021 | 3.168 |
| 3.31805555555556 | 1.994 | 3.257 | 2.209 | 3.686 | 3.168 |
| 3.31944444444444 | 1.991 | 3.042 | 2.101 | 4.341 | 3.061 |
| 3.32083333333333 | 1.993 | 2.841 | 2.209 | 4.446 | 2.742 |
| 3.32222222222222 | 1.993 | 2.623 | 2.209 | 4.231 | 2.738 |
| 3.32361111111111 | 1.992 | 2.475 | 2.285 | 3.899 | 2.739 |
| 3.325 | 1.792 | 2.518 | 2.21 | 3.903 | 2.705 |
| 3.32638888888889 | 1.993 | 2.31 | 2.308 | 4.014 | 2.433 |
| 3.32777777777778 | 1.993 | 1.783 | 2.308 | 3.795 | 3.066 |
| 3.32916666666667 | 1.992 | 2.206 | 2.312 | 3.794 | 3.168 |
| 3.33055555555556 | 1.994 | 2.309 | 2.21 | 3.474 | 3.274 |
| 3.33194444444444 | 1.993 | 2.205 | 2.31 | 3.37 | 3.487 |
| 3.33333333333333 | 1.993 | 1.889 | 2.311 | 3.471 | 3.487 |
| 3.33472222222222 | 1.992 | 2.23 | 2.311 | 3.472 | 3.595 |
| 3.33611111111111 | 1.792 | 2.381 | 2.31 | 3.369 | 3.809 |
| 3.3375 | 1.889 | 2.206 | 1.993 | 3.367 | 3.699 |
| 3.33888888888889 | 1.995 | 1.889 | 2.111 | 3.258 | 3.917 |
| 3.34027777777778 | 2.099 | 2.415 | 1.89 | 3.367 | 4.091 |
| 3.34166666666667 | 2.102 | 2.414 | 2.209 | 3.369 | 4.019 |
| 3.34305555555556 | 1.995 | 2.204 | 2.31 | 3.367 | 3.92 |
| 3.34444444444444 | 2.209 | 2.098 | 2.289 | 3.258 | 3.386 |
| 3.34583333333333 | 2.101 | 1.991 | 2.207 | 3.157 | 3.383 |
| 3.34722222222222 | 2.102 | 1.888 | 2.209 | 2.941 | 3.382 |
| 3.34861111111111 | 1.793 | 2.309 | 2.209 | 2.52 | 3.255 |
| 3.35 | 1.994 | 2.62 | 2.205 | 2.207 | 3.169 |
| 3.35138888888889 | 1.993 | 2.462 | 2.207 | 2.098 | 3.172 |
| 3.35277777777778 | 1.993 | 2.518 | 2.311 | 2.097 | 3.17 |
| 3.35416666666667 | 1.993 | 2.201 | 2.207 | 2.874 | 2.424 |
| 3.35555555555556 | 1.993 | 2.203 | 2.207 | 3.47 | 2.533 |
| 3.35694444444444 | 1.589 | 2.098 | 2.206 | 3.873 | 2.741 |
| 3.35833333333333 | 1.29 | 1.99 | 1.785 | 3.794 | 2.848 |
| 3.35972222222222 | 1.376 | 1.889 | 2.099 | 3.793 | 2.849 |
| 3.36111111111111 | 1.376 | 1.998 | 2.022 | 3.274 | 2.64 |
| 3.3625 | 1.472 | 2.307 | 1.994 | 3.26 | 2.738 |
| 3.36388888888889 | 1.376 | 2.626 | 2.203 | 3.158 | 2.849 |
| 3.36527777777778 | 1.475 | 2.444 | 2.206 | 2.729 | 2.957 |
| 3.36666666666667 | 1.583 | 2.095 | 2.312 | 2.69 | 3.17 |
| 3.36805555555556 | 1.582 | 1.887 | 2.31 | 2.622 | 3.172 |
| 3.36944444444444 | 1.472 | 1.993 | 2.308 | 2.518 | 3.061 |
| 3.37083333333333 | 1.581 | 1.99 | 2.206 | 2.516 | 2.74 |
| 3.37222222222222 | 1.473 | 1.992 | 2.207 | 2.417 | 2.533 |
| 3.37361111111111 | 1.584 | 2.26 | 2.29 | 2.099 | 2.531 |
| 3.375 | 1.584 | 2.308 | 2.205 | 2.099 | 2.53 |
| 3.37638888888889 | 1.583 | 1.99 | 2.202 | 2.133 | 2.634 |
| 3.37777777777778 | 1.275 | 1.925 | 1.986 | 2.831 | 2.741 |
| 3.37916666666667 | 1.376 | 1.986 | 1.889 | 2.63 | 2.633 |
| 3.38055555555556 | 1.473 | 1.991 | 1.992 | 2.517 | 2.64 |
| 3.38194444444444 | 1.583 | 1.885 | 2.097 | 2.1 | 2.741 |
| 3.38333333333333 | 1.583 | 1.784 | 1.99 | 2.085 | 2.846 |
| 3.38472222222222 | 1.684 | 2.201 | 1.991 | 1.997 | 2.849 |
| 3.38611111111111 | 1.583 | 1.899 | 2.098 | 2.695 | 2.53 |
| 3.3875 | 1.583 | 1.888 | 2.205 | 3.318 | 2.532 |
| 3.38888888888889 | 1.582 | 2.205 | 2.207 | 3.473 | 2.637 |
| 3.39027777777778 | 1.583 | 2.097 | 2.204 | 3.369 | 2.637 |
| 3.39166666666667 | 1.58 | 1.989 | 2.205 | 3.369 | 2.741 |
| 3.39305555555556 | 1.582 | 1.989 | 2.206 | 3.349 | 2.742 |
| 3.39444444444444 | 1.584 | 1.887 | 2.312 | 3.262 | 2.846 |
| 3.39583333333333 | 1.377 | 2.142 | 2.207 | 2.728 | 2.636 |
| 3.39722222222222 | 1.416 | 1.885 | 2.208 | 2.729 | 2.727 |
| 3.39861111111111 | 1.582 | 1.889 | 1.887 | 2.205 | 2.634 |
| 3.4 | 1.273 | 1.89 | 2.097 | 2.092 | 2.848 |
| 3.40138888888889 | 1.474 | 2.068 | 2.1 | 1.887 | 2.742 |
| 3.40277777777778 | 1.583 | 2.098 | 1.883 | 2.098 | 2.53 |
| 3.40416666666667 | 1.584 | 1.792 | 1.789 | 2.204 | 2.532 |
| 3.40555555555556 | 1.584 | 1.986 | 1.989 | 2.308 | 2.53 |
| 3.40694444444444 | 1.584 | 1.743 | 2.101 | 2.206 | 2.53 |
| 3.40833333333333 | 1.583 | 2.201 | 2.1 | 2.1 | 2.53 |
| 3.40972222222222 | 1.583 | 1.988 | 2.1 | 2.1 | 2.634 |
| 3.41111111111111 | 1.583 | 1.988 | 2.206 | 2.206 | 2.742 |
| 3.4125 | 1.583 | 1.989 | 2.209 | 2.202 | 1.587 |
| 3.41388888888889 | 1.473 | 1.989 | 2.209 | 2.201 | 1.378 |
| 3.41527777777778 | 1.583 | 1.944 | 2.206 | 1.816 | 1.379 |
| 3.41666666666667 | 1.583 | 1.991 | 2.207 | 1.886 | 1.272 |
| 3.41805555555556 | 1.473 | 1.888 | 1.988 | 1.888 | 1.169 |
| 3.41944444444444 | 1.681 | 1.886 | 1.99 | 1.681 | 1.19 |
| 3.42083333333333 | 1.581 | 1.987 | 2.1 | 2.219 | 1.377 |
| 3.42222222222222 | 1.278 | 2.098 | 2.206 | 2.941 | 1.482 |
| 3.42361111111111 | 1.585 | 1.99 | 2.205 | 3.259 | 1.587 |
| 3.425 | 1.583 | 1.887 | 2.097 | 3.37 | 1.688 |
| 3.42638888888889 | 1.582 | 1.68 | 2.209 | 3.266 | 1.851 |
| 3.42777777777778 | 1.583 | 1.884 | 2.209 | 3.157 | 1.898 |
| 3.42916666666667 | 1.582 | 1.99 | 2.205 | 2.729 | 2.107 |
| 3.43055555555556 | 1.582 | 1.988 | 2.207 | 2.836 | 2.213 |
| 3.43194444444444 | 1.584 | 1.989 | 2.205 | 2.729 | 2.214 |
| 3.43333333333333 | 1.584 | 1.941 | 2.207 | 2.517 | 2.318 |
| 3.43472222222222 | 1.582 | 1.937 | 2.209 | 2.518 | 2.214 |
| 3.43611111111111 | 1.581 | 1.99 | 2.206 | 2.52 | 1.791 |
| 3.4375 | 1.584 | 2.203 | 2.205 | 2.519 | 2.001 |
| 3.43888888888889 | 1.474 | 1.681 | 1.992 | 2.308 | 2.111 |
| 3.44027777777778 | 1.475 | 1.581 | 2.097 | 2.419 | 2.213 |
| 3.44166666666667 | 1.378 | 1.877 | 2.205 | 2.302 | 1.898 |
| 3.44305555555556 | 1.195 | 1.987 | 2.313 | 2.205 | 2.001 |
| 3.44444444444444 | 1.575 | 1.951 | 2.208 | 2.204 | 2.108 |
| 3.44583333333333 | 1.581 | 1.728 | 2.208 | 2.204 | 2.107 |
| 3.44722222222222 | 1.583 | 1.612 | 1.789 | 2.208 | 2.215 |
| 3.44861111111111 | 1.472 | 1.885 | 2.097 | 2.206 | 2.215 |
| 3.45 | 1.582 | 1.99 | 2.097 | 1.992 | 2.215 |
| 3.45138888888889 | 1.474 | 1.99 | 2.207 | 2.1 | 1.805 |
| 3.45277777777778 | 1.583 | 1.99 | 2.205 | 2.098 | 0.746 |
| 3.45416666666667 | 1.584 | 1.989 | 2.207 | 2.204 | 1.068 |
| 3.45555555555556 | 1.583 | 1.989 | 2.208 | 2.204 | 0.967 |
| 3.45694444444444 | 1.591 | 1.99 | 1.786 | 2.095 | 1.068 |
| 3.45833333333333 | 1.583 | 1.992 | 0.533 | 2.204 | 1.274 |
| 3.45972222222222 | 1.473 | 1.682 | 1.069 | 2.207 | 1.482 |
| 3.46111111111111 | 1.521 | 1.581 | 1.272 | 2.206 | 1.585 |
| 3.4625 | 1.684 | 1.475 | 1.375 | 2.206 | 1.584 |
| 3.46388888888889 | 1.508 | 1.678 | 1.472 | 1.89 | 1.688 |
| 3.46527777777778 | 1.171 | 1.373 | 1.579 | 2.033 | 1.484 |
| 3.46666666666667 | 1.583 | 1.679 | 1.579 | 1.68 | 1.585 |
| 3.46805555555556 | 1.583 | 1.58 | 1.373 | 1.78 | 1.47 |
| 3.46944444444444 | 1.583 | 1.476 | 1.476 | 1.989 | 1.273 |
| 3.47083333333333 | 1.475 | 1.58 | 1.581 | 1.992 | 1.172 |
| 3.47222222222222 | 1.583 | 1.555 | 1.683 | 1.991 | 1.38 |
| 3.47361111111111 | 1.583 | 1.787 | 1.68 | 2.097 | 1.585 |
| 3.475 | 1.585 | 1.58 | 1.681 | 2.308 | 1.641 |
| 3.47638888888889 | 1.586 | 1.682 | 1.682 | 2.204 | 1.792 |
| 3.47777777777778 | 1.584 | 1.581 | 1.583 | 2.203 | 2.002 |
| 3.47916666666667 | 1.584 | 1.68 | 1.376 | 2.204 | 2.109 |
| 3.48055555555556 | 1.377 | 1.683 | 1.374 | 2.205 | 2.106 |
| 3.48194444444444 | 1.378 | 1.639 | 1.582 | 2.205 | 2.213 |
| 3.48333333333333 | 1.377 | 1.583 | 1.678 | 1.994 | 2.214 |
| 3.48472222222222 | 1.474 | 1.585 | 1.681 | 1.993 | 1.577 |
| 3.48611111111111 | 1.274 | 1.581 | 1.679 | 1.884 | 0.513 |
| 3.4875 | 1.277 | 1.789 | 1.784 | 1.784 | 0.744 |
| 3.48888888888889 | 1.473 | 1.786 | 1.472 | 1.989 | 0.744 |
| 3.49027777777778 | 1.378 | 1.885 | 1.475 | 2.098 | 1.068 |
| 3.49166666666667 | 1.375 | 1.593 | 1.372 | 2.206 | 1.067 |
| 3.49305555555556 | 1.475 | 1.678 | 1.58 | 2.101 | 1.067 |
| 3.49444444444444 | 1.586 | 1.581 | 1.678 | 1.992 | 1.067 |
| 3.49583333333333 | 1.583 | 1.475 | 1.682 | 2.101 | 1.07 |
| 3.49722222222222 | 1.583 | 1.474 | 1.679 | 2.103 | 1.07 |
| 3.49861111111111 | 1.582 | 1.582 | 1.275 | 2.206 | 1.278 |
| 3.5 | 1.473 | 1.473 | 1.374 | 2.1 | 1.271 |
| 3.50138888888889 | 1.379 | 1.89 | 1.476 | 1.99 | 1.168 |
| 3.50277777777778 | 1.374 | 1.58 | 1.473 | 2.101 | 1.069 |
| 3.50416666666667 | 1.374 | 1.786 | 1.68 | 2.051 | 1.069 |
| 3.50555555555556 | 1.377 | 1.371 | 1.681 | 2.099 | 1.275 |
| 3.50694444444444 | 1.359 | 1.679 | 1.679 | 2.204 | 1.169 |
| 3.50833333333333 | 1.174 | 1.582 | 1.68 | 1.995 | 1.38 |
| 3.50972222222222 | 1.473 | 1.471 | 1.473 | 1.786 | 1.55 |
| 3.51111111111111 | 1.473 | 1.477 | 1.472 | 1.994 | 1.381 |
| 3.5125 | 1.446 | 1.472 | 1.582 | 2.202 | 1.481 |
| 3.51388888888889 | 1.376 | 1.582 | 1.473 | 1.993 | 1.586 |
| 3.51527777777778 | 1.376 | 1.473 | 1.582 | 1.994 | 1.586 |
| 3.51666666666667 | 1.376 | 1.476 | 1.681 | 1.992 | 1.583 |
| 3.51805555555556 | 1.376 | 1.581 | 1.479 | 1.877 | 1.268 |
| 3.51944444444444 | 1.376 | 1.543 | 1.373 | 1.992 | 1.378 |
| 3.52083333333333 | 1.173 | 1.58 | 1.472 | 1.887 | 1.378 |
| 3.52222222222222 | 1.377 | 1.582 | 1.472 | 2.095 | 1.481 |
| 3.52361111111111 | 1.379 | 1.679 | 1.472 | 2.1 | 1.584 |
| 3.525 | 1.377 | 1.476 | 1.585 | 1.99 | 1.583 |
| 3.52638888888889 | 1.473 | 1.516 | 1.681 | 1.474 | 1.482 |
| 3.52777777777778 | 1.584 | 1.473 | 1.681 | 1.476 | 1.584 |
| 3.52916666666667 | 1.474 | 1.582 | 1.581 | 1.477 | 1.605 |
| 3.53055555555556 | 1.378 | 1.472 | 1.579 | 1.576 | 1.586 |
| 3.53194444444444 | 1.379 | 1.371 | 1.376 | 1.475 | 1.584 |
| 3.53333333333333 | 1.473 | 1.499 | 1.581 | 1.025 | 1.482 |
| 3.53472222222222 | 1.474 | 1.45 | 1.474 | 0.85 | 1.067 |
| 3.53611111111111 | 1.4 | 1.68 | 1.458 | 0.85 | 1.072 |
| 3.5375 | 1.376 | 1.531 | 1.471 | 0.851 | 1.067 |
| 3.53888888888889 | 1.377 | 1.374 | 1.169 | 0.85 | 1.069 |
| 3.54027777777778 | 1.378 | 1.582 | 1.272 | 0.851 | 1.069 |
| 3.54166666666667 | 1.277 | 1.474 | 1.469 | 0.849 | 1.069 |
| 3.54305555555556 | 1.377 | 1.504 | 1.581 | 0.852 | 1.069 |
| 3.54444444444444 | 1.378 | 1.373 | 1.634 | 0.852 | 1.07 |
| 3.54583333333333 | 1.276 | 1.578 | 1.581 | 0.852 | 1.17 |
| 3.54722222222222 | 1.379 | 1.471 | 1.68 | 0.852 | 1.376 |
| 3.54861111111111 | 1.379 | 1.677 | 1.68 | 0.849 | 1.378 |
| 3.55 | 1.273 | 1.578 | 1.681 | 0.961 | 1.378 |
| 3.55138888888889 | 0.919 | 1.582 | 1.681 | 0.689 | 1.07 |
| 3.55277777777778 | 1.196 | 1.583 | 1.473 | 1.163 | 1.07 |
| 3.55416666666667 | 1.316 | 1.373 | 1.578 | 1.269 | 1.068 |
| 3.55555555555556 | 1.377 | 1.374 | 1.581 | 0.924 | 1.07 |
| 3.55694444444444 | 1.472 | 1.272 | 1.375 | 0.852 | 0.743 |
| 3.55833333333333 | 1.582 | 1.373 | 1.194 | 0.962 | 0.743 |
| 3.55972222222222 | 1.475 | 1.373 | 0.96 | 0.85 | 0.743 |
| 3.56111111111111 | 1.376 | 1.681 | 1.274 | 0.96 | 0.686 |
| 3.5625 | 1.069 | 1.474 | 1.375 | 0.96 | 0.986 |
| 3.56388888888889 | 1.071 | 1.375 | 1.373 | 0.742 | 0.857 |
| 3.56527777777778 | 1.172 | 1.17 | 1.472 | 0.74 | 0.854 |
| 3.56666666666667 | 1.273 | 1.785 | 1.581 | 1.065 | 0.857 |
| 3.56805555555556 | 1.376 | 1.581 | 1.68 | 0.85 | 0.744 |
| 3.56944444444444 | 1.377 | 1.474 | 1.677 | 0.702 | 0.744 |
| 3.57083333333333 | 1.377 | 1.375 | 1.679 | 1.141 | 0.855 |
| 3.57222222222222 | 1.072 | 1.373 | 1.68 | 0.963 | 1.069 |
| 3.57361111111111 | 1.016 | 1.474 | 1.473 | 0.926 | 0.965 |
| 3.575 | 1.173 | 1.373 | 1.582 | 0.961 | 0.855 |
| 3.57638888888889 | 1.277 | 1.274 | 1.579 | 0.853 | 0.744 |
| 3.57777777777778 | 1.378 | 1.474 | 1.272 | 0.961 | 0.747 |
| 3.57916666666667 | 1.582 | 1.582 | 1.068 | 0.853 | 0.747 |
| 3.58055555555556 | 1.584 | 1.375 | 1.07 | 0.963 | 0.922 |
| 3.58194444444444 | 1.378 | 1.374 | 1.069 | 0.853 | 0.855 |
| 3.58333333333333 | 1.175 | 1.373 | 0.963 | 0.962 | 0.741 |
| 3.58472222222222 | 0.961 | 1.272 | 1.07 | 0.85 | 0.744 |
| 3.58611111111111 | 0.965 | 1.268 | 1.272 | 1.061 | 0.967 |
| 3.5875 | 1.176 | 1.472 | 1.377 | 0.963 | 0.967 |
| 3.58888888888889 | 1.274 | 1.375 | 1.375 | 0.999 | 1.001 |
| 3.59027777777778 | 1.377 | 1.473 | 1.377 | 0.961 | 0.967 |
| 3.59166666666667 | 1.377 | 1.376 | 1.373 | 0.851 | 0.855 |
| 3.59305555555556 | 1.274 | 1.272 | 1.374 | 0.963 | 0.857 |
| 3.59444444444444 | 0.857 | 1.432 | 1.273 | 0.961 | 0.965 |
| 3.59583333333333 | 0.963 | 1.374 | 1.377 | 1.059 | 0.857 |
| 3.59722222222222 | 1.378 | 1.375 | 1.374 | 0.961 | 0.965 |
| 3.59861111111111 | 1.377 | 1.374 | 0.965 | 0.962 | 0.744 |
| 3.6 | 1.378 | 1.375 | 1.069 | 0.852 | 0.535 |
| 3.60138888888889 | 1.377 | 1.384 | 0.962 | 0.975 | 0.157 |
| 3.60277777777778 | 1.07 | 1.376 | 1.069 | 1.162 | 0.741 |
| 3.60416666666667 | 1.071 | 1.47 | 1.068 | 1.063 | 0.965 |
| 3.60555555555556 | 1.071 | 1.28 | 1.068 | 0.962 | 0.854 |
| 3.60694444444444 | 0.96 | 1.188 | 1.172 | 0.852 | 0.967 |
| 3.60833333333333 | 1.275 | 1.373 | 1.269 | 0.741 | 0.857 |
| 3.60972222222222 | 1.272 | 1.374 | 1.375 | 0.852 | 0.854 |
| 3.61111111111111 | 1.376 | 1.273 | 1.472 | 1.062 | 0.855 |
| 3.6125 | 1.378 | 1.372 | 1.58 | 1.165 | 0.854 |
| 3.61388888888889 | 1.301 | 1.375 | 1.582 | 1.268 | 0.854 |
| 3.61527777777778 | 1.071 | 1.373 | 1.526 | 1.372 | 0.857 |
| 3.61666666666667 | 0.961 | 1.275 | 1.474 | 1.474 | 0.53 |
| 3.61805555555556 | 0.962 | 1.374 | 1.17 | 1.475 | 0.744 |
| 3.61944444444444 | 0.959 | 1.274 | 0.963 | 1.268 | 0.744 |
| 3.62083333333333 | 1.171 | 1.374 | 0.963 | 1.371 | 0.994 |
| 3.62222222222222 | 1.375 | 1.168 | 1.069 | 1.578 | 0.854 |
| 3.62361111111111 | 1.039 | 1.275 | 0.961 | 1.373 | 0.857 |
| 3.625 | 1.07 | 1.069 | 1.171 | 1.475 | 0.854 |
| 3.62638888888889 | 1.172 | 1.472 | 1.271 | 1.373 | 0.638 |
| 3.62777777777778 | 1.274 | 1.272 | 1.373 | 1.578 | 0.854 |
| 3.62916666666667 | 1.376 | 1.274 | 1.471 | 1.577 | 0.857 |
| 3.63055555555556 | 1.173 | 1.373 | 1.474 | 1.579 | 0.854 |
| 3.63194444444444 | 1.274 | 1.374 | 1.58 | 1.576 | 0.854 |
| 3.63333333333333 | 1.375 | 1.272 | 1.58 | 1.579 | 0.484 |
| 3.63472222222222 | 1.378 | 1.274 | 1.679 | 1.574 | 0.741 |
| 3.63611111111111 | 1.376 | 1.373 | 1.684 | 1.372 | 0.743 |
| 3.6375 | 0.856 | 1.273 | 1.475 | 1.373 | 0.746 |
| 3.63888888888889 | 0.962 | 1.372 | 0.962 | 1.373 | 0.743 |
| 3.64027777777778 | 1.173 | 1.27 | 1.069 | 1.476 | 0.746 |
| 3.64166666666667 | 1.277 | 1.373 | 1.068 | 1.476 | 0.746 |
| 3.64305555555556 | 1.277 | 1.372 | 1.17 | 1.474 | 0.746 |
| 3.64444444444444 | 1.275 | 0.856 | 1.374 | 1.474 | 0.741 |
| 3.64583333333333 | 1.378 | 1.275 | 1.275 | 1.065 | 0.744 |
| 3.64722222222222 | 1.378 | 1.472 | 1.474 | 1.065 | 0.744 |
| 3.64861111111111 | 1.376 | 1.272 | 1.579 | 1.063 | 0.741 |
| 3.65 | 1.377 | 1.471 | 0.751 | 0.851 | 0.419 |
| 3.65138888888889 | 1.378 | 1.375 | 0.959 | 0.851 | 0.854 |
| 3.65277777777778 | 1.38 | 1.274 | 1.069 | 0.741 | 0.64 |
| 3.65416666666667 | 1.174 | 1.274 | 1.069 | 0.74 | 0.971 |
| 3.65555555555556 | 1.275 | 1.376 | 1.069 | 0.743 | 0.964 |
| 3.65694444444444 | 1.275 | 1.374 | 1.17 | 0.74 | 0.967 |
| 3.65833333333333 | 1.171 | 1.273 | 0.644 | 0.743 | 0.856 |
| 3.65972222222222 | 0.962 | 1.273 | 0.965 | 0.741 | 0.854 |
| 3.66111111111111 | 0.963 | 1.272 | 0.963 | 0.741 | 0.854 |
| 3.6625 | 0.96 | 1.348 | 0.964 | 0.741 | 0.854 |
| 3.66388888888889 | 0.857 | 1.12 | 1.07 | 0.529 | 0.854 |
| 3.66527777777778 | 1.016 | 1.307 | 1.069 | 0.738 | 0.854 |
| 3.66666666666667 | 0.962 | 1.271 | 0.963 | 0.737 | 0.6 |
| 3.66805555555556 | 1.173 | 1.272 | 0.883 | 0.57 | 0.744 |
| 3.66944444444444 | 1.2 | 1.271 | 1.072 | 0.416 | 0.746 |
| 3.67083333333333 | 1.376 | 1.172 | 1.07 | 0.154 | 0.638 |
| 3.67222222222222 | 1.377 | 1.376 | 1.07 | 1.164 | 0.638 |
| 3.67361111111111 | 1.475 | 1.275 | 0.961 | 1.266 | 0.744 |
| 3.675 | 1.475 | 1.276 | 0.961 | 1.376 | 0.743 |
| 3.67638888888889 | 1.579 | 1.274 | 1.067 | 1.373 | 0.744 |
| 3.67777777777778 | 1.378 | 1.273 | 1.071 | 1.373 | 0.741 |
| 3.67916666666667 | 1.275 | 1.273 | 0.75 | 1.373 | 0.743 |
| 3.68055555555556 | 0.963 | 1.375 | 1.066 | 1.373 | 0.743 |
| 3.68194444444444 | 0.963 | 1.373 | 1.167 | 1.373 | 0.183 |
| 3.68333333333333 | 0.96 | 1.275 | 1.168 | 1.268 | 0.154 |
| 3.68472222222222 | 0.858 | 0.963 | 1.271 | 1.373 | 0.154 |
| 3.68611111111111 | 0.961 | 1.272 | 1.377 | 1.371 | 0.154 |
| 3.6875 | 0.961 | 1.17 | 1.472 | 0.854 | 0.154 |
| 3.68888888888889 | 0.963 | 1.273 | 1.273 | 0.849 | 0.154 |
| 3.69027777777778 | 0.963 | 1.273 | 1.372 | 0.961 | 0.154 |
| 3.69166666666667 | 0.963 | 0.997 | 1.473 | 0.739 | 0.154 |
| 3.69305555555556 | 0.961 | 1.271 | 1.47 | 0.739 | 0.157 |
| 3.69444444444444 | 0.961 | 1.286 | 1.473 | 0.739 | 0.154 |
| 3.69583333333333 | 1.067 | 1.307 | 1.505 | 0.741 | 0.154 |
| 3.69722222222222 | 1.071 | 1.273 | 1.683 | 0.742 | 0.154 |
| 3.69861111111111 | 1.069 | 1.276 | 0.75 | 0.741 | 0.157 |
| 3.7 | 0.931 | 1.274 | 0.16 | 0.739 | 0.154 |
| 3.70138888888889 | 0.982 | 1.272 | 0.857 | 0.541 | 0.154 |
| 3.70277777777778 | 0.96 | 1.274 | 0.96 | 0.744 | 0.152 |
| 3.70416666666667 | 0.963 | 0.942 | 0.962 | 0.416 | 0.157 |
| 3.70555555555556 | 1.172 | 1.173 | 0.96 | 0.739 | 0.154 |
| 3.70694444444444 | 1.377 | 1.071 | 0.963 | 0.739 | 0.154 |
| 3.70833333333333 | 1.377 | 1.172 | 1.071 | 0.739 | 0.154 |
| 3.70972222222222 | 1.38 | 0.962 | 1.071 | 0.742 | 0.157 |
| 3.71111111111111 | 1.277 | 1.274 | 0.748 | 0.739 | 0.155 |
| 3.7125 | 1.377 | 0.965 | 0.963 | 0.741 | 0.155 |
| 3.71388888888889 | 1.377 | 1.17 | 0.963 | 0.53 | 0.155 |
| 3.71527777777778 | 1.377 | 1.303 | 0.962 | 0.739 | 0.157 |
| 3.71666666666667 | 1.273 | 1.275 | 1.069 | 0.741 | 0.154 |
| 3.71805555555556 | 1.278 | 1.273 | 1.071 | 0.741 | 0.154 |
| 3.71944444444444 | 1.376 | 1.275 | 0.751 | 0.727 | 0.152 |
| 3.72083333333333 | 1.377 | 1.373 | 0.772 | 0.528 | 0.154 |
| 3.72222222222222 | 1.173 | 1.375 | 0.961 | 0.284 | 0.157 |
| 3.72361111111111 | 0.857 | 1.376 | 0.961 | 0.154 | 0.154 |
| 3.725 | 0.645 | 0.858 | 1.069 | 0.156 | 0.157 |
| 3.72638888888889 | 0.86 | 0.993 | 1.071 | 0.152 | 0.154 |
| 3.72777777777778 | 0.855 | 0.961 | 1.069 | 0.154 | 0.154 |
| 3.72916666666667 | 0.963 | 0.964 | 1.066 | 0.154 | 0.157 |
| 3.73055555555556 | 0.962 | 0.968 | 1.068 | 0.156 | 0.157 |
| 3.73194444444444 | 0.962 | 0.961 | 0.962 | 0.149 | 0.154 |
| 3.73333333333333 | 0.857 | 1.071 | 0.857 | 0.156 | 0.157 |
| 3.73472222222222 | 0.86 | 0.965 | 0.966 | 0.154 | 0.154 |
| 3.73611111111111 | 0.962 | 1.167 | 1.069 | 0.154 | 0.154 |
| 3.7375 | 0.963 | 1.272 | 0.965 | 0.154 | 0.157 |
| 3.73888888888889 | 0.96 | 1.274 | 0.753 | 0.154 | 0.157 |
| 3.74027777777778 | 0.961 | 1.274 | 1.163 | 0.152 | 0.154 |
| 3.74166666666667 | 0.854 | 1.27 | 1.009 | 0.152 | 0.157 |
| 3.74305555555556 | 0.964 | 1.273 | 0.965 | 0.154 | 0.154 |
| 3.74444444444444 | 0.749 | 0.962 | 0.963 | 0.154 | 0.157 |
| 3.74583333333333 | 0.963 | 0.979 | 1.072 | 0.154 | 0.154 |
| 3.74722222222222 | 0.96 | 0.96 | 0.961 | 0.157 | 0.154 |
| 3.74861111111111 | 0.858 | 1.069 | 1.067 | 0.156 | 0.157 |
| 3.75 | 0.961 | 1.069 | 1.07 | 0.154 | 0.157 |
| 3.75138888888889 | 0.86 | 0.977 | 1.07 | 0.154 | 0.157 |
| 3.75277777777778 | 0.963 | 1.274 | 1.068 | 0.152 | 0.157 |
| 3.75416666666667 | 0.963 | 0.857 | 1.067 | 0.154 | 0.157 |
| 3.75555555555556 | 0.96 | 0.882 | 0.857 | 0.152 | 0.154 |
| 3.75694444444444 | 0.961 | 0.969 | 1.069 | 0.154 | 0.154 |
| 3.75833333333333 | 0.963 | 1.17 | 0.96 | 0.152 | 0.157 |
| 3.75972222222222 | 0.96 | 1.011 | 0.748 | 0.154 | 0.154 |
| 3.76111111111111 | 0.963 | 0.962 | 0.961 | 0.154 | 0.154 |
| 3.7625 | 0.961 | 1.173 | 0.961 | 0.154 | 0.154 |
| 3.76388888888889 | 0.963 | 0.965 | 0.748 | 0.154 | 0.154 |
| 3.76527777777778 | 0.857 | 0.987 | 0.963 | 0.154 | 0.157 |
| 3.76666666666667 | 0.96 | 1.068 | 0.962 | 0.154 | 1.725 |
| 3.76805555555556 | 0.964 | 1.071 | 1.07 | 0.154 | 1.686 |
| 3.76944444444444 | 0.962 | 1.068 | 1.071 | 0.154 | 1.89 |
| 3.77083333333333 | 0.859 | 0.962 | 1.006 | 0.154 | 1.997 |
| 3.77222222222222 | 0.86 | 0.96 | 0.963 | 0.154 | 2 |
| 3.77361111111111 | 0.963 | 1.067 | 1.069 | 0.154 | 1.999 |
| 3.775 | 0.961 | 0.856 | 0.965 | 0.154 | 2.105 |
| 3.77638888888889 | 0.961 | 1.172 | 0.963 | 0.154 | 2.21 |
| 3.77777777777778 | 0.963 | 1.072 | 0.961 | 0.154 | 2.209 |
| 3.77916666666667 | 0.96 | 0.962 | 0.668 | 0.154 | 2.21 |
| 3.78055555555556 | 0.96 | 1.07 | 0.962 | 0.154 | 1.374 |
| 3.78194444444444 | 0.962 | 0.993 | 0.96 | 0.152 | 0.157 |
| 3.78333333333333 | 0.857 | 0.96 | 1.071 | 0.154 | 0.152 |
| 3.78472222222222 | 0.962 | 0.96 | 0.859 | 0.154 | 0.743 |
| 3.78611111111111 | 0.854 | 1.066 | 1.069 | 0.154 | 0.74 |
| 3.7875 | 0.748 | 1.274 | 0.962 | 0.154 | 0.534 |
| 3.78888888888889 | 0.857 | 0.961 | 1.068 | 0.154 | 0.154 |
| 3.79027777777778 | 0.963 | 1.173 | 1.071 | 0.152 | 0.853 |
| 3.79166666666667 | 0.962 | 1.068 | 1.071 | 0.157 | 0.851 |
| 3.79305555555556 | 0.854 | 0.958 | 0.963 | 0.154 | 0.851 |
| 3.79444444444444 | 0.963 | 1.068 | 1.07 | 0.154 | 0.851 |
| 3.79583333333333 | 0.856 | 0.938 | 1.049 | 0.154 | 0.853 |
| 3.79722222222222 | 0.962 | 1.171 | 0.962 | 0.154 | 0.964 |
| 3.79861111111111 | 0.962 | 0.962 | 0.75 | 0.152 | 0.532 |
| 3.8 | 0.96 | 1.251 | 0.68 | 0.154 | 0.743 |
| 3.80138888888889 | 0.96 | 1.273 | 0.748 | 0.157 | 0.743 |
| 3.80277777777778 | 0.962 | 1.273 | 0.963 | 0.157 | 0.739 |
| 3.80416666666667 | 0.857 | 0.951 | 0.961 | 0.154 | 0.742 |
| 3.80555555555556 | 0.962 | 1.115 | 0.859 | 0.157 | 0.742 |
| 3.80694444444444 | 0.859 | 0.961 | 0.962 | 1.885 | 0.741 |
| 3.80833333333333 | 0.962 | 0.961 | 0.962 | 1.992 | 0.742 |
| 3.80972222222222 | 0.959 | 1.172 | 1.069 | 2.098 | 0.742 |
| 3.81111111111111 | 0.868 | 1.07 | 1.069 | 2.099 | 0.154 |
| 3.8125 | 0.996 | 0.964 | 1.071 | 2.204 | 0.852 |
| 3.81388888888889 | 0.962 | 1.07 | 1.068 | 2.009 | 0.638 |
| 3.81527777777778 | 0.963 | 0.959 | 1.068 | 2.099 | 0.571 |
| 3.81666666666667 | 0.963 | 0.963 | 1.072 | 2.205 | 0.643 |
| 3.81805555555556 | 0.962 | 1.171 | 1.068 | 1.991 | 0.653 |
| 3.81944444444444 | 0.748 | 0.963 | 0.643 | 1.286 | 0.742 |
| 3.82083333333333 | 0.96 | 0.965 | 0.747 | 1.27 | 0.741 |
| 3.82222222222222 | 0.961 | 0.963 | 0.82 | 1.268 | 0.154 |
| 3.82361111111111 | 0.96 | 1.194 | 0.931 | 0.96 | 0.157 |
| 3.825 | 0.963 | 1.169 | 1.07 | 0.851 | 0.157 |
| 3.82638888888889 | 0.881 | 0.856 | 0.935 | 0.851 | 0.154 |
| 3.82777777777778 | 0.85 | 0.963 | 0.96 | 0.635 | 0.154 |
| 3.82916666666667 | 0.963 | 0.966 | 1.068 | 0.74 | 0.154 |
| 3.83055555555556 | 0.736 | 0.963 | 1.07 | 0.74 | 0.154 |
| 3.83194444444444 | 0.857 | 1.067 | 0.963 | 0.738 | 0.157 |
| 3.83333333333333 | 0.936 | 1.07 | 1.071 | 0.638 | 0.157 |
| 3.83472222222222 | 0.962 | 0.964 | 1.068 | 0.741 | 0.157 |
| 3.83611111111111 | 0.96 | 1.063 | 1.068 | 0.741 | 0.154 |
| 3.8375 | 0.966 | 0.962 | 1.068 | 0.743 | 0.152 |
| 3.83888888888889 | 0.961 | 1.171 | 0.957 | 0.705 | 0.154 |
| 3.84027777777778 | 0.96 | 0.855 | 0.856 | 0.416 | 0.152 |
| 3.84166666666667 | 0.963 | 0.961 | 0.981 | 0.74 | 0.157 |
| 3.84305555555556 | 0.749 | 0.857 | 0.961 | 0.743 | 0.154 |
| 3.84444444444444 | 0.859 | 0.864 | 0.896 | 0.741 | 0.154 |
| 3.84583333333333 | 0.857 | 0.86 | 1.069 | 0.741 | 0.154 |
| 3.84722222222222 | 0.962 | 0.961 | 0.963 | 0.743 | 0.157 |
| 3.84861111111111 | 0.854 | 0.962 | 0.86 | 0.741 | 0.154 |
| 3.85 | 0.859 | 0.859 | 1.071 | 0.532 | 0.155 |
| 3.85138888888889 | 0.856 | 0.962 | 1.068 | 0.635 | 0.157 |
| 3.85277777777778 | 0.746 | 0.961 | 1.071 | 0.743 | 0.157 |
| 3.85416666666667 | 0.917 | 1.069 | 1.069 | 0.741 | 0.157 |
| 3.85555555555556 | 0.962 | 0.963 | 1.071 | 0.741 | 0.154 |
| 3.85694444444444 | 0.858 | 0.857 | 1.069 | 0.532 | 0.154 |
| 3.85833333333333 | 0.855 | 0.96 | 1.071 | 0.74 | 0.157 |
| 3.85972222222222 | 0.855 | 1.098 | 0.548 | 0.739 | 0.157 |
| 3.86111111111111 | 0.962 | 0.858 | 0.855 | 0.741 | 0.154 |
| 3.8625 | 0.858 | 0.747 | 1.068 | 0.739 | 0.154 |
| 3.86388888888889 | 0.962 | 0.768 | 1.07 | 0.741 | 0.154 |
| 3.86527777777778 | 0.856 | 0.86 | 0.965 | 0.741 | 0.154 |
| 3.86666666666667 | 0.726 | 0.973 | 0.962 | 0.738 | 0.154 |
| 3.86805555555556 | 0.856 | 0.857 | 0.864 | 0.741 | 0.154 |
| 3.86944444444444 | 0.855 | 1.069 | 0.911 | 0.738 | 0.154 |
| 3.87083333333333 | 0.858 | 0.96 | 0.962 | 0.638 | 0.157 |
| 3.87222222222222 | 0.963 | 1.097 | 1.071 | 0.532 | 0.154 |
| 3.87361111111111 | 0.751 | 0.971 | 1.071 | 0.154 | 0.157 |
| 3.875 | 0.962 | 0.961 | 1.071 | 0.154 | 0.154 |
| 3.87638888888889 | 0.963 | 0.859 | 1.071 | 0.157 | 0.154 |
| 3.87777777777778 | 0.857 | 1.059 | 1.068 | 0.154 | 0.154 |
| 3.87916666666667 | 0.962 | 0.795 | 1.044 | 0.154 | 0.157 |
| 3.88055555555556 | 0.96 | 0.951 | 0.747 | 0.154 | 0.154 |
| 3.88194444444444 | 0.962 | 0.857 | 0.856 | 0.157 | 0.154 |
| 3.88333333333333 | 0.859 | 0.893 | 1.07 | 0.154 | 0.157 |
| 3.88472222222222 | 0.962 | 1.069 | 1.071 | 0.154 | 0.157 |
| 3.88611111111111 | 0.962 | 0.855 | 1.071 | 0.154 | 0.154 |
| 3.8875 | 0.962 | 0.858 | 0.858 | 0.154 | 0.152 |
| 3.88888888888889 | 0.647 | 0.859 | 0.859 | 0.152 | 0.155 |
| 3.89027777777778 | 0.859 | 1.171 | 0.856 | 0.152 | 0.157 |
| 3.89166666666667 | 0.96 | 0.961 | 0.962 | 0.154 | 0.155 |
| 3.89305555555556 | 0.856 | 0.857 | 0.962 | 0.154 | 0.155 |
| 3.89444444444444 | 0.962 | 0.777 | 1.071 | 0.154 | 0.155 |
| 3.89583333333333 | 0.41 | 0.961 | 1.07 | 0.154 | 0.155 |
| 3.89722222222222 | 0.858 | 0.859 | 0.964 | 0.154 | 0.155 |
| 3.89861111111111 | 0.86 | 0.855 | 0.964 | 0.154 | 0.155 |
| 3.9 | 0.86 | 0.857 | 0.747 | 0.154 | 0.155 |
| 3.90138888888889 | 0.962 | 0.749 | 0.857 | 0.154 | 0.155 |
| 3.90277777777778 | 0.962 | 0.858 | 0.963 | 0.154 | 0.155 |
| 3.90416666666667 | 0.96 | 0.749 | 1.069 | 0.154 | 0.157 |
| 3.90555555555556 | 0.86 | 0.881 | 1.068 | 0.152 | 1.577 |
| 3.90694444444444 | 0.858 | 0.753 | 0.416 | 0.154 | 1.376 |
| 3.90833333333333 | 0.961 | 0.859 | 0.535 | 0.154 | 1.271 |
| 3.90972222222222 | 0.747 | 0.857 | 0.643 | 0.154 | 1.272 |
| 3.91111111111111 | 0.747 | 0.857 | 0.747 | 0.154 | 1.375 |
| 3.9125 | 0.858 | 0.858 | 0.961 | 0.154 | 1.377 |
| 3.91388888888889 | 0.859 | 0.961 | 0.963 | 0.154 | 1.168 |
| 3.91527777777778 | 0.962 | 0.858 | 0.963 | 0.154 | 1.269 |
| 3.91666666666667 | 0.844 | 0.858 | 1.067 | 0.152 | 1.373 |
| 3.91805555555556 | 0.858 | 0.857 | 0.963 | 0.152 | 1.478 |
| 3.91944444444444 | 0.858 | 0.857 | 0.7 | 0.154 | 1.583 |
| 3.92083333333333 | 0.856 | 0.746 | 0.157 | 0.154 | 1.58 |
| 3.92222222222222 | 0.856 | 0.644 | 0.748 | 0.154 | 1.579 |
| 3.92361111111111 | 0.963 | 0.857 | 0.857 | 0.152 | 1.064 |
| 3.925 | 0.866 | 0.953 | 0.963 | 0.152 | 0.742 |
| 3.92638888888889 | 0.962 | 0.86 | 0.963 | 0.154 | 0.574 |
| 3.92777777777778 | 0.857 | 0.854 | 1.067 | 0.154 | 0.744 |
| 3.92916666666667 | 0.75 | 0.968 | 1.07 | 0.154 | 0.739 |
| 3.93055555555556 | 0.858 | 0.857 | 0.313 | 0.154 | 0.554 |
| 3.93194444444444 | 0.965 | 0.857 | 0.16 | 0.152 | 0.739 |
| 3.93333333333333 | 0.858 | 0.859 | 0.789 | 0.154 | 0.742 |
| 3.93472222222222 | 0.856 | 0.864 | 0.856 | 0.152 | 0.741 |
| 3.93611111111111 | 0.858 | 0.961 | 1.069 | 0.154 | 0.741 |
| 3.9375 | 0.748 | 0.86 | 1.071 | 0.154 | 0.741 |
| 3.93888888888889 | 0.64 | 0.857 | 1.069 | 0.152 | 0.741 |
| 3.94027777777778 | 0.804 | 0.744 | 0.748 | 0.152 | 0.743 |
| 3.94166666666667 | 0.965 | 0.858 | 0.963 | 0.157 | 0.739 |
| 3.94305555555556 | 0.96 | 0.749 | 0.963 | 0.154 | 0.741 |
| 3.94444444444444 | 0.859 | 0.963 | 0.76 | 0.154 | 0.636 |
| 3.94583333333333 | 0.962 | 0.855 | 0.288 | 0.154 | 0.638 |
| 3.94722222222222 | 0.961 | 0.857 | 0.798 | 0.154 | 0.154 |
| 3.94861111111111 | 0.964 | 0.961 | 0.959 | 0.154 | 0.741 |
| 3.95 | 0.859 | 0.643 | 0.965 | 0.154 | 0.53 |
| 3.95138888888889 | 0.96 | 0.858 | 1.069 | 0.154 | 0.742 |
| 3.95277777777778 | 0.962 | 0.858 | 0.857 | 0.154 | 0.741 |
| 3.95416666666667 | 0.963 | 0.86 | 0.748 | 0.154 | 0.739 |
| 3.95555555555556 | 1.068 | 0.859 | 0.858 | 0.154 | 0.738 |
| 3.95694444444444 | 1.065 | 0.857 | 0.964 | 0.224 | 0.741 |
| 3.95833333333333 | 0.962 | 0.86 | 0.993 | 1.267 | 0.739 |
| 3.95972222222222 | 0.748 | 0.857 | 0.167 | 1.171 | 0.741 |
| 3.96111111111111 | 0.7 | 0.749 | 0.16 | 1.371 | 0.738 |
| 3.9625 | 0.963 | 0.855 | 0.644 | 1.373 | 0.529 |
| 3.96388888888889 | 0.961 | 0.648 | 0.854 | 1.265 | 0.529 |
| 3.96527777777778 | 0.858 | 0.86 | 0.963 | 1.167 | 0.743 |
| 3.96666666666667 | 0.964 | 0.882 | 1.07 | 1.373 | 0.154 |
| 3.96805555555556 | 0.961 | 0.856 | 1.071 | 1.399 | 0.157 |
| 3.96944444444444 | 0.963 | 0.858 | 0.963 | 1.579 | 0.154 |
| 3.97083333333333 | 0.857 | 0.857 | 0.858 | 1.579 | 0.154 |
| 3.97222222222222 | 0.96 | 0.86 | 0.158 | 1.579 | 0.154 |
| 3.97361111111111 | 0.961 | 0.961 | 0.434 | 1.68 | 0.157 |
| 3.975 | 0.858 | 0.858 | 0.644 | 1.679 | 0.154 |
| 3.97638888888889 | 0.858 | 0.855 | 0.644 | 1.473 | 0.154 |
| 3.97777777777778 | 0.858 | 0.749 | 0.861 | 1.579 | 0.154 |
| 3.97916666666667 | 0.964 | 0.857 | 0.961 | 1.577 | 0.154 |
| 3.98055555555556 | 0.86 | 0.858 | 0.654 | 1.577 | 0.154 |
| 3.98194444444444 | 0.534 | 0.858 | 0.857 | 1.579 | 0.154 |
| 3.98333333333333 | 0.862 | 0.641 | 0.963 | 0.64 | 0.154 |
| 3.98472222222222 | 0.751 | 0.534 | 0.967 | 0.851 | 0.154 |
| 3.98611111111111 | 0.858 | 0.857 | 0.417 | 0.638 | 0.152 |
| 3.9875 | 0.859 | 0.857 | 0.16 | 0.744 | 0.157 |
| 3.98888888888889 | 0.963 | 0.746 | 0.748 | 0.741 | 0.154 |
| 3.99027777777778 | 0.859 | 0.749 | 0.857 | 0.741 | 0.156 |
| 3.99166666666667 | 0.963 | 0.857 | 0.963 | 0.741 | 0.157 |
| 3.99305555555556 | 0.963 | 0.749 | 1.071 | 0.417 | 0.154 |
| 3.99444444444444 | 0.963 | 0.854 | 0.16 | 0.74 | 0.154 |
| 3.99583333333333 | 0.961 | 0.748 | 0.746 | 0.741 | 0.154 |
| 3.99722222222222 | 0.963 | 0.859 | 0.856 | 0.744 | 0.154 |
| 3.99861111111111 | 0.858 | 0.859 | 0.749 | 0.741 | 0.154 |
| 4.0 | 0.96 | 0.854 | 0.781 | 0.741 | 0.152 |
| 4.00138888888889 | 0.962 | 0.858 | 0.748 | 0.741 | 0.154 |
| 4.00277777777778 | 0.75 | 0.746 | 0.857 | 0.741 | 0.154 |
| 4.00416666666667 | 0.643 | 0.963 | 0.963 | 0.741 | 0.152 |
| 4.00555555555556 | 0.859 | 0.642 | 0.961 | 0.738 | 0.152 |
| 4.00694444444445 | 0.856 | 0.859 | 0.303 | 0.743 | 0.154 |
| 4.00833333333333 | 0.748 | 0.856 | 0.16 | 0.537 | 0.157 |
| 4.00972222222222 | 0.748 | 0.839 | 0.774 | 0.154 | 0.154 |
| 4.01111111111111 | 0.613 | 0.961 | 0.856 | 0.154 | 0.152 |
| 4.0125 | 0.858 | 0.961 | 0.962 | 0.306 | 0.154 |
| 4.01388888888889 | 0.961 | 0.857 | 0.743 | 0.417 | 0.154 |
| 4.01527777777778 | 0.963 | 0.643 | 0.16 | 0.154 | 0.154 |
| 4.01666666666667 | 0.96 | 0.857 | 0.158 | 0.154 | 0.154 |
| 4.01805555555556 | 0.963 | 0.749 | 0.75 | 0.154 | 0.154 |
| 4.01944444444445 | 0.962 | 0.746 | 0.16 | 0.154 | 0.152 |
| 4.02083333333333 | 0.962 | 0.749 | 0.16 | 0.157 | 0.157 |
| 4.02222222222222 | 0.861 | 0.642 | 0.16 | 0.154 | 0.154 |
| 4.02361111111111 | 0.859 | 0.526 | 0.158 | 0.152 | 0.154 |
| 4.025 | 0.539 | 0.746 | 0.16 | 0.154 | 0.157 |
| 4.02638888888889 | 0.167 | 0.684 | 0.16 | 0.154 | 0.154 |
| 4.02777777777778 | 0.857 | 0.963 | 0.158 | 0.154 | 0.159 |
| 4.02916666666667 | 0.859 | 0.858 | 0.16 | 0.154 | 0.154 |
| 4.03055555555556 | 0.852 | 0.858 | 0.16 | 0.154 | 0.154 |
| 4.03194444444444 | 0.751 | 0.857 | 0.158 | 0.152 | 0.154 |
| 4.03333333333333 | 0.748 | 0.859 | 0.16 | 0.154 | 0.157 |
| 4.03472222222222 | 0.857 | 0.857 | 0.158 | 0.154 | 0.154 |
| 4.03611111111111 | 0.858 | 0.857 | 0.16 | 0.154 | 0.154 |
| 4.0375 | 0.861 | 0.644 | 0.158 | 0.154 | 0.154 |
| 4.03888888888889 | 0.962 | 0.818 | 0.158 | 0.152 | 0.157 |
| 4.04027777777778 | 1.068 | 0.746 | 0.158 | 0.154 | 0.152 |
| 4.04166666666667 | 0.962 | 0.747 | 0.163 | 0.154 | 0.154 |
| 4.04305555555556 | 0.856 | 0.643 | 0.16 | 0.152 | 0.157 |
| 4.04444444444444 | 0.963 | 1.066 | 0.158 | 0.152 | 0.152 |
| 4.04583333333333 | 0.962 | 0.96 | 0.158 | 0.152 | 0.157 |
| 4.04722222222222 | 0.642 | 0.746 | 0.158 | 0.154 | 0.154 |
| 4.04861111111111 | 0.75 | 0.751 | 0.158 | 0.152 | 0.157 |
| 4.05 | 0.86 | 0.748 | 0.16 | 0.152 | 1.844 |
| 4.05138888888889 | 0.779 | 0.748 | 0.16 | 0.154 | 1.581 |
| 4.05277777777778 | 0.75 | 0.746 | 0.158 | 0.152 | 1.581 |
| 4.05416666666667 | 0.857 | 0.746 | 0.16 | 0.152 | 1.583 |
| 4.05555555555556 | 0.749 | 0.747 | 0.16 | 0.152 | 1.476 |
| 4.05694444444444 | 0.963 | 0.746 | 0.158 | 0.154 | 1.584 |
| 4.05833333333333 | 0.962 | 0.857 | 0.16 | 0.154 | 1.579 |
| 4.05972222222222 | 0.96 | 0.746 | 0.157 | 0.154 | 1.579 |
| 4.06111111111111 | 1.067 | 0.747 | 0.157 | 0.152 | 1.067 |
| 4.0625 | 0.962 | 0.749 | 0.16 | 0.154 | 0.154 |
| 4.06388888888889 | 0.858 | 0.81 | 0.158 | 0.154 | 0.849 |
| 4.06527777777778 | 0.962 | 0.858 | 0.158 | 0.154 | 0.53 |
| 4.06666666666667 | 0.962 | 0.749 | 0.16 | 0.154 | 0.741 |
| 4.06805555555556 | 0.644 | 0.748 | 0.158 | 0.152 | 0.741 |
| 4.06944444444445 | 0.748 | 0.748 | 0.158 | 0.154 | 0.74 |
| 4.07083333333333 | 0.855 | 0.747 | 0.16 | 0.152 | 0.738 |
| 4.07222222222222 | 0.645 | 0.16 | 0.16 | 0.152 | 0.743 |
| 4.07361111111111 | 0.857 | 0.16 | 0.16 | 0.152 | 0.74 |
| 4.075 | 0.96 | 0.16 | 0.16 | 0.154 | 0.742 |
| 4.07638888888889 | 0.961 | 0.16 | 0.158 | 0.154 | 0.737 |
| 4.07777777777778 | 0.963 | 0.157 | 0.158 | 0.154 | 0.639 |
| 4.07916666666667 | 0.857 | 0.16 | 0.16 | 0.152 | 0.306 |
| 4.08055555555556 | 0.963 | 0.157 | 0.158 | 0.152 | 0.634 |
| 4.08194444444445 | 0.964 | 0.157 | 0.158 | 0.152 | 0.742 |
| 4.08333333333333 | 0.963 | 0.157 | 0.16 | 0.152 | 0.74 |
| 4.08472222222222 | 0.961 | 0.157 | 0.158 | 0.154 | 0.74 |
| 4.08611111111111 | 0.413 | 0.157 | 0.16 | 0.152 | 0.74 |
| 4.0875 | 0.645 | 0.16 | 0.158 | 0.154 | 0.743 |
| 4.08888888888889 | 0.747 | 0.157 | 0.157 | 0.152 | 0.635 |
| 4.09027777777778 | 0.16 | 0.157 | 0.158 | 0.154 | 0.741 |
| 4.09166666666667 | 0.746 | 0.157 | 0.158 | 0.154 | 0.637 |
| 4.09305555555556 | 0.646 | 0.16 | 0.16 | 0.154 | 0.741 |
| 4.09444444444444 | 0.86 | 0.16 | 0.16 | 0.152 | 0.741 |
| 4.09583333333333 | 0.857 | 0.157 | 0.158 | 0.154 | 0.154 |
| 4.09722222222222 | 0.963 | 0.157 | 0.16 | 0.152 | 0.847 |
| 4.09861111111111 | 0.963 | 0.157 | 0.157 | 1.412 | 0.739 |
| 4.1 | 0.413 | 0.157 | 0.157 | 1.369 | 0.154 |
| 4.10138888888889 | 0.645 | 0.162 | 0.16 | 1.476 | 0 |
| 4.10277777777778 | 0.644 | 0.157 | 0.16 | 1.577 | 0 |
| 4.10416666666667 | 0.857 | 0.16 | 1.073 | 1.577 | 0 |
| 4.10555555555556 | 0.962 | 0.157 | 1.277 | 1.679 | 0 |
| 4.10694444444444 | 0.962 | 0.157 | 1.378 | 1.681 | 0 |
| 4.10833333333333 | 0.961 | 0.16 | 1.377 | 1.886 | 0 |
| 4.10972222222222 | 0.964 | 0.157 | 1.275 | 1.887 | 0 |
| 4.11111111111111 | 0.409 | 0.157 | 1.379 | 1.646 | 0 |
| 4.1125 | 0.157 | 0.157 | 1.378 | 1.374 | 0 |
| 4.11388888888889 | 0.749 | 0.16 | 1.179 | 1.371 | 0 |
| 4.11527777777778 | 0.86 | 0.157 | 0.433 | 1.163 | 0 |
| 4.11666666666667 | 0.858 | 0.16 | 0.924 | 1.373 | 0 |
| 4.11805555555556 | 0.963 | 0.157 | 0.965 | 1.373 | 0 |
| 4.11944444444444 | 0.963 | 0.16 | 0.964 | 1.521 | 0 |
| 4.12083333333333 | 0.963 | 0.16 | 0.645 | 0.742 | 0 |
| 4.12222222222222 | 0.963 | 0.157 | 0.16 | 0.741 | 0 |
| 4.12361111111111 | 0.645 | 0.157 | 0.747 | 0.741 | 0 |
| 4.125 | 0.534 | 0.157 | 0.858 | 0.742 | 0 |
| 4.12638888888889 | 0.643 | 0.16 | 0.963 | 0.742 | 0 |
| 4.12777777777778 | 0.858 | 0.159 | 1.07 | 0.636 | 0 |
| 4.12916666666667 | 0.964 | 0.157 | 1.07 | 0.531 | 0 |
| 4.13055555555556 | 0.963 | 0.16 | 0.976 | 0.742 | 0 |
| 4.13194444444445 | 0.964 | 0.157 | 0.856 | 0.739 | 0 |
| 4.13333333333333 | 0.747 | 0.157 | 1.068 | 0.567 | 0 |
| 4.13472222222222 | 0.858 | 0.158 | 1.071 | 0.741 | 0 |
| 4.13611111111111 | 0.964 | 0.16 | 1.067 | 0.742 | 0 |
| 4.1375 | 0.742 | 0.157 | 1.072 | 0.742 | 0 |
| 4.13888888888889 | 0.532 | 0.16 | 0.421 | 0.742 | 0 |
| 4.14027777777778 | 0.744 | 0.157 | 0.158 | 0.741 | 0 |
| 4.14166666666667 | 0.86 | 0.157 | 0.414 | 0.742 | 0 |
| 4.14305555555556 | 0.86 | 0.16 | 0.532 | 0.636 | 0 |
| 4.14444444444445 | 0.961 | 0.16 | 0.856 | 0.638 | 0 |
| 4.14583333333333 | 0.963 | 0.157 | 0.962 | 0.526 | 0 |
| 4.14722222222222 | 0.857 | 0.157 | 0.964 | 0.741 | 0 |
| 4.14861111111111 | 0.92 | 0.16 | 0.963 | 0.74 | 0 |
| 4.15 | 0.746 | 0.16 | 0.536 | 0.744 | 0 |
| 4.15138888888889 | 0.859 | 0.16 | 0.413 | 0.742 | 0 |
| 4.15277777777778 | 0.861 | 0.16 | 0.64 | 0.638 | 0 |
| 4.15416666666667 | 0.157 | 0.157 | 0.86 | 0.742 | 0 |
| 4.15555555555556 | 0.157 | 1.593 | 0.964 | 0.742 | 0 |
| 4.15694444444444 | 0.746 | 1.584 | 1.068 | 0.739 | 0 |
| 4.15833333333333 | 0.859 | 1.475 | 0.416 | 0.739 | 0 |
| 4.15972222222222 | 0.857 | 1.276 | 0.157 | 0.742 | 0 |
| 4.16111111111111 | 0.859 | 1.208 | 0.848 | 0.742 | 0 |
| 4.1625 | 0.857 | 1.174 | 0.747 | 0.301 | 0 |
| 4.16388888888889 | 0.857 | 1.095 | 0.858 | 0.529 | 0 |
| 4.16527777777778 | 0.857 | 1.071 | 0.966 | 0.738 | 0 |
| 4.16666666666667 | 0.963 | 0.962 | 1.068 | 0.531 | 0 |
| 4.16805555555556 | 0.961 | 1.069 | 0.303 | 0 | 0 |
| 4.16944444444444 | 0.305 | 1.072 | 0.157 | 0 | 0 |
| 4.17083333333333 | 0.16 | 1.18 | 0.749 | 0 | 0 |
| 4.17222222222222 | 0.744 | 0.857 | 0.962 | 0 | 0 |
| 4.17361111111111 | 0.534 | 1.185 | 0.691 | 0 | 0 |
| 4.175 | 0.746 | 1.071 | 0.157 | 0 | 0 |
| 4.17638888888889 | 0.157 | 0.858 | 0.737 | 0 | 0 |
| 4.17777777777778 | 0.157 | 1.07 | 0.858 | 0 | 0 |
| 4.17916666666667 | 0.159 | 0.859 | 0.961 | 0 | 0 |
| 4.18055555555556 | 0.157 | 0.856 | 0.749 | 0 | 0 |
| 4.18194444444444 | 0.157 | 0.857 | 0.157 | 0 | 0 |
| 4.18333333333333 | 0.157 | 0.666 | 0.16 | 0 | 0 |
| 4.18472222222222 | 0.16 | 0.859 | 0.75 | 0 | 0 |
| 4.18611111111111 | 0.157 | 0.91 | 0.961 | 0 | 0 |
| 4.1875 | 0.159 | 0.856 | 0.964 | 0 | 0 |
| 4.18888888888889 | 0.157 | 0.858 | 1.068 | 0 | 0 |
| 4.19027777777778 | 0.159 | 0.774 | 0.303 | 0 | 0 |
| 4.19166666666667 | 0.16 | 0.858 | 0.158 | 0 | 0 |
| 4.19305555555556 | 0.157 | 0.859 | 0.75 | 0 | 0 |
| 4.19444444444445 | 0.16 | 0.962 | 0.965 | 0 | 0 |
| 4.19583333333333 | 0.157 | 0.856 | 1.066 | 0 | 0 |
| 4.19722222222222 | 0.16 | 0.962 | 0.16 | 0 | 0 |
| 4.19861111111111 | 0.157 | 0.859 | 0.157 | 0 | 0 |
| 4.2 | 0.16 | 0.75 | 0.749 | 0 | 0 |
| 4.20138888888889 | 0.157 | 0.857 | 0.857 | 0 | 0 |
| 4.20277777777778 | 0.157 | 0.658 | 0.57 | 0 | 0 |
| 4.20416666666667 | 0.157 | 0.856 | 0.749 | 0 | 0 |
| 4.20555555555556 | 0.155 | 0.858 | 0.16 | 0 | 0 |
| 4.20694444444445 | 0.16 | 0.856 | 0.157 | 0 | 0 |
| 4.20833333333333 | 0.157 | 0.858 | 0.157 | 0 | 0 |
| 4.20972222222222 | 0.157 | 0.859 | 0.157 | 0 | 0 |
| 4.21111111111111 | 0.155 | 0.859 | 0.157 | 0 | 0 |
| 4.2125 | 0.155 | 0.735 | 0.157 | 0 | 0 |
| 4.21388888888889 | 0.16 | 0.748 | 0.157 | 0 | 0 |
| 4.21527777777778 | 0.16 | 0.962 | 0.157 | 0 | 0 |
| 4.21666666666667 | 0.16 | 0.858 | 0.157 | 0 | 0 |
| 4.21805555555556 | 0.157 | 0.962 | 0.157 | 0 | 0 |
| 4.21944444444444 | 0.16 | 0.901 | 0.157 | 0 | 0 |
| 4.22083333333333 | 0.157 | 0.858 | 0.157 | 0 | 0 |
| 4.22222222222222 | 0.157 | 0.751 | 0.16 | 0 | 0 |
| 4.22361111111111 | 0.157 | 0.708 | 0.16 | 0 | 0 |
| 4.225 | 0.157 | 0.857 | 0.16 | 0 | 0 |
| 4.22638888888889 | 0.16 | 0.858 | 0.157 | 0 | 0 |
| 4.22777777777778 | 0.157 | 0.857 | 0.157 | 0 | 0 |
| 4.22916666666667 | 0.157 | 0.859 | 0.16 | 0 | 0 |
| 4.23055555555556 | 0.157 | 0.856 | 0.157 | 0 | 0 |
| 4.23194444444444 | 0.157 | 0.856 | 0.16 | 0 | 0 |
| 4.23333333333333 | 0.157 | 0.749 | 0.157 | 0 | 0 |
| 4.23472222222222 | 0.157 | 0.535 | 0.157 | 0 | 0 |
| 4.23611111111111 | 0.157 | 0.745 | 0.157 | 0 | 0 |
| 4.2375 | 0.16 | 0.75 | 0.155 | 0 | 0 |
| 4.23888888888889 | 0.157 | 0.749 | 0.16 | 0 | 0 |
| 4.24027777777778 | 0.157 | 0.749 | 0.155 | 0 | 0 |
| 4.24166666666667 | 0.157 | 0.749 | 0.16 | 0 | 0 |
| 4.24305555555556 | 0.16 | 0.641 | 0.16 | 0 | 0 |
| 4.24444444444444 | 0.157 | 0.749 | 0.158 | 0 | 0 |
| 4.24583333333333 | 0.157 | 0.749 | 0.157 | 0 | 0 |
| 4.24722222222222 | 0.16 | 0.157 | 0.16 | 0 | 0 |
| 4.24861111111111 | 0.16 | 0.158 | 0.16 | 0 | 0 |
| 4.25 | 0.157 | 0.16 | 0.155 | 0 | 0 |
| 4.25138888888889 | 0.157 | 0.16 | 0.16 | 0 | 0 |
| 4.25277777777778 | 0.157 | 0.16 | 0.157 | 0 | 0 |
| 4.25416666666667 | 0.157 | 0.157 | 0.155 | 0 | 0 |
| 4.25555555555556 | 0.157 | 0.157 | 0.157 | 0 | 0 |
| 4.25694444444445 | 0.157 | 0.157 | 0.157 | 0 | 0 |
| 4.25833333333333 | 0.157 | 0.157 | 0.157 | 0 | 0 |
| 4.25972222222222 | 0.157 | 0.16 | 0.16 | 0 | 0 |
| 4.26111111111111 | 1.079 | 0.158 | 0.16 | 0 | 0 |
| 4.2625 | 0.99 | 0.158 | 0.155 | 0 | 0 |
| 4.26388888888889 | 1.174 | 0.16 | 0.157 | 0 | 0 |
| 4.26527777777778 | 1.38 | 0.157 | 0.157 | 0 | 0 |
| 4.26666666666667 | 1.378 | 0.157 | 0.157 | 0 | 0 |
| 4.26805555555556 | 1.062 | 0.16 | 0.16 | 0 | 0 |
| 4.26944444444445 | 0.961 | 0.16 | 0.157 | 0 | 0 |
| 4.27083333333333 | 0.963 | 0.16 | 0.157 | 0 | 0 |
| 4.27222222222222 | 0.963 | 0.16 | 0.16 | 0 | 0 |
| 4.27361111111111 | 0.86 | 0.157 | 0.155 | 0 | 0 |
| 4.275 | 0.961 | 0.157 | 0.157 | 0 | 0 |
| 4.27638888888889 | 0.752 | 0.157 | 0.157 | 0 | 0 |
| 4.27777777777778 | 0.86 | 0.16 | 0.157 | 0 | 0 |
| 4.27916666666667 | 0.964 | 0.16 | 0.16 | 0 | 0 |
| 4.28055555555556 | 0.964 | 0.157 | 0.157 | 0 | 0 |
| 4.28194444444444 | 0.86 | 0.157 | 0.157 | 0 | 0 |
| 4.28333333333333 | 0.858 | 0.16 | 0.157 | 0 | 0 |
| 4.28472222222222 | 0.534 | 0.16 | 0.157 | 0 | 0 |
| 4.28611111111111 | 0.955 | 0.157 | 0.16 | 0 | 0 |
| 4.2875 | 0.962 | 0.16 | 0.157 | 0 | 0 |
| 4.28888888888889 | 0.962 | 0.157 | 0.157 | 0 | 0 |
| 4.29027777777778 | 0.962 | 0.16 | 0.965 | 0 | 0 |
| 4.29166666666667 | 0.75 | 0.16 | 1.072 | 0 | 0 |
| 4.29305555555556 | 0.745 | 0.16 | 1.074 | 0 | 0 |
| 4.29444444444444 | 0.856 | 0.16 | 1.069 | 0 | 0 |
| 4.29583333333333 | 0.6 | 0.157 | 1.072 | 0 | 0 |
| 4.29722222222222 | 0.749 | 0.16 | 1.072 | 0 | 0 |
| 4.29861111111111 | 0.962 | 0.157 | 1.071 | 0 | 0 |
| 4.3 | 0.961 | 0.16 | 0.963 | 0 | 0 |
| 4.30138888888889 | 0.963 | 0.162 | 0.962 | 0 | 0 |
| 4.30277777777778 | 0.964 | 0.155 | 0.856 | 0 | 0 |
| 4.30416666666667 | 0.964 | 0.157 | 0.747 | 0 | 0 |
| 4.30555555555556 | 0.824 | 0.157 | 0.963 | 0 | 0 |
| 4.30694444444444 | 0.747 | 0.16 | 0.963 | 0 | 0 |
| 4.30833333333333 | 0.858 | 0.157 | 0.645 | 0 | 0 |
| 4.30972222222222 | 0.966 | 0.157 | 0.789 | 0 | 0 |
| 4.31111111111111 | 0.964 | 0.157 | 1.069 | 0 | 0 |
| 4.3125 | 0.962 | 0.157 | 0.96 | 0 | 0 |
| 4.31388888888889 | 0.964 | 0.16 | 1.066 | 0 | 0 |
| 4.31527777777778 | 0.861 | 0.157 | 1.071 | 0 | 0 |
| 4.31666666666667 | 0.748 | 0.157 | 0.965 | 0 | 0 |
| 4.31805555555556 | 0.926 | 0.155 | 0.411 | 0 | 0 |
| 4.31944444444445 | 0.416 | 0.157 | 0.16 | 0 | 0 |
| 4.32083333333333 | 0.663 | 0.157 | 0.859 | 0 | 0 |
| 4.32222222222222 | 0.86 | 0.155 | 1.065 | 0 | 0 |
| 4.32361111111111 | 0.861 | 0.157 | 0.16 | 0 | 0 |
| 4.325 | 0.962 | 0.16 | 0.717 | 0 | 0 |
| 4.32638888888889 | 0.744 | 0.16 | 0.857 | 0 | 0 |
| 4.32777777777778 | 0.16 | 0.16 | 1.064 | 0 | 0 |
| 4.32916666666667 | 0.58 | 0.157 | 0.855 | 0 | 0 |
| 4.33055555555556 | 0.744 | 0.157 | 0.645 | 0 | 0 |
| 4.33194444444445 | 0.747 | 1.79 | 0.963 | 0 | 0 |
| 4.33333333333333 | 0.86 | 1.475 | 1.067 | 0 | 0 |
| 4.33472222222222 | 0.961 | 1.377 | 0.189 | 0 | 0 |
| 4.33611111111111 | 0.416 | 1.274 | 0.747 | 0 | 0 |
| 4.3375 | 0.747 | 1.272 | 0.857 | 0 | 0 |
| 4.33888888888889 | 0.645 | 1.274 | 0.96 | 0 | 0 |
| 4.34027777777778 | 0.86 | 0.961 | 0.416 | 0 | 0 |
| 4.34166666666667 | 0.964 | 1.069 | 0.16 | 0 | 0 |
| 4.34305555555556 | 0.532 | 0.645 | 0.643 | 0 | 0 |
| 4.34444444444444 | 0.157 | 0.839 | 0.45 | 0 | 0 |
| 4.34583333333333 | 0.745 | 0.961 | 0.643 | 0 | 0 |
| 4.34722222222222 | 0.858 | 0.858 | 0.86 | 0 | 0 |
| 4.34861111111111 | 0.155 | 1.072 | 0.961 | 0 | 0 |
| 4.35 | 0.157 | 0.959 | 0.157 | 0 | 0 |
| 4.35138888888889 | 0.157 | 0.962 | 0.167 | 0 | 0 |
| 4.35277777777778 | 0.157 | 0.858 | 0.645 | 0 | 0 |
| 4.35416666666667 | 0.158 | 0.858 | 0.157 | 0 | 0 |
| 4.35555555555556 | 0.157 | 0.859 | 0.157 | 0 | 0 |
| 4.35694444444444 | 0.157 | 0.857 | 0.16 | 0 | 0 |
| 4.35833333333333 | 0.16 | 0.857 | 0.157 | 0 | 0 |
| 4.35972222222222 | 0.16 | 0.857 | 0.157 | 0 | 0 |
| 4.36111111111111 | 0.16 | 0.978 | 0.157 | 0 | 0 |
| 4.3625 | 0.155 | 0.752 | 0.157 | 0 | 0 |
| 4.36388888888889 | 0.157 | 0.855 | 0.157 | 0 | 0 |
| 4.36527777777778 | 0.155 | 0.857 | 0.157 | 0 | 0 |
| 4.36666666666667 | 0.157 | 0.669 | 0.16 | 0 | 0 |
| 4.36805555555556 | 0.157 | 0.86 | 0.157 | 0 | 0 |
| 4.36944444444444 | 0.157 | 0.86 | 0.157 | 0 | 0 |
| 4.37083333333333 | 0.157 | 0.86 | 0.157 | 0 | 0 |
| 4.37222222222222 | 0.157 | 0.855 | 0.16 | 0 | 0 |
| 4.37361111111111 | 0.157 | 0.856 | 0.157 | 0 | 0 |
| 4.375 | 0.157 | 0.86 | 0.157 | 0 | 0 |
| 4.37638888888889 | 0.157 | 0.86 | 0.157 | 0 | 0 |
| 4.37777777777778 | 0.16 | 0.857 | 0.16 | 0 | 0 |
| 4.37916666666667 | 0.157 | 0.857 | 0.16 | 0 | 0 |
| 4.38055555555556 | 0.157 | 0.859 | 0.157 | 0 | 0 |
| 4.38194444444445 | 0.16 | 0.742 | 0.16 | 0 | 0 |
| 4.38333333333333 | 0.157 | 0.75 | 0.16 | 0 | 0 |
| 4.38472222222222 | 0.16 | 0.749 | 0.155 | 0 | 0 |
| 4.38611111111111 | 0.157 | 0.749 | 0.158 | 0 | 0 |
| 4.3875 | 0.157 | 0.747 | 0.16 | 0 | 0 |
| 4.38888888888889 | 0.157 | 0.746 | 0.16 | 0 | 0 |
| 4.39027777777778 | 0.157 | 0.749 | 0.16 | 0 | 0 |
| 4.39166666666667 | 0.157 | 0.749 | 0.155 | 0 | 0 |
| 4.39305555555556 | 0.16 | 0.746 | 0.157 | 0 | 0 |
| 4.39444444444445 | 0.157 | 0.749 | 0.158 | 0 | 0 |
| 4.39583333333333 | 0.16 | 0.746 | 0.16 | 0 | 0 |
| 4.39722222222222 | 0.157 | 0.744 | 0.16 | 0 | 0 |
| 4.39861111111111 | 0.16 | 0.75 | 0.16 | 0 | 0 |
| 4.4 | 0.157 | 0.749 | 0.158 | 0 | 0 |
| 4.40138888888889 | 0.157 | 0.747 | 0.16 | 0 | 0 |
| 4.40277777777778 | 0.16 | 0.38 | 0.157 | 0 | 0 |
| 4.40416666666667 | 0.157 | 0.16 | 0.157 | 0 | 0 |
| 4.40555555555556 | 0.157 | 0.157 | 0.16 | 0 | 0 |
| 4.40694444444444 | 0.157 | 0.16 | 0.158 | 0 | 0 |
| 4.40833333333333 | 0.157 | 0.16 | 0.158 | 0 | 0 |
| 4.40972222222222 | 0.157 | 0.16 | 0.158 | 0 | 0 |
| 4.41111111111111 | 0.157 | 0.157 | 0.158 | 0 | 0 |
| 4.4125 | 0.157 | 0.157 | 0.158 | 0 | 0 |
| 4.41388888888889 | 0.155 | 0.16 | 0.16 | 0 | 0 |
| 4.41527777777778 | 0.157 | 0.16 | 0.157 | 0 | 0 |
| 4.41666666666667 | 0.16 | 0.155 | 0.157 | 0 | 0 |
| 4.41805555555556 | 0.157 | 0.157 | 0.16 | 0 | 0 |
| 4.41944444444444 | 0.157 | 0.16 | 0.157 | 0 | 0 |
| 4.42083333333333 | 0.16 | 0.157 | 0.157 | 0 | 0 |
| 4.42222222222222 | 0.157 | 0.16 | 0.157 | 0 | 0 |
| 4.42361111111111 | 0.16 | 0.155 | 0.16 | 0 | 0 |
| 4.425 | 0.157 | 0.157 | 0.162 | 0 | 0 |
| 4.42638888888889 | 0.155 | 0.157 | 0.157 | 0 | 0 |
| 4.42777777777778 | 0.16 | 0.16 | 0.157 | 0 | 0 |
| 4.42916666666667 | 0.16 | 0.16 | 0.157 | 0 | 0 |
| 4.43055555555556 | 0.157 | 0.16 | 0.158 | 0 | 0 |
| 4.43194444444444 | 1.479 | 0.16 | 0.157 | 0 | 0 |
| 4.43333333333333 | 1.075 | 0.157 | 0.158 | 0 | 0 |
| 4.43472222222222 | 1.072 | 0.158 | 0.158 | 0 | 0 |
| 4.43611111111111 | 0.86 | 0.158 | 0.158 | 0 | 0 |
| 4.4375 | 1.068 | 0.16 | 1.273 | 0 | 0 |
| 4.43888888888889 | 0.964 | 0.16 | 1.07 | 0 | 0 |
| 4.44027777777778 | 0.858 | 0.158 | 1.071 | 0 | 0 |
| 4.44166666666667 | 0.964 | 0.158 | 0.861 | 0 | 0 |
| 4.44305555555556 | 0.961 | 0.155 | 0.858 | 0 | 0 |
| 4.44444444444445 | 0.86 | 0.157 | 0.75 | 0 | 0 |
| 4.44583333333333 | 0.858 | 0.157 | 0.858 | 0 | 0 |
| 4.44722222222222 | 0.858 | 0.157 | 0.962 | 0 | 0 |
| 4.44861111111111 | 0.961 | 0.16 | 0.964 | 0 | 0 |
| 4.45 | 0.963 | 0.16 | 1.073 | 0 | 0 |
| 4.45138888888889 | 0.964 | 0.158 | 1.066 | 0 | 0 |
| 4.45277777777778 | 0.892 | 0.16 | 1.068 | 0 | 0 |
| 4.45416666666667 | 0.964 | 0.16 | 0.965 | 0 | 0 |
| 4.45555555555556 | 0.857 | 0.16 | 0.964 | 0 | 0 |
| 4.45694444444445 | 0.645 | 0.16 | 1.065 | 0 | 0 |
| 4.45833333333333 | 0.643 | 0.157 | 1.067 | 0 | 0 |
| 4.45972222222222 | 0.858 | 0.159 | 0.414 | 0 | 0 |
| 4.46111111111111 | 0.858 | 0.157 | 0.16 | 0 | 0 |
| 4.4625 | 0.961 | 0.157 | 0.75 | 0 | 0 |
| 4.46388888888889 | 0.961 | 0.158 | 0.538 | 0 | 0 |
| 4.46527777777778 | 0.858 | 0.16 | 0.537 | 0 | 0 |
| 4.46666666666667 | 0.961 | 0.157 | 0.757 | 0 | 0 |
| 4.46805555555556 | 0.964 | 0.157 | 0.964 | 0 | 0 |
| 4.46944444444444 | 0.963 | 0.16 | 0.962 | 0 | 0 |
| 4.47083333333333 | 0.91 | 0.158 | 0.752 | 0 | 0 |
| 4.47222222222222 | 0.963 | 0.16 | 0.157 | 0 | 0 |
| 4.47361111111111 | 0.961 | 0.16 | 0.162 | 0 | 0 |
| 4.475 | 0.962 | 0.158 | 0.644 | 0 | 0 |
| 4.47638888888889 | 0.836 | 0.158 | 0.963 | 0 | 0 |
| 4.47777777777778 | 0.303 | 0.16 | 0.963 | 0 | 0 |
| 4.47916666666667 | 0.409 | 0.16 | 1.064 | 0 | 0 |
| 4.48055555555556 | 0.532 | 0.158 | 0.409 | 0 | 0 |
| 4.48194444444444 | 0.747 | 0.16 | 0.158 | 0 | 0 |
| 4.48333333333333 | 0.846 | 0.158 | 0.75 | 0 | 0 |
| 4.48472222222222 | 0.857 | 0.16 | 0.643 | 0 | 0 |
| 4.48611111111111 | 0.963 | 0.16 | 0.416 | 0 | 0 |
| 4.4875 | 0.534 | 0.158 | 0.532 | 0 | 0 |
| 4.48888888888889 | 0.642 | 0.158 | 0.75 | 0 | 0 |
| 4.49027777777778 | 0.86 | 1.273 | 0.162 | 0 | 0 |
| 4.49166666666667 | 0.858 | 1.475 | 0.288 | 0 | 0 |
| 4.49305555555556 | 0.963 | 1.378 | 0 | 0 | 0 |
| 4.49444444444444 | 0.645 | 1.277 | 0 | 0 | 0 |
| 4.49583333333333 | 0.321 | 1.274 | 0 | 0 | 0 |
| 4.49722222222222 | 0.744 | 1.273 | 0 | 0 | 0 |
| 4.49861111111111 | 0.893 | 0.86 | 0 | 0 | 0 |
| 4.5 | 0.548 | 1.171 | 0 | 0 | 0 |
| 4.50138888888889 | 0.414 | 0.858 | 0 | 0 | 0 |
| 4.50277777777778 | 0.746 | 0.964 | 0 | 0 | 0 |
| 4.50416666666667 | 0.665 | 0.748 | 0 | 0 | 0 |
| 4.50555555555556 | 0.744 | 0.773 | 0 | 0 | 0 |
| 4.50694444444445 | 0.264 | 0.748 | 0 | 0 | 0 |
| 4.50833333333333 | 0.157 | 0.857 | 0 | 0 | 0 |
| 4.50972222222222 | 0.157 | 0.859 | 0 | 0 | 0 |
| 4.51111111111111 | 0.157 | 0.859 | 0 | 0 | 0 |
| 4.5125 | 0.157 | 0.748 | 0 | 0 | 0 |
| 4.51388888888889 | 0.157 | 0.761 | 0 | 0 | 0 |
| 4.51527777777778 | 0.16 | 0.855 | 0 | 0 | 0 |
| 4.51666666666667 | 0.157 | 0.748 | 0 | 0 | 0 |
| 4.51805555555556 | 0.155 | 0.763 | 0 | 0 | 0 |
| 4.51944444444445 | 0.157 | 0.645 | 0 | 0 | 0 |
| 4.52083333333333 | 0.16 | 0.857 | 0 | 0 | 0 |
| 4.52222222222222 | 0.157 | 0.749 | 0 | 0 | 0 |
| 4.52361111111111 | 0.157 | 0.645 | 0 | 0 | 0 |
| 4.525 | 0.157 | 0.748 | 0 | 0 | 0 |
| 4.52638888888889 | 0.157 | 0.644 | 0 | 0 | 0 |
| 4.52777777777778 | 0.157 | 0.857 | 0 | 0 | 0 |
| 4.52916666666667 | 0.157 | 0.858 | 0 | 0 | 0 |
| 4.53055555555556 | 0.16 | 0.858 | 0 | 0 | 0 |
| 4.53194444444444 | 0.157 | 0.86 | 0 | 0 | 0 |
| 4.53333333333333 | 0.157 | 0.859 | 0 | 0 | 0 |
| 4.53472222222222 | 0.157 | 0.857 | 0 | 0 | 0 |
| 4.53611111111111 | 0.157 | 0.857 | 0 | 0 | 0 |
| 4.5375 | 0.155 | 0.751 | 0 | 0 | 0 |
| 4.53888888888889 | 0.155 | 0.75 | 0 | 0 | 0 |
| 4.54027777777778 | 0.157 | 0.749 | 0 | 0 | 0 |
| 4.54166666666667 | 0.16 | 0.514 | 0 | 0 | 0 |
| 4.54305555555556 | 0.157 | 0.536 | 0 | 0 | 0 |
| 4.54444444444444 | 0.157 | 0.859 | 0 | 0 | 0 |
| 4.54583333333333 | 0.16 | 0.751 | 0 | 0 | 0 |
| 4.54722222222222 | 0.157 | 0.545 | 0 | 0 | 0 |
| 4.54861111111111 | 0.16 | 0.828 | 0 | 0 | 0 |
| 4.55 | 0.157 | 0.858 | 0 | 0 | 0 |
| 4.55138888888889 | 0.16 | 0.855 | 0 | 0 | 0 |
| 4.55277777777778 | 0.157 | 0 | 0 | 0 | 0 |
| 4.55416666666667 | 0.157 | 0 | 0 | 0 | 0 |
| 4.55555555555556 | 0.157 | 0 | 0 | 0 | 0 |
| 4.55694444444444 | 0.16 | 0 | 0 | 0 | 0 |
| 4.55833333333333 | 0.16 | 0 | 0 | 0 | 0 |
| 4.55972222222222 | 0.157 | 0 | 0 | 0 | 0 |
| 4.56111111111111 | 0.157 | 0 | 0 | 0 | 0 |
| 4.5625 | 0.16 | 0 | 0 | 0 | 0 |
| 4.56388888888889 | 0.16 | 0 | 0 | 0 | 0 |
| 4.56527777777778 | 0.16 | 0 | 0 | 0 | 0 |
| 4.56666666666667 | 0.157 | 0 | 0 | 0 | 0 |
| 4.56805555555556 | 0.16 | 0 | 0 | 0 | 0 |
| 4.56944444444445 | 0.16 | 0 | 0 | 0 | 0 |
| 4.57083333333333 | 0.157 | 0 | 0 | 0 | 0 |
| 4.57222222222222 | 0.157 | 0 | 0 | 0 | 0 |
| 4.57361111111111 | 0.157 | 0 | 0 | 0 | 0 |
| 4.575 | 0.157 | 0 | 0 | 0 | 0 |
| 4.57638888888889 | 0.16 | 0 | 0 | 0 | 0 |
| 4.57777777777778 | 0.16 | 0 | 0 | 0 | 0 |
| 4.57916666666667 | 0.16 | 0 | 0 | 0 | 0 |
| 4.58055555555556 | 0.157 | 0 | 0 | 0 | 0 |
| 4.58194444444445 | 0.157 | 0 | 0 | 0 | 0 |
| 4.58333333333333 | 0.157 | 0 | 0 | 0 | 0 |
| 4.58472222222222 | 0.157 | 0 | 0 | 0 | 0 |
| 4.58611111111111 | 0.157 | 0 | 0 | 0 | 0 |
| 4.5875 | 0.157 | 0 | 0 | 0 | 0 |
| 4.58888888888889 | 0.157 | 0 | 0 | 0 | 0 |
| 4.59027777777778 | 0.157 | 0 | 0 | 0 | 0 |
| 4.59166666666667 | 1.278 | 0 | 0 | 0 | 0 |
| 4.59305555555556 | 1.275 | 0 | 0 | 0 | 0 |
| 4.59444444444444 | 1.38 | 0 | 0 | 0 | 0 |
| 4.59583333333333 | 1.379 | 0 | 0 | 0 | 0 |
| 4.59722222222222 | 1.476 | 0 | 0 | 0 | 0 |
| 4.59861111111111 | 0.677 | 0 | 0 | 0 | 0 |
| 4.6 | 0.749 | 0 | 0 | 0 | 0 |
| 4.60138888888889 | 0.894 | 0 | 0 | 0 | 0 |
| 4.60277777777778 | 0.96 | 0 | 0 | 0 | 0 |
| 4.60416666666667 | 0.963 | 0 | 0 | 0 | 0 |
| 4.60555555555556 | 0.965 | 0 | 0 | 0 | 0 |
| 4.60694444444444 | 0.962 | 0 | 0 | 0 | 0 |
| 4.60833333333333 | 0.965 | 0 | 0 | 0 | 0 |
| 4.60972222222222 | 0.646 | 0 | 0 | 0 | 0 |
| 4.61111111111111 | 0.748 | 0 | 0 | 0 | 0 |
| 4.6125 | 0.861 | 0 | 0 | 0 | 0 |
| 4.61388888888889 | 0.964 | 0 | 0 | 0 | 0 |
| 4.61527777777778 | 0.965 | 0 | 0 | 0 | 0 |
| 4.61666666666667 | 1.068 | 0 | 0 | 0 | 0 |
| 4.61805555555556 | 0.962 | 0 | 0 | 0 | 0 |
| 4.61944444444444 | 0.962 | 0 | 0 | 0 | 0 |
| 4.62083333333333 | 0.858 | 0 | 0 | 0 | 0 |
| 4.62222222222222 | 0.947 | 0 | 0 | 0 | 0 |
| 4.62361111111111 | 0.744 | 0 | 0 | 0 | 0 |
| 4.625 | 0.86 | 0 | 0 | 0 | 0 |
| 4.62638888888889 | 0.964 | 0 | 0 | 0 | 0 |
| 4.62777777777778 | 0.416 | 0 | 0 | 0 | 0 |
| 4.62916666666667 | 0.747 | 0 | 0 | 0 | 0 |
| 4.63055555555556 | 0.535 | 0 | 0 | 0 | 0 |
| 4.63194444444445 | 0.745 | 0 | 0 | 0 | 0 |
| 4.63333333333333 | 0.86 | 0 | 0 | 0 | 0 |
| 4.63472222222222 | 0.962 | 0 | 0 | 0 | 0 |
| 4.63611111111111 | 0.964 | 0 | 0 | 0 | 0 |
| 4.6375 | 0.416 | 0 | 0 | 0 | 0 |
| 4.63888888888889 | 0.665 | 0 | 0 | 0 | 0 |
| 4.64027777777778 | 0.963 | 0 | 0 | 0 | 0 |
| 4.64166666666667 | 0.858 | 0 | 0 | 0 | 0 |
| 4.64305555555556 | 0.535 | 0 | 0 | 0 | 0 |
| 4.64444444444445 | 0.645 | 0 | 0 | 0 | 0 |
| 4.64583333333333 | 0.86 | 0 | 0 | 0 | 0 |
| 4.64722222222222 | 0.645 | 0 | 0 | 0 | 0 |
| 4.64861111111111 | 0.86 | 0 | 0 | 0 | 0 |
| 4.65 | 0.964 | 0 | 0 | 0 | 0 |
| 4.65138888888889 | 0.416 | 0 | 0 | 0 | 0 |
| 4.65277777777778 | 0.317 | 0 | 0 | 0 | 0 |
| 4.65416666666667 | 0.157 | 0 | 0 | 0 | 0 |
| 4.65555555555556 | 0.745 | 0 | 0 | 0 | 0 |
| 4.65694444444444 | 0.86 | 0 | 0 | 0 | 0 |